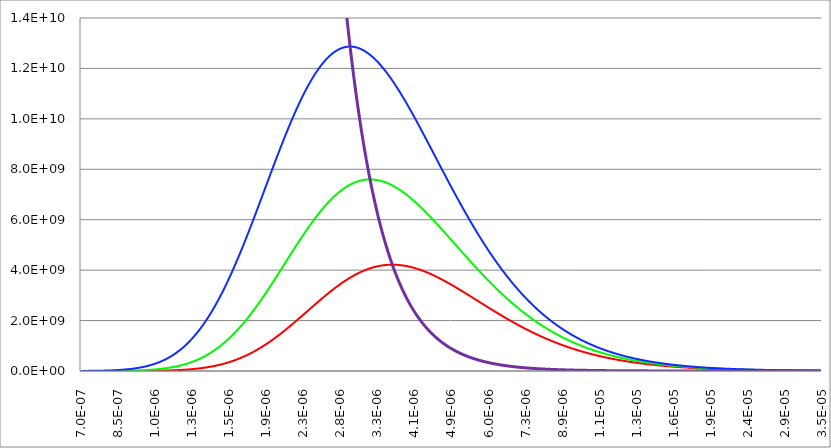
| Category | Series 1 | Series 0 | Series 2 | Series 3 |
|---|---|---|---|---|
| 7e-07 | 15470.366 | 268712.566 | 2637047.107 | 15642470399238.4 |
| 7.0137054801877e-07 | 16108.577 | 278241.494 | 2718401.957 | 15490231803650.4 |
| 7.02743779468786e-07 | 16771.471 | 288083.208 | 2802046.737 | 15339474853185.9 |
| 7.04119699604006e-07 | 17459.935 | 298247.075 | 2888039.017 | 15190185127899.2 |
| 7.05498313688677e-07 | 18174.883 | 308742.713 | 2976437.619 | 15042348348185.3 |
| 7.06879626997351e-07 | 18917.263 | 319579.997 | 3067302.632 | 14895950373413.6 |
| 7.08263644814909e-07 | 19688.049 | 330769.063 | 3160695.437 | 14750977200575.9 |
| 7.09650372436578e-07 | 20488.25 | 342320.314 | 3256678.73 | 14607414962946.5 |
| 7.11039815167953e-07 | 21318.908 | 354244.43 | 3355316.541 | 14465249928756.1 |
| 7.12431978325018e-07 | 22181.096 | 366552.37 | 3456674.26 | 14324468499878.2 |
| 7.13826867234164e-07 | 23075.925 | 379255.377 | 3560818.659 | 14185057210528.9 |
| 7.15224487232211e-07 | 24004.538 | 392364.991 | 3667817.914 | 14047002725978.2 |
| 7.16624843666428e-07 | 24968.118 | 405893.048 | 3777741.631 | 13910291841274.9 |
| 7.18027941894555e-07 | 25967.885 | 419851.694 | 3890660.867 | 13774911479983.8 |
| 7.1943378728482e-07 | 27005.096 | 434253.385 | 4006648.154 | 13640848692934.2 |
| 7.20842385215962e-07 | 28081.049 | 449110.897 | 4125777.527 | 13508090656982.1 |
| 7.22253741077253e-07 | 29197.084 | 464437.333 | 4248124.543 | 13376624673783.3 |
| 7.23667860268514e-07 | 30354.582 | 480246.131 | 4373766.309 | 13246438168578.6 |
| 7.25084748200141e-07 | 31554.967 | 496551.068 | 4502781.506 | 13117518688991.3 |
| 7.26504410293122e-07 | 32799.709 | 513366.272 | 4635250.416 | 12989853903836.4 |
| 7.27926851979058e-07 | 34090.324 | 530706.223 | 4771254.942 | 12863431601940.2 |
| 7.29352078700186e-07 | 35428.373 | 548585.77 | 4910878.641 | 12738239690973.4 |
| 7.30780095909398e-07 | 36815.467 | 567020.127 | 5054206.743 | 12614266196293.7 |
| 7.32210909070263e-07 | 38253.267 | 586024.891 | 5201326.181 | 12491499259800.7 |
| 7.33644523657047e-07 | 39743.484 | 605616.046 | 5352325.618 | 12369927138801.6 |
| 7.35080945154732e-07 | 41287.882 | 625809.968 | 5507295.468 | 12249538204888.1 |
| 7.36520179059044e-07 | 42888.279 | 646623.44 | 5666327.93 | 12130320942824.1 |
| 7.37962230876463e-07 | 44546.549 | 668073.654 | 5829517.011 | 12012263949444.3 |
| 7.39407106124256e-07 | 46264.621 | 690178.222 | 5996958.551 | 11895355932563.2 |
| 7.4085481033049e-07 | 48044.485 | 712955.187 | 6168750.256 | 11779585709895.4 |
| 7.42305349034054e-07 | 49888.189 | 736423.027 | 6344991.721 | 11664942207986 |
| 7.43758727784685e-07 | 51797.843 | 760600.668 | 6525784.46 | 11551414461151 |
| 7.45214952142983e-07 | 53775.621 | 785507.489 | 6711231.933 | 11438991610428.7 |
| 7.46674027680436e-07 | 55823.761 | 811163.336 | 6901439.576 | 11327662902541.2 |
| 7.48135959979443e-07 | 57944.568 | 837588.528 | 7096514.826 | 11217417688865.7 |
| 7.4960075463333e-07 | 60140.415 | 864803.866 | 7296567.153 | 11108245424415.7 |
| 7.51068417246375e-07 | 62413.746 | 892830.645 | 7501708.087 | 11000135666832.7 |
| 7.5253895343383e-07 | 64767.076 | 921690.661 | 7712051.249 | 10893078075387.4 |
| 7.54012368821939e-07 | 67202.993 | 951406.223 | 7927712.375 | 10787062409990.4 |
| 7.55488669047963e-07 | 69724.164 | 982000.162 | 8148809.354 | 10682078530213 |
| 7.56967859760202e-07 | 72333.329 | 1013495.841 | 8375462.249 | 10578116394316.5 |
| 7.58449946618013e-07 | 75033.312 | 1045917.167 | 8607793.332 | 10475166058293.1 |
| 7.59934935291832e-07 | 77827.016 | 1079288.597 | 8845927.112 | 10373217674913.5 |
| 7.61422831463202e-07 | 80717.429 | 1113635.154 | 9089990.366 | 10272261492785.5 |
| 7.62913640824785e-07 | 83707.624 | 1148982.433 | 9340112.167 | 10172287855421.2 |
| 7.64407369080393e-07 | 86800.761 | 1185356.616 | 9596423.919 | 10073287200313.6 |
| 7.65904021945003e-07 | 90000.094 | 1222784.478 | 9859059.381 | 9975250058021.42 |
| 7.67403605144781e-07 | 93308.966 | 1261293.403 | 10128154.705 | 9878167051263.96 |
| 7.68906124417108e-07 | 96730.815 | 1300911.393 | 10403848.46 | 9782028894023.67 |
| 7.70411585510594e-07 | 100269.177 | 1341667.08 | 10686281.669 | 9686826390658.2 |
| 7.71919994185107e-07 | 103927.688 | 1383589.734 | 10975597.836 | 9592550435020.74 |
| 7.73431356211793e-07 | 107710.085 | 1426709.282 | 11271942.978 | 9499192009589.04 |
| 7.74945677373094e-07 | 111620.21 | 1471056.313 | 11575465.659 | 9406742184602.87 |
| 7.76462963462777e-07 | 115662.011 | 1516662.092 | 11886317.017 | 9315192117209.91 |
| 7.77983220285953e-07 | 119839.546 | 1563558.574 | 12204650.8 | 9224533050619.9 |
| 7.79506453659095e-07 | 124156.986 | 1611778.416 | 12530623.396 | 9134756313267.07 |
| 7.81032669410068e-07 | 128618.616 | 1661354.985 | 12864393.864 | 9045853317980.7 |
| 7.82561873378147e-07 | 133228.838 | 1712322.377 | 13206123.966 | 8957815561163.73 |
| 7.84094071414038e-07 | 137992.175 | 1764715.424 | 13555978.201 | 8870634621979.43 |
| 7.85629269379904e-07 | 142913.274 | 1818569.711 | 13914123.835 | 8784302161545.91 |
| 7.87167473149385e-07 | 147996.908 | 1873921.588 | 14280730.935 | 8698809922138.52 |
| 7.88708688607621e-07 | 153247.977 | 1930808.18 | 14655972.399 | 8614149726399.99 |
| 7.90252921651276e-07 | 158671.515 | 1989267.405 | 15040023.989 | 8530313476558.27 |
| 7.91800178188557e-07 | 164272.692 | 2049337.984 | 15433064.365 | 8447293153651.97 |
| 7.9335046413924e-07 | 170056.813 | 2111059.457 | 15835275.116 | 8365080816763.35 |
| 7.94903785434693e-07 | 176029.328 | 2174472.194 | 16246840.793 | 8283668602258.76 |
| 7.96460148017893e-07 | 182195.83 | 2239617.411 | 16667948.939 | 8203048723036.49 |
| 7.98019557843459e-07 | 188562.06 | 2306537.184 | 17098790.127 | 8123213467781.92 |
| 7.99582020877662e-07 | 195133.911 | 2375274.462 | 17539557.987 | 8044155200229.93 |
| 8.0114754309846e-07 | 201917.43 | 2445873.08 | 17990449.24 | 7965866358434.53 |
| 8.02716130495512e-07 | 208918.823 | 2518377.779 | 18451663.734 | 7888339454045.5 |
| 8.04287789070206e-07 | 216144.456 | 2592834.213 | 18923404.47 | 7811567071592.15 |
| 8.0586252483568e-07 | 223600.864 | 2669288.97 | 19405877.643 | 7735541867774.03 |
| 8.07440343816843e-07 | 231294.749 | 2747789.584 | 19899292.664 | 7660256570758.56 |
| 8.09021252050405e-07 | 239232.983 | 2828384.548 | 20403862.203 | 7585703979485.44 |
| 8.10605255584892e-07 | 247422.621 | 2911123.335 | 20919802.214 | 7511876962977.89 |
| 8.12192360480673e-07 | 255870.892 | 2996056.407 | 21447331.97 | 7438768459660.57 |
| 8.13782572809984e-07 | 264585.214 | 3083235.234 | 21986674.097 | 7366371476684.11 |
| 8.15375898656947e-07 | 273573.191 | 3172712.309 | 22538054.602 | 7294679089256.31 |
| 8.16972344117601e-07 | 282842.62 | 3264541.163 | 23101702.909 | 7223684439979.69 |
| 8.18571915299916e-07 | 292401.495 | 3358776.381 | 23677851.89 | 7153380738195.66 |
| 8.20174618323824e-07 | 302258.01 | 3455473.618 | 24266737.895 | 7083761259334.93 |
| 8.21780459321238e-07 | 312420.566 | 3554689.616 | 24868600.786 | 7014819344274.34 |
| 8.23389444436076e-07 | 322897.769 | 3656482.218 | 25483683.97 | 6946548398699.9 |
| 8.25001579824288e-07 | 333698.445 | 3760910.385 | 26112234.426 | 6878941892476.06 |
| 8.26616871653875e-07 | 344831.632 | 3868034.216 | 26754502.741 | 6811993359021.05 |
| 8.28235326104914e-07 | 356306.595 | 3977914.958 | 27410743.139 | 6745696394688.43 |
| 8.29856949369584e-07 | 368132.826 | 4090615.03 | 28081213.514 | 6680044658154.5 |
| 8.31481747652186e-07 | 380320.046 | 4206198.032 | 28766175.457 | 6615031869811.79 |
| 8.33109727169169e-07 | 392878.216 | 4324728.769 | 29465894.293 | 6550651811168.41 |
| 8.34740894149155e-07 | 405817.538 | 4446273.265 | 30180639.105 | 6486898324253.26 |
| 8.3637525483296e-07 | 419148.46 | 4570898.778 | 30910682.77 | 6423765311026.98 |
| 8.38012815473616e-07 | 432881.682 | 4698673.82 | 31656301.985 | 6361246732798.73 |
| 8.39653582336404e-07 | 447028.16 | 4829668.177 | 32417777.302 | 6299336609648.53 |
| 8.41297561698868e-07 | 461599.112 | 4963952.918 | 33195393.152 | 6238029019855.3 |
| 8.42944759850844e-07 | 476606.024 | 5101600.422 | 33989437.877 | 6177318099330.47 |
| 8.44595183094481e-07 | 492060.653 | 5242684.39 | 34800203.761 | 6117198041057.04 |
| 8.46248837744272e-07 | 507975.034 | 5387279.864 | 35627987.057 | 6057663094534.16 |
| 8.47905730127068e-07 | 524361.485 | 5535463.246 | 36473088.015 | 5998707565227.08 |
| 8.4956586658211e-07 | 541232.612 | 5687312.315 | 37335810.914 | 5940325814022.49 |
| 8.51229253461052e-07 | 558601.317 | 5842906.244 | 38216464.086 | 5882512256689.11 |
| 8.52895897127981e-07 | 576480.799 | 6002325.621 | 39115359.946 | 5825261363343.55 |
| 8.54565803959447e-07 | 594884.565 | 6165652.464 | 40032815.019 | 5768567657921.43 |
| 8.56238980344484e-07 | 613826.431 | 6332970.243 | 40969149.967 | 5712425717653.53 |
| 8.57915432684634e-07 | 633320.534 | 6504363.894 | 41924689.617 | 5656830172547.12 |
| 8.59595167393975e-07 | 653381.329 | 6679919.842 | 42899762.987 | 5601775704872.33 |
| 8.61278190899141e-07 | 674023.606 | 6859726.015 | 43894703.308 | 5547257048653.53 |
| 8.62964509639351e-07 | 695262.486 | 7043871.867 | 44909848.057 | 5493268989165.56 |
| 8.6465413006643e-07 | 717113.434 | 7232448.394 | 45945538.978 | 5439806362435.03 |
| 8.66347058644837e-07 | 739592.261 | 7425548.152 | 47002122.106 | 5386864054746.32 |
| 8.68043301851684e-07 | 762715.135 | 7623265.279 | 48079947.794 | 5334437002152.49 |
| 8.6974286617677e-07 | 786498.584 | 7825695.511 | 49179370.734 | 5282520189990.9 |
| 8.71445758122596e-07 | 810959.501 | 8032936.203 | 50300749.985 | 5231108652403.53 |
| 8.73151984204397e-07 | 836115.156 | 8245086.345 | 51444448.992 | 5180197471862.06 |
| 8.74861550950164e-07 | 861983.198 | 8462246.586 | 52610835.61 | 5129781778697.42 |
| 8.76574464900668e-07 | 888581.664 | 8684519.245 | 53800282.127 | 5079856750634.07 |
| 8.78290732609489e-07 | 915928.985 | 8912008.341 | 55013165.285 | 5030417612328.75 |
| 8.80010360643035e-07 | 944043.994 | 9144819.601 | 56249866.301 | 4981459634913.65 |
| 8.81733355580574e-07 | 972945.932 | 9383060.488 | 57510770.885 | 4932978135544.17 |
| 8.83459724014252e-07 | 1002654.456 | 9626840.213 | 58796269.267 | 4884968476950.96 |
| 8.85189472549125e-07 | 1033189.643 | 9876269.761 | 60106756.209 | 4837426066996.39 |
| 8.8692260780318e-07 | 1064572.002 | 10131461.905 | 61442631.028 | 4790346358235.28 |
| 8.88659136407362e-07 | 1096822.481 | 10392531.227 | 62804297.613 | 4743724847479.95 |
| 8.90399065005598e-07 | 1129962.469 | 10659594.137 | 64192164.445 | 4697557075369.51 |
| 8.92142400254825e-07 | 1164013.808 | 10932768.893 | 65606644.61 | 4651838625943.28 |
| 8.93889148825011e-07 | 1198998.803 | 11212175.62 | 67048155.818 | 4606565126218.43 |
| 8.95639317399186e-07 | 1234940.223 | 11497936.327 | 68517120.42 | 4561732245771.72 |
| 8.97392912673464e-07 | 1271861.312 | 11790174.93 | 70013965.422 | 4517335696325.24 |
| 8.99149941357068e-07 | 1309785.8 | 12089017.269 | 71539122.499 | 4473371231336.27 |
| 9.0091041017236e-07 | 1348737.905 | 12394591.125 | 73093028.009 | 4429834645591.11 |
| 9.02674325854863e-07 | 1388742.346 | 12707026.244 | 74676123.007 | 4386721774802.82 |
| 9.04441695153284e-07 | 1429824.348 | 13026454.351 | 76288853.257 | 4344028495212.92 |
| 9.0621252482955e-07 | 1472009.65 | 13353009.175 | 77931669.246 | 4301750723196.94 |
| 9.07986821658821e-07 | 1515324.517 | 13686826.46 | 79605026.191 | 4259884414873.85 |
| 9.09764592429527e-07 | 1559795.744 | 14028043.991 | 81309384.052 | 4218425565719.23 |
| 9.11545843943387e-07 | 1605450.666 | 14376801.611 | 83045207.542 | 4177370210182.22 |
| 9.13330583015437e-07 | 1652317.166 | 14733241.236 | 84812966.133 | 4136714421306.3 |
| 9.15118816474057e-07 | 1700423.686 | 15097506.88 | 86613134.069 | 4096454310353.54 |
| 9.16910551160998e-07 | 1749799.233 | 15469744.668 | 88446190.367 | 4056586026432.79 |
| 9.18705793931403e-07 | 1800473.386 | 15850102.857 | 90312618.83 | 4017105756131.23 |
| 9.2050455165384e-07 | 1852476.31 | 16238731.857 | 92212908.047 | 3978009723149.65 |
| 9.22306831210322e-07 | 1905838.76 | 16635784.244 | 94147551.401 | 3939294187941.26 |
| 9.24112639496342e-07 | 1960592.093 | 17041414.782 | 96117047.072 | 3900955447354 |
| 9.25921983420888e-07 | 2016768.275 | 17455780.442 | 98121898.042 | 3862989834276.31 |
| 9.27734869906479e-07 | 2074399.891 | 17879040.415 | 100162612.093 | 3825393717286.4 |
| 9.29551305889186e-07 | 2133520.154 | 18311356.138 | 102239701.813 | 3788163500304.85 |
| 9.3137129831866e-07 | 2194162.914 | 18752891.302 | 104353684.593 | 3751295622250.74 |
| 9.3319485415816e-07 | 2256362.666 | 19203811.878 | 106505082.63 | 3714786556700.91 |
| 9.3502198038458e-07 | 2320154.564 | 19664286.132 | 108694422.921 | 3678632811552.76 |
| 9.3685268398847e-07 | 2385574.423 | 20134484.64 | 110922237.267 | 3642830928690.19 |
| 9.38686971974069e-07 | 2452658.735 | 20614580.307 | 113189062.263 | 3607377483652.8 |
| 9.40524851359333e-07 | 2521444.675 | 21104748.387 | 115495439.298 | 3572269085308.38 |
| 9.42366329175955e-07 | 2591970.112 | 21605166.494 | 117841914.55 | 3537502375528.55 |
| 9.44211412469395e-07 | 2664273.617 | 22116014.624 | 120229038.977 | 3503074028867.52 |
| 9.46060108298909e-07 | 2738394.476 | 22637475.168 | 122657368.315 | 3468980752244.05 |
| 9.47912423737576e-07 | 2814372.695 | 23169732.931 | 125127463.063 | 3435219284626.42 |
| 9.49768365872321e-07 | 2892249.013 | 23712975.147 | 127639888.48 | 3401786396720.56 |
| 9.51627941803946e-07 | 2972064.913 | 24267391.495 | 130195214.57 | 3368678890661.14 |
| 9.53491158647154e-07 | 3053862.628 | 24833174.115 | 132794016.077 | 3335893599705.67 |
| 9.55358023530582e-07 | 3137685.153 | 25410517.624 | 135436872.466 | 3303427387931.66 |
| 9.5722854359682e-07 | 3223576.258 | 25999619.129 | 138124367.913 | 3271277149936.63 |
| 9.59102726002443e-07 | 3311580.491 | 26600678.246 | 140857091.293 | 3239439810541.07 |
| 9.60980577918044e-07 | 3401743.195 | 27213897.113 | 143635636.158 | 3207912324494.31 |
| 9.62862106528247e-07 | 3494110.515 | 27839480.404 | 146460600.729 | 3176691676183.27 |
| 9.64747319031749e-07 | 3588729.408 | 28477635.343 | 149332587.87 | 3145774879343.95 |
| 9.6663622264134e-07 | 3685647.654 | 29128571.721 | 152252205.077 | 3115158976775.85 |
| 9.68528824583929e-07 | 3784913.866 | 29792501.906 | 155220064.451 | 3084841040059.09 |
| 9.7042513210058e-07 | 3886577.501 | 30469640.86 | 158236782.684 | 3054818169274.32 |
| 9.72325152446531e-07 | 3990688.869 | 31160206.152 | 161302981.029 | 3025087492725.32 |
| 9.74228892891225e-07 | 4097299.146 | 31864417.966 | 164419285.286 | 2995646166664.32 |
| 9.76136360718341e-07 | 4206460.379 | 32582499.122 | 167586325.77 | 2966491375020.04 |
| 9.78047563225816e-07 | 4318225.505 | 33314675.082 | 170804737.288 | 2937620329128.27 |
| 9.79962507725876e-07 | 4432648.352 | 34061173.964 | 174075159.114 | 2909030267465.17 |
| 9.81881201545066e-07 | 4549783.656 | 34822226.556 | 177398234.96 | 2880718455383.14 |
| 9.83803652024274e-07 | 4669687.071 | 35598066.322 | 180774612.945 | 2852682184849.21 |
| 9.85729866518761e-07 | 4792415.176 | 36388929.419 | 184204945.567 | 2824918774186.05 |
| 9.8765985239819e-07 | 4918025.489 | 37195054.706 | 187689889.671 | 2797425567815.44 |
| 9.89593617046652e-07 | 5046576.476 | 38016683.753 | 191230106.416 | 2770199936004.3 |
| 9.91531167862697e-07 | 5178127.561 | 38854060.851 | 194826261.241 | 2743239274613.13 |
| 9.93472512259359e-07 | 5312739.14 | 39707433.023 | 198479023.831 | 2716541004846.9 |
| 9.95417657664187e-07 | 5450472.587 | 40577050.034 | 202189068.078 | 2690102573008.45 |
| 9.97366611519274e-07 | 5591390.268 | 41463164.398 | 205957072.046 | 2663921450254.18 |
| 9.99319381281282e-07 | 5735555.55 | 42366031.388 | 209783717.932 | 2637995132352.16 |
| 1.00127597442147e-06 | 5883032.814 | 43285909.044 | 213669692.024 | 2612321139442.64 |
| 1.00323639842574e-06 | 6033887.46 | 44223058.178 | 217615684.66 | 2586897015800.83 |
| 1.00520066079463e-06 | 6188185.926 | 45177742.387 | 221622390.188 | 2561720329601.98 |
| 1.00716876904337e-06 | 6345995.691 | 46150228.054 | 225690506.918 | 2536788672688.83 |
| 1.00914073070191e-06 | 6507385.29 | 47140784.359 | 229820737.082 | 2512099660341.23 |
| 1.01111655331494e-06 | 6672424.324 | 48149683.282 | 234013786.782 | 2487650931048.05 |
| 1.01309624444193e-06 | 6841183.469 | 49177199.611 | 238270365.944 | 2463440146281.31 |
| 1.01507981165714e-06 | 7013734.489 | 50223610.944 | 242591188.273 | 2439464990272.49 |
| 1.01706726254965e-06 | 7190150.244 | 51289197.698 | 246976971.197 | 2415723169791.03 |
| 1.01905860472343e-06 | 7370504.701 | 52374243.11 | 251428435.819 | 2392212413924.98 |
| 1.02105384579731e-06 | 7554872.949 | 53479033.241 | 255946306.862 | 2368930473863.78 |
| 1.02305299340504e-06 | 7743331.201 | 54603856.981 | 260531312.616 | 2345875122683.17 |
| 1.02505605519534e-06 | 7935956.814 | 55749006.048 | 265184184.883 | 2323044155132.19 |
| 1.02706303883188e-06 | 8132828.291 | 56914774.998 | 269905658.919 | 2300435387422.23 |
| 1.02907395199334e-06 | 8334025.298 | 58101461.218 | 274696473.376 | 2278046657018.16 |
| 1.03108880237345e-06 | 8539628.669 | 59309364.931 | 279557370.242 | 2255875822431.48 |
| 1.03310759768097e-06 | 8749720.422 | 60538789.198 | 284489094.784 | 2233920763015.5 |
| 1.0351303456398e-06 | 8964383.763 | 61790039.917 | 289492395.481 | 2212179378762.48 |
| 1.03715705398892e-06 | 9183703.101 | 63063425.823 | 294568023.961 | 2190649590102.75 |
| 1.03918773048249e-06 | 9407764.056 | 64359258.486 | 299716734.943 | 2169329337705.85 |
| 1.04122238288984e-06 | 9636653.471 | 65677852.309 | 304939286.162 | 2148216582283.51 |
| 1.04326101899551e-06 | 9870459.418 | 67019524.531 | 310236438.307 | 2127309304394.61 |
| 1.04530364659929e-06 | 10109271.214 | 68384595.218 | 315608954.951 | 2106605504252.01 |
| 1.04735027351623e-06 | 10353179.424 | 69773387.264 | 321057602.483 | 2086103201531.27 |
| 1.0494009075767e-06 | 10602275.877 | 71186226.386 | 326583150.032 | 2065800435181.25 |
| 1.05145555662638e-06 | 10856653.673 | 72623441.119 | 332186369.401 | 2045695263236.52 |
| 1.05351422852632e-06 | 11116407.19 | 74085362.812 | 337868034.987 | 2025785762631.59 |
| 1.05557693115297e-06 | 11381632.101 | 75572325.625 | 343628923.71 | 2006070029017.01 |
| 1.05764367239818e-06 | 11652425.375 | 77084666.518 | 349469814.935 | 1986546176577.2 |
| 1.05971446016928e-06 | 11928885.293 | 78622725.247 | 355391490.395 | 1967212337850.07 |
| 1.06178930238906e-06 | 12211111.452 | 80186844.357 | 361394734.111 | 1948066663548.37 |
| 1.06386820699584e-06 | 12499204.78 | 81777369.174 | 367480332.312 | 1929107322382.87 |
| 1.06595118194345e-06 | 12793267.541 | 83394647.794 | 373649073.354 | 1910332500887.12 |
| 1.06803823520134e-06 | 13093403.343 | 85039031.079 | 379901747.635 | 1891740403244.07 |
| 1.07012937475452e-06 | 13399717.152 | 86710872.642 | 386239147.517 | 1873329251114.22 |
| 1.07222460860366e-06 | 13712315.295 | 88410528.838 | 392662067.231 | 1855097283465.59 |
| 1.07432394476508e-06 | 14031305.475 | 90138358.756 | 399171302.799 | 1837042756405.22 |
| 1.07642739127082e-06 | 14356796.772 | 91894724.201 | 405767651.942 | 1819163943012.43 |
| 1.07853495616862e-06 | 14688899.658 | 93679989.689 | 412451913.991 | 1801459133173.56 |
| 1.08064664752197e-06 | 15027726.002 | 95494522.427 | 419224889.796 | 1783926633418.47 |
| 1.08276247341019e-06 | 15373389.079 | 97338692.304 | 426087381.637 | 1766564766758.53 |
| 1.08488244192838e-06 | 15726003.578 | 99212871.874 | 433040193.13 | 1749371872526.19 |
| 1.0870065611875e-06 | 16085685.608 | 101117436.341 | 440084129.13 | 1732346306216.18 |
| 1.08913483931439e-06 | 16452552.711 | 103052763.545 | 447219995.64 | 1715486439328.19 |
| 1.09126728445182e-06 | 16826723.863 | 105019233.944 | 454448599.713 | 1698790659211.1 |
| 1.09340390475847e-06 | 17208319.487 | 107017230.595 | 461770749.351 | 1682257368908.76 |
| 1.09554470840901e-06 | 17597461.455 | 109047139.141 | 469187253.411 | 1665884987007.2 |
| 1.09768970359413e-06 | 17994273.099 | 111109347.786 | 476698921.504 | 1649671947483.37 |
| 1.09983889852054e-06 | 18398879.219 | 113204247.281 | 484306563.89 | 1633616699555.39 |
| 1.10199230141102e-06 | 18811406.085 | 115332230.9 | 492010991.38 | 1617717707534.18 |
| 1.10414992050445e-06 | 19231981.446 | 117493694.423 | 499813015.23 | 1601973450676.59 |
| 1.10631176405584e-06 | 19660734.539 | 119689036.11 | 507713447.036 | 1586382423039.92 |
| 1.10847784033636e-06 | 20097796.09 | 121918656.681 | 515713098.631 | 1570943133337.9 |
| 1.1106481576334e-06 | 20543298.324 | 124182959.296 | 523812781.975 | 1555654104798.02 |
| 1.11282272425053e-06 | 20997374.971 | 126482349.524 | 532013309.049 | 1540513875020.33 |
| 1.11500154850763e-06 | 21460161.268 | 128817235.324 | 540315491.744 | 1525520995837.49 |
| 1.11718463874082e-06 | 21931793.967 | 131188027.02 | 548720141.753 | 1510674033176.29 |
| 1.11937200330257e-06 | 22412411.342 | 133595137.271 | 557228070.458 | 1495971566920.5 |
| 1.1215636505617e-06 | 22902153.19 | 136038981.047 | 565840088.82 | 1481412190774.98 |
| 1.12375958890342e-06 | 23401160.839 | 138519975.601 | 574557007.262 | 1466994512131.23 |
| 1.12595982672934e-06 | 23909577.149 | 141038540.442 | 583379635.558 | 1452717151934.15 |
| 1.12816437245754e-06 | 24427546.521 | 143595097.303 | 592308782.716 | 1438578744550.11 |
| 1.13037323452257e-06 | 24955214.899 | 146190070.112 | 601345256.864 | 1424577937636.41 |
| 1.13258642137549e-06 | 25492729.772 | 148823884.965 | 610489865.128 | 1410713392011.82 |
| 1.13480394148392e-06 | 26040240.18 | 151496970.089 | 619743413.519 | 1396983781528.58 |
| 1.13702580333206e-06 | 26597896.718 | 154209755.814 | 629106706.81 | 1383387792945.51 |
| 1.1392520154207e-06 | 27165851.535 | 156962674.54 | 638580548.419 | 1369924125802.37 |
| 1.14148258626729e-06 | 27744258.344 | 159756160.701 | 648165740.286 | 1356591492295.55 |
| 1.14371752440596e-06 | 28333272.416 | 162590650.73 | 657863082.75 | 1343388617154.82 |
| 1.14595683838754e-06 | 28933050.591 | 165466583.029 | 667673374.43 | 1330314237521.37 |
| 1.14820053677961e-06 | 29543751.272 | 168384397.928 | 677597412.098 | 1317367102827.04 |
| 1.15044862816652e-06 | 30165534.436 | 171344537.65 | 687635990.557 | 1304545974674.67 |
| 1.15270112114942e-06 | 30798561.625 | 174347446.273 | 697789902.513 | 1291849626719.67 |
| 1.15495802434631e-06 | 31442995.957 | 177393569.692 | 708059938.451 | 1279276844552.71 |
| 1.15721934639207e-06 | 32099002.121 | 180483355.581 | 718446886.509 | 1266826425583.57 |
| 1.15948509593847e-06 | 32766746.38 | 183617253.351 | 728951532.347 | 1254497178926.08 |
| 1.16175528165423e-06 | 33446396.572 | 186795714.113 | 739574659.022 | 1242287925284.27 |
| 1.16402991222504e-06 | 34138122.108 | 190019190.631 | 750317046.858 | 1230197496839.51 |
| 1.1663089963536e-06 | 34842093.973 | 193288137.284 | 761179473.317 | 1218224737138.85 |
| 1.16859254275964e-06 | 35558484.728 | 196603010.024 | 772162712.864 | 1206368500984.38 |
| 1.17088056017997e-06 | 36287468.504 | 199964266.328 | 783267536.843 | 1194627654323.71 |
| 1.1731730573685e-06 | 37029221.008 | 203372365.157 | 794494713.342 | 1183001074141.48 |
| 1.17547004309628e-06 | 37783919.513 | 206827766.91 | 805845007.06 | 1171487648351.96 |
| 1.17777152615156e-06 | 38551742.866 | 210330933.378 | 817319179.173 | 1160086275692.66 |
| 1.18007751533974e-06 | 39332871.476 | 213882327.695 | 828917987.204 | 1148795865619 |
| 1.18238801948352e-06 | 40127487.322 | 217482414.296 | 840642184.889 | 1137615338200.03 |
| 1.18470304742284e-06 | 40935773.941 | 221131658.861 | 852492522.037 | 1126543624015.07 |
| 1.18702260801495e-06 | 41757916.43 | 224830528.272 | 864469744.403 | 1115579664051.49 |
| 1.18934671013445e-06 | 42594101.445 | 228579490.564 | 876574593.545 | 1104722409603.37 |
| 1.19167536267331e-06 | 43444517.191 | 232379014.867 | 888807806.694 | 1093970822171.19 |
| 1.19400857454093e-06 | 44309353.421 | 236229571.363 | 901170116.613 | 1083323873362.54 |
| 1.19634635466411e-06 | 45188801.435 | 240131631.23 | 913662251.464 | 1072780544793.69 |
| 1.19868871198718e-06 | 46083054.071 | 244085666.589 | 926284934.669 | 1062339827992.23 |
| 1.20103565547195e-06 | 46992305.699 | 248092150.451 | 939038884.772 | 1052000724300.62 |
| 1.20338719409778e-06 | 47916752.222 | 252151556.664 | 951924815.302 | 1041762244780.59 |
| 1.20574333686161e-06 | 48856591.062 | 256264359.857 | 964943434.637 | 1031623410118.66 |
| 1.20810409277802e-06 | 49812021.162 | 260431035.385 | 978095445.861 | 1021583250532.37 |
| 1.21046947087919e-06 | 50783242.974 | 264652059.27 | 991381546.629 | 1011640805677.57 |
| 1.21283948021505e-06 | 51770458.452 | 268927908.148 | 1004802429.026 | 1001795124556.55 |
| 1.21521412985318e-06 | 52773871.049 | 273259059.209 | 1018358779.43 | 992045265427.081 |
| 1.21759342887897e-06 | 53793685.707 | 277645990.139 | 1032051278.372 | 982390295712.34 |
| 1.21997738639557e-06 | 54830108.848 | 282089179.058 | 1045880600.396 | 972829291911.697 |
| 1.22236601152395e-06 | 55883348.366 | 286589104.465 | 1059847413.919 | 963361339512.391 |
| 1.22475931340296e-06 | 56953613.622 | 291146245.175 | 1073952381.093 | 953985532902.054 |
| 1.22715730118933e-06 | 58041115.429 | 295761080.257 | 1088196157.666 | 944700975282.09 |
| 1.2295599840577e-06 | 59146066.046 | 300434088.974 | 1102579392.838 | 935506778581.894 |
| 1.23196737120072e-06 | 60268679.168 | 305165750.718 | 1117102729.126 | 926402063373.91 |
| 1.23437947182899e-06 | 61409169.916 | 309956544.949 | 1131766802.223 | 917385958789.51 |
| 1.23679629517117e-06 | 62567754.824 | 314806951.13 | 1146572240.857 | 908457602435.701 |
| 1.23921785047398e-06 | 63744651.83 | 319717448.663 | 1161519666.652 | 899616140312.633 |
| 1.24164414700226e-06 | 64940080.264 | 324688516.824 | 1176609693.991 | 890860726731.912 |
| 1.24407519403896e-06 | 66154260.836 | 329720634.695 | 1191842929.872 | 882190524235.712 |
| 1.24651100088523e-06 | 67387415.624 | 334814281.102 | 1207219973.772 | 873604703516.675 |
| 1.24895157686043e-06 | 68639768.061 | 339969934.544 | 1222741417.507 | 865102443338.579 |
| 1.25139693130215e-06 | 69911542.923 | 345188073.127 | 1238407845.096 | 856682930457.797 |
| 1.25384707356628e-06 | 71202966.312 | 350469174.497 | 1254219832.618 | 848345359545.501 |
| 1.25630201302702e-06 | 72514265.646 | 355813715.769 | 1270177948.074 | 840088933110.638 |
| 1.25876175907693e-06 | 73845669.643 | 361222173.457 | 1286282751.253 | 831912861423.646 |
| 1.26122632112694e-06 | 75197408.308 | 366695023.41 | 1302534793.592 | 823816362440.92 |
| 1.26369570860642e-06 | 76569712.913 | 372232740.733 | 1318934618.039 | 815798661730.004 |
| 1.26616993096322e-06 | 77962815.986 | 377835799.723 | 1335482758.913 | 807858992395.522 |
| 1.26864899766366e-06 | 79376951.296 | 383504673.794 | 1352179741.774 | 799996595005.82 |
| 1.27113291819261e-06 | 80812353.829 | 389239835.406 | 1369026083.28 | 792210717520.329 |
| 1.2736217020535e-06 | 82269259.781 | 395041755.992 | 1386022291.057 | 784500615217.629 |
| 1.27611535876838e-06 | 83747906.534 | 400910905.885 | 1403168863.559 | 776865550624.219 |
| 1.27861389787792e-06 | 85248532.64 | 406847754.245 | 1420466289.939 | 769304793443.978 |
| 1.28111732894151e-06 | 86771377.803 | 412852768.985 | 1437915049.91 | 761817620488.307 |
| 1.28362566153721e-06 | 88316682.861 | 418926416.696 | 1455515613.612 | 754403315606.963 |
| 1.28613890526187e-06 | 89884689.766 | 425069162.571 | 1473268441.484 | 747061169619.552 |
| 1.28865706973111e-06 | 91475641.566 | 431281470.333 | 1491173984.126 | 739790480247.702 |
| 1.29118016457939e-06 | 93089782.382 | 437563802.156 | 1509232682.17 | 732590552047.882 |
| 1.29370819946002e-06 | 94727357.393 | 443916618.588 | 1527444966.15 | 725460696344.894 |
| 1.29624118404522e-06 | 96388612.809 | 450340378.478 | 1545811256.37 | 718400231165.989 |
| 1.29877912802613e-06 | 98073795.855 | 456835538.898 | 1564331962.778 | 711408481175.645 |
| 1.3013220411129e-06 | 99783154.747 | 463402555.063 | 1583007484.832 | 704484777610.966 |
| 1.30386993303466e-06 | 101516938.669 | 470041880.254 | 1601838211.378 | 697628458217.715 |
| 1.30642281353959e-06 | 103275397.755 | 476753965.743 | 1620824520.519 | 690838867186.974 |
| 1.30898069239498e-06 | 105058783.06 | 483539260.71 | 1639966779.491 | 684115355092.407 |
| 1.31154357938723e-06 | 106867346.54 | 490398212.168 | 1659265344.538 | 677457278828.153 |
| 1.31411148432188e-06 | 108701341.031 | 497331264.882 | 1678720560.787 | 670864001547.301 |
| 1.31668441702371e-06 | 110561020.219 | 504338861.287 | 1698332762.126 | 664334892600.987 |
| 1.31926238733671e-06 | 112446638.619 | 511421441.415 | 1718102271.078 | 657869327478.062 |
| 1.32184540512414e-06 | 114358451.549 | 518579442.808 | 1738029398.687 | 651466687745.364 |
| 1.32443348026859e-06 | 116296715.106 | 525813300.442 | 1758114444.391 | 645126360988.564 |
| 1.32702662267199e-06 | 118261686.138 | 533123446.644 | 1778357695.905 | 638847740753.585 |
| 1.32962484225564e-06 | 120253622.219 | 540510311.014 | 1798759429.105 | 632630226488.597 |
| 1.3322281489603e-06 | 122272781.622 | 547974320.34 | 1819319907.909 | 626473223486.575 |
| 1.33483655274617e-06 | 124319423.293 | 555515898.521 | 1840039384.162 | 620376142828.41 |
| 1.33745006359295e-06 | 126393806.82 | 563135466.483 | 1860918097.522 | 614338401326.587 |
| 1.3400686914999e-06 | 128496192.409 | 570833442.097 | 1881956275.345 | 608359421469.396 |
| 1.34269244648583e-06 | 130626840.855 | 578610240.1 | 1903154132.575 | 602438631365.695 |
| 1.34532133858918e-06 | 132786013.51 | 586466272.012 | 1924511871.632 | 596575464690.209 |
| 1.34795537786806e-06 | 134973972.257 | 594401946.051 | 1946029682.303 | 590769360629.36 |
| 1.35059457440024e-06 | 137190979.48 | 602417667.055 | 1967707741.633 | 585019763827.628 |
| 1.35323893828325e-06 | 139437298.034 | 610513836.399 | 1989546213.818 | 579326124334.425 |
| 1.35588847963438e-06 | 141713191.213 | 618690851.91 | 2011545250.103 | 573687897551.498 |
| 1.35854320859071e-06 | 144018922.719 | 626949107.787 | 2033704988.671 | 568104544180.834 |
| 1.36120313530921e-06 | 146354756.636 | 635288994.519 | 2056025554.548 | 562575530173.08 |
| 1.3638682699667e-06 | 148720957.391 | 643710898.8 | 2078507059.497 | 557100326676.456 |
| 1.36653862275994e-06 | 151117789.726 | 652215203.45 | 2101149601.919 | 551678409986.175 |
| 1.36921420390565e-06 | 153545518.667 | 660802287.328 | 2123953266.754 | 546309261494.348 |
| 1.37189502364056e-06 | 156004409.488 | 669472525.254 | 2146918125.389 | 540992367640.376 |
| 1.37458109222143e-06 | 158494727.678 | 678226287.925 | 2170044235.556 | 535727219861.837 |
| 1.37727241992512e-06 | 161016738.912 | 687063941.831 | 2193331641.242 | 530513314545.831 |
| 1.3799690170486e-06 | 163570709.01 | 695985849.174 | 2216780372.599 | 525350152980.818 |
| 1.382670893909e-06 | 166156903.91 | 704992367.786 | 2240390445.847 | 520237241308.908 |
| 1.38537806084365e-06 | 168775589.627 | 714083851.046 | 2264161863.194 | 515174090478.633 |
| 1.38809052821014e-06 | 171427032.223 | 723260647.8 | 2288094612.742 | 510160216198.159 |
| 1.3908083063863e-06 | 174111497.768 | 732523102.275 | 2312188668.402 | 505195138888.971 |
| 1.39353140577031e-06 | 176829252.306 | 741871554.001 | 2336443989.816 | 500278383639.999 |
| 1.3962598367807e-06 | 179580561.819 | 751306337.729 | 2360860522.269 | 495409480162.188 |
| 1.3989936098564e-06 | 182365692.192 | 760827783.345 | 2385438196.61 | 490587962743.522 |
| 1.40173273545677e-06 | 185184909.171 | 770436215.797 | 2410176929.177 | 485813370204.475 |
| 1.40447722406166e-06 | 188038478.333 | 780131955.005 | 2435076621.716 | 481085245853.898 |
| 1.40722708617144e-06 | 190926665.042 | 789915315.787 | 2460137161.308 | 476403137445.338 |
| 1.40998233230703e-06 | 193849734.415 | 799786607.775 | 2485358420.297 | 471766597133.781 |
| 1.41274297300995e-06 | 196807951.286 | 809746135.336 | 2510740256.217 | 467175181432.813 |
| 1.41550901884237e-06 | 199801580.161 | 819794197.49 | 2536282511.724 | 462628451172.203 |
| 1.41828048038712e-06 | 202830885.184 | 829931087.834 | 2561985014.527 | 458125971455.894 |
| 1.42105736824777e-06 | 205896130.099 | 840157094.458 | 2587847577.327 | 453667311620.41 |
| 1.42383969304864e-06 | 208997578.206 | 850472499.87 | 2613869997.746 | 449252045193.652 |
| 1.42662746543486e-06 | 212135492.325 | 860877580.914 | 2640052058.272 | 444879749854.122 |
| 1.4294206960724e-06 | 215310134.757 | 871372608.695 | 2666393526.196 | 440550007390.511 |
| 1.4322193956481e-06 | 218521767.239 | 881957848.497 | 2692894153.558 | 436262403661.711 |
| 1.43502357486975e-06 | 221770650.908 | 892633559.708 | 2719553677.085 | 432016528557.19 |
| 1.43783324446607e-06 | 225057046.259 | 903399995.744 | 2746371818.144 | 427811975957.777 |
| 1.44064841518682e-06 | 228381213.103 | 914257403.969 | 2773348282.686 | 423648343696.806 |
| 1.44346909780279e-06 | 231743410.526 | 925206025.62 | 2800482761.2 | 419525233521.655 |
| 1.44629530310586e-06 | 235143896.849 | 936246095.732 | 2827774928.664 | 415442251055.651 |
| 1.44912704190904e-06 | 238582929.585 | 947377843.062 | 2855224444.496 | 411399005760.347 |
| 1.45196432504652e-06 | 242060765.397 | 958601490.015 | 2882830952.519 | 407395110898.17 |
| 1.45480716337369e-06 | 245577660.054 | 969917252.567 | 2910594080.912 | 403430183495.425 |
| 1.4576555677672e-06 | 249133868.393 | 981325340.196 | 2938513442.176 | 399503844305.667 |
| 1.46050954912499e-06 | 252729644.272 | 992825955.802 | 2966588633.094 | 395615717773.423 |
| 1.46336911836634e-06 | 256365240.53 | 1004419295.642 | 2994819234.7 | 391765431998.274 |
| 1.46623428643193e-06 | 260040908.94 | 1016105549.252 | 3023204812.241 | 387952618699.278 |
| 1.46910506428381e-06 | 263756900.171 | 1027884899.377 | 3051744915.152 | 384176913179.749 |
| 1.47198146290556e-06 | 267513463.741 | 1039757521.904 | 3080439077.027 | 380437954292.368 |
| 1.4748634933022e-06 | 271310847.973 | 1051723585.785 | 3109286815.59 | 376735384404.642 |
| 1.47775116650035e-06 | 275149299.953 | 1063783252.972 | 3138287632.674 | 373068849364.699 |
| 1.48064449354818e-06 | 279029065.484 | 1075936678.349 | 3167441014.198 | 369437998467.407 |
| 1.48354348551552e-06 | 282950389.045 | 1088184009.659 | 3196746430.15 | 365842484420.837 |
| 1.48644815349385e-06 | 286913513.741 | 1100525387.44 | 3226203334.567 | 362281963313.034 |
| 1.48935850859639e-06 | 290918681.266 | 1112960944.96 | 3255811165.523 | 358756094579.132 |
| 1.4922745619581e-06 | 294966131.852 | 1125490808.144 | 3285569345.116 | 355264540968.775 |
| 1.49519632473574e-06 | 299056104.225 | 1138115095.517 | 3315477279.455 | 351806968513.854 |
| 1.49812380810794e-06 | 303188835.564 | 1150833918.134 | 3345534358.657 | 348383046496.572 |
| 1.50105702327519e-06 | 307364561.453 | 1163647379.517 | 3375739956.837 | 344992447417.804 |
| 1.50399598145992e-06 | 311583515.836 | 1176555575.594 | 3406093432.106 | 341634846965.773 |
| 1.50694069390654e-06 | 315845930.971 | 1189558594.634 | 3436594126.573 | 338309923985.031 |
| 1.50989117188145e-06 | 320152037.389 | 1202656517.19 | 3467241366.342 | 335017360445.74 |
| 1.51284742667314e-06 | 324502063.84 | 1215849416.032 | 3498034461.517 | 331756841413.25 |
| 1.51580946959218e-06 | 328896237.259 | 1229137356.095 | 3528972706.209 | 328528055017.98 |
| 1.5187773119713e-06 | 333334782.709 | 1242520394.412 | 3560055378.543 | 325330692425.582 |
| 1.5217509651654e-06 | 337817923.345 | 1255998580.064 | 3591281740.671 | 322164447807.407 |
| 1.52473044055165e-06 | 342345880.36 | 1269571954.117 | 3622651038.781 | 319029018311.246 |
| 1.52771574952944e-06 | 346918872.947 | 1283240549.57 | 3654162503.115 | 315924104032.367 |
| 1.53070690352053e-06 | 351537118.246 | 1297004391.296 | 3685815347.986 | 312849407984.828 |
| 1.53370391396901e-06 | 356200831.305 | 1310863495.993 | 3717608771.799 | 309804636073.066 |
| 1.5367067923414e-06 | 360910225.028 | 1324817872.123 | 3749541957.071 | 306789497063.775 |
| 1.53971555012665e-06 | 365665510.136 | 1338867519.869 | 3781614070.456 | 303803702558.042 |
| 1.54273019883622e-06 | 370466895.113 | 1353012431.076 | 3813824262.775 | 300846966963.763 |
| 1.54575075000409e-06 | 375314586.169 | 1367252589.205 | 3846171669.042 | 297919007468.329 |
| 1.54877721518685e-06 | 380208787.186 | 1381587969.283 | 3878655408.496 | 295019544011.575 |
| 1.55180960596369e-06 | 385149699.68 | 1396018537.853 | 3911274584.638 | 292148299258.986 |
| 1.5548479339365e-06 | 390137522.749 | 1410544252.927 | 3944028285.262 | 289304998575.176 |
| 1.55789221072985e-06 | 395172453.031 | 1425165063.944 | 3976915582.5 | 286489369997.619 |
| 1.5609424479911e-06 | 400254684.657 | 1439880911.717 | 4009935532.857 | 283701144210.632 |
| 1.5639986573904e-06 | 405384409.206 | 1454691728.399 | 4043087177.259 | 280940054519.617 |
| 1.56706085062075e-06 | 410561815.661 | 1469597437.43 | 4076369541.097 | 278205836825.552 |
| 1.57012903939805e-06 | 415787090.359 | 1484597953.502 | 4109781634.274 | 275498229599.728 |
| 1.57320323546114e-06 | 421060416.952 | 1499693182.516 | 4143322451.256 | 272816973858.736 |
| 1.57628345057183e-06 | 426381976.358 | 1514883021.541 | 4176990971.126 | 270161813139.694 |
| 1.57936969651497e-06 | 431751946.716 | 1530167358.778 | 4210786157.637 | 267532493475.717 |
| 1.58246198509849e-06 | 437170503.343 | 1545546073.522 | 4244706959.272 | 264928763371.622 |
| 1.58556032815343e-06 | 442637818.688 | 1561019036.123 | 4278752309.298 | 262350373779.877 |
| 1.58866473753399e-06 | 448154062.287 | 1576586107.956 | 4312921125.836 | 259797078076.777 |
| 1.59177522511759e-06 | 453719400.72 | 1592247141.383 | 4347212311.918 | 257268632038.854 |
| 1.59489180280489e-06 | 459333997.565 | 1608001979.722 | 4381624755.557 | 254764793819.518 |
| 1.59801448251987e-06 | 464998013.357 | 1623850457.215 | 4416157329.816 | 252285323925.923 |
| 1.60114327620985e-06 | 470711605.538 | 1639792398.999 | 4450808892.878 | 249829985196.062 |
| 1.60427819584553e-06 | 476474928.421 | 1655827621.074 | 4485578288.117 | 247398542776.079 |
| 1.60741925342107e-06 | 482288133.141 | 1671955930.28 | 4520464344.178 | 244990764097.809 |
| 1.61056646095408e-06 | 488151367.612 | 1688177124.265 | 4555465875.053 | 242606418856.529 |
| 1.61371983048573e-06 | 494064776.488 | 1704490991.463 | 4590581680.159 | 240245278988.931 |
| 1.61687937408077e-06 | 500028501.113 | 1720897311.069 | 4625810544.424 | 237907118651.309 |
| 1.62004510382753e-06 | 506042679.488 | 1737395853.018 | 4661151238.366 | 235591714197.954 |
| 1.62321703183806e-06 | 512107446.218 | 1753986377.959 | 4696602518.186 | 233298844159.764 |
| 1.62639517024809e-06 | 518222932.479 | 1770668637.239 | 4732163125.852 | 231028289223.063 |
| 1.62957953121712e-06 | 524389265.97 | 1787442372.881 | 4767831789.192 | 228779832208.618 |
| 1.63277012692846e-06 | 530606570.875 | 1804307317.57 | 4803607221.986 | 226553258050.868 |
| 1.63596696958928e-06 | 536874967.819 | 1821263194.632 | 4839488124.063 | 224348353777.357 |
| 1.63917007143063e-06 | 543194573.828 | 1838309718.022 | 4875473181.397 | 222164908488.356 |
| 1.64237944470752e-06 | 549565502.291 | 1855446592.309 | 4911561066.206 | 220002713336.696 |
| 1.64559510169897e-06 | 555987862.914 | 1872673512.665 | 4947750437.056 | 217861561507.79 |
| 1.64881705470801e-06 | 562461761.686 | 1889990164.851 | 4984039938.963 | 215741248199.85 |
| 1.65204531606179e-06 | 568987300.835 | 1907396225.209 | 5020428203.497 | 213641570604.299 |
| 1.65527989811157e-06 | 575564578.789 | 1924891360.655 | 5056913848.895 | 211562327886.371 |
| 1.65852081323281e-06 | 582193690.14 | 1942475228.668 | 5093495480.166 | 209503321165.903 |
| 1.66176807382519e-06 | 588874725.602 | 1960147477.287 | 5130171689.203 | 207464353498.31 |
| 1.66502169231268e-06 | 595607771.974 | 1977907745.107 | 5166941054.901 | 205445229855.749 |
| 1.66828168114355e-06 | 602392912.101 | 1995755661.272 | 5203802143.271 | 203445757108.463 |
| 1.67154805279046e-06 | 609230224.841 | 2013690845.478 | 5240753507.554 | 201465744006.31 |
| 1.67482081975051e-06 | 616119785.019 | 2031712907.971 | 5277793688.347 | 199505001160.467 |
| 1.67809999454523e-06 | 623061663.399 | 2049821449.546 | 5314921213.722 | 197563341025.317 |
| 1.68138558972069e-06 | 630055926.644 | 2068016061.551 | 5352134599.346 | 195640577880.511 |
| 1.68467761784752e-06 | 637102637.278 | 2086296325.89 | 5389432348.615 | 193736527813.201 |
| 1.68797609152096e-06 | 644201853.657 | 2104661815.031 | 5426812952.773 | 191851008700.452 |
| 1.69128102336091e-06 | 651353629.924 | 2123112092.007 | 5464274891.047 | 189983840191.817 |
| 1.69459242601198e-06 | 658558015.985 | 2141646710.428 | 5501816630.775 | 188134843692.093 |
| 1.69791031214355e-06 | 665815057.466 | 2160265214.49 | 5539436627.541 | 186303842344.234 |
| 1.70123469444977e-06 | 673124795.688 | 2178967138.983 | 5577133325.306 | 184490661012.433 |
| 1.70456558564969e-06 | 680487267.623 | 2197752009.305 | 5614905156.552 | 182695126265.377 |
| 1.70790299848723e-06 | 687902505.873 | 2216619341.475 | 5652750542.412 | 180917066359.649 |
| 1.71124694573127e-06 | 695370538.629 | 2235568642.148 | 5690667892.815 | 179156311223.309 |
| 1.7145974401757e-06 | 702891389.642 | 2254599408.631 | 5728655606.626 | 177412692439.623 |
| 1.71795449463944e-06 | 710465078.193 | 2273711128.899 | 5766712071.789 | 175686043230.952 |
| 1.72131812196654e-06 | 718091619.063 | 2292903281.615 | 5804835665.475 | 173976198442.804 |
| 1.72468833502616e-06 | 725771022.498 | 2312175336.152 | 5843024754.224 | 172282994528.033 |
| 1.72806514671268e-06 | 733503294.185 | 2331526752.612 | 5881277694.099 | 170606269531.198 |
| 1.73144856994573e-06 | 741288435.219 | 2350956981.851 | 5919592830.829 | 168945863073.072 |
| 1.73483861767022e-06 | 749126442.076 | 2370465465.5 | 5957968499.968 | 167301616335.299 |
| 1.73823530285641e-06 | 757017306.586 | 2390051635.996 | 5996403027.041 | 165673372045.207 |
| 1.74163863849996e-06 | 764961015.902 | 2409714916.605 | 6034894727.705 | 164060974460.761 |
| 1.74504863762198e-06 | 772957552.477 | 2429454721.452 | 6073441907.899 | 162464269355.67 |
| 1.74846531326905e-06 | 781006894.035 | 2449270455.552 | 6112042864.006 | 160883104004.63 |
| 1.75188867851332e-06 | 789109013.548 | 2469161514.839 | 6150695883.01 | 159317327168.721 |
| 1.75531874645252e-06 | 797263879.208 | 2489127286.199 | 6189399242.657 | 157766789080.94 |
| 1.75875553021004e-06 | 805471454.403 | 2509167147.508 | 6228151211.616 | 156231341431.873 |
| 1.76219904293494e-06 | 813731697.694 | 2529280467.66 | 6266950049.642 | 154710837355.51 |
| 1.76564929780205e-06 | 822044562.791 | 2549466606.612 | 6305794007.744 | 153205131415.201 |
| 1.76910630801197e-06 | 830409998.532 | 2569724915.414 | 6344681328.343 | 151714079589.738 |
| 1.77257008679117e-06 | 838827948.856 | 2590054736.256 | 6383610245.447 | 150237539259.587 |
| 1.776040647392e-06 | 847298352.789 | 2610455402.504 | 6422578984.816 | 148775369193.24 |
| 1.77951800309277e-06 | 855821144.415 | 2630926238.742 | 6461585764.131 | 147327429533.711 |
| 1.78300216719778e-06 | 864396252.862 | 2651466560.818 | 6500628793.164 | 145893581785.154 |
| 1.78649315303738e-06 | 873023602.28 | 2672075675.887 | 6539706273.954 | 144473688799.622 |
| 1.78999097396801e-06 | 881703111.822 | 2692752882.459 | 6578816400.976 | 143067614763.941 |
| 1.79349564337228e-06 | 890434695.626 | 2713497470.444 | 6617957361.315 | 141675225186.726 |
| 1.79700717465899e-06 | 899218262.796 | 2734308721.2 | 6657127334.844 | 140296386885.514 |
| 1.80052558126319e-06 | 908053717.388 | 2755185907.588 | 6696324494.4 | 138930967974.025 |
| 1.80405087664626e-06 | 916940958.392 | 2776128294.019 | 6735547005.959 | 137578837849.548 |
| 1.8075830742959e-06 | 925879879.717 | 2797135136.506 | 6774793028.816 | 136239867180.447 |
| 1.81112218772624e-06 | 934870370.173 | 2818205682.722 | 6814060715.763 | 134913927893.795 |
| 1.81466823047787e-06 | 943912313.463 | 2839339172.05 | 6853348213.271 | 133600893163.116 |
| 1.81822121611788e-06 | 953005588.163 | 2860534835.646 | 6892653661.672 | 132300637396.261 |
| 1.82178115823993e-06 | 962150067.714 | 2881791896.488 | 6931975195.336 | 131013036223.393 |
| 1.8253480704643e-06 | 971345620.406 | 2903109569.445 | 6971310942.86 | 129737966485.09 |
| 1.82892196643793e-06 | 980592109.371 | 2924487061.327 | 7010659027.248 | 128475306220.565 |
| 1.83250285983449e-06 | 989889392.569 | 2945923570.955 | 7050017566.097 | 127224934655.999 |
| 1.8360907643544e-06 | 999237322.776 | 2967418289.219 | 7089384671.78 | 125986732192.995 |
| 1.83968569372492e-06 | 1008635747.582 | 2988970399.141 | 7128758451.638 | 124760580397.13 |
| 1.8432876617002e-06 | 1018084509.375 | 3010579075.945 | 7168137008.158 | 123546361986.633 |
| 1.8468966820613e-06 | 1027583445.337 | 3032243487.116 | 7207518439.168 | 122343960821.164 |
| 1.85051276861626e-06 | 1037132387.438 | 3053962792.477 | 7246900838.02 | 121153261890.707 |
| 1.85413593520017e-06 | 1046731162.423 | 3075736144.247 | 7286282293.783 | 119974151304.565 |
| 1.8577661956752e-06 | 1056379591.817 | 3097562687.118 | 7325660891.429 | 118806516280.473 |
| 1.86140356393066e-06 | 1066077491.909 | 3119441558.324 | 7365034712.022 | 117650245133.805 |
| 1.86504805388305e-06 | 1075824673.757 | 3141371887.714 | 7404401832.912 | 116505227266.894 |
| 1.86869967947614e-06 | 1085620943.179 | 3163352797.82 | 7443760327.924 | 115371353158.451 |
| 1.87235845468097e-06 | 1095466100.752 | 3185383403.941 | 7483108267.548 | 114248514353.093 |
| 1.87602439349596e-06 | 1105359941.81 | 3207462814.207 | 7522443719.133 | 113136603450.964 |
| 1.87969750994692e-06 | 1115302256.444 | 3229590129.665 | 7561764747.078 | 112035514097.468 |
| 1.88337781808713e-06 | 1125292829.499 | 3251764444.351 | 7601069413.022 | 110945140973.092 |
| 1.88706533199738e-06 | 1135331440.578 | 3273984845.373 | 7640355776.043 | 109865379783.333 |
| 1.89076006578603e-06 | 1145417864.04 | 3296250412.986 | 7679621892.845 | 108796127248.722 |
| 1.89446203358908e-06 | 1155551869.003 | 3318560220.674 | 7718865817.955 | 107737281094.947 |
| 1.89817124957018e-06 | 1165733219.347 | 3340913335.235 | 7758085603.914 | 106688740043.071 |
| 1.90188772792073e-06 | 1175961673.716 | 3363308816.861 | 7797279301.474 | 105650403799.838 |
| 1.90561148285991e-06 | 1186236985.526 | 3385745719.223 | 7836444959.788 | 104622173048.091 |
| 1.90934252863474e-06 | 1196558902.963 | 3408223089.553 | 7875580626.611 | 103603949437.261 |
| 1.91308087952013e-06 | 1206927168.996 | 3430739968.734 | 7914684348.486 | 102595635573.968 |
| 1.91682654981895e-06 | 1217341521.381 | 3453295391.385 | 7953754170.943 | 101597135012.701 |
| 1.92057955386207e-06 | 1227801692.664 | 3475888385.947 | 7992788138.693 | 100608352246.594 |
| 1.92433990600841e-06 | 1238307410.196 | 3498517974.774 | 8031784295.825 | 99629192698.292 |
| 1.92810762064501e-06 | 1248858396.136 | 3521183174.221 | 8070740685.995 | 98659562710.903 |
| 1.93188271218708e-06 | 1259454367.465 | 3543882994.737 | 8109655352.624 | 97699369539.038 |
| 1.93566519507806e-06 | 1270095035.993 | 3566616440.952 | 8148526339.092 | 96748521339.947 |
| 1.93945508378966e-06 | 1280780108.372 | 3589382511.775 | 8187351688.933 | 95806927164.724 |
| 1.94325239282192e-06 | 1291509286.106 | 3612180200.48 | 8226129446.028 | 94874496949.618 |
| 1.94705713670328e-06 | 1302282265.565 | 3635008494.808 | 8264857654.799 | 93951141507.408 |
| 1.95086932999062e-06 | 1313098738 | 3657866377.055 | 8303534360.406 | 93036772518.884 |
| 1.95468898726934e-06 | 1323958389.554 | 3680752824.172 | 8342157608.936 | 92131302524.387 |
| 1.95851612315336e-06 | 1334860901.276 | 3703666807.857 | 8380725447.598 | 91234644915.452 |
| 1.96235075228524e-06 | 1345805949.144 | 3726607294.658 | 8419235924.92 | 90346713926.522 |
| 1.96619288933621e-06 | 1356793204.071 | 3749573246.068 | 8457687090.937 | 89467424626.743 |
| 1.97004254900621e-06 | 1367822331.932 | 3772563618.62 | 8496076997.385 | 88596692911.839 |
| 1.97389974602397e-06 | 1378892993.573 | 3795577363.995 | 8534403697.895 | 87734435496.074 |
| 1.97776449514706e-06 | 1390004844.839 | 3818613429.114 | 8572665248.185 | 86880569904.275 |
| 1.98163681116194e-06 | 1401157536.584 | 3841670756.244 | 8610859706.246 | 86035014463.956 |
| 1.98551670888403e-06 | 1412350714.7 | 3864748283.096 | 8648985132.541 | 85197688297.494 |
| 1.98940420315774e-06 | 1423584020.131 | 3887844942.931 | 8687039590.19 | 84368511314.401 |
| 1.99329930885656e-06 | 1434857088.898 | 3910959664.661 | 8725021145.162 | 83547404203.661 |
| 1.99720204088309e-06 | 1446169552.123 | 3934091372.952 | 8762927866.464 | 82734288426.142 |
| 2.00111241416911e-06 | 1457521036.047 | 3957238988.328 | 8800757826.332 | 81929086207.087 |
| 2.00503044367565e-06 | 1468911162.061 | 3980401427.277 | 8838509100.415 | 81131720528.672 |
| 2.00895614439301e-06 | 1480339546.723 | 4003577602.358 | 8876179767.969 | 80342115122.64 |
| 2.01288953134086e-06 | 1491805801.79 | 4026766422.303 | 8913767912.036 | 79560194463.008 |
| 2.01683061956826e-06 | 1503309534.24 | 4049966792.125 | 8951271619.639 | 78785883758.84 |
| 2.02077942415376e-06 | 1514850346.302 | 4073177613.227 | 8988688981.963 | 78019108947.095 |
| 2.02473596020539e-06 | 1526427835.479 | 4096397783.507 | 9026018094.541 | 77259796685.541 |
| 2.02870024286081e-06 | 1538041594.583 | 4119626197.467 | 9063257057.437 | 76507874345.743 |
| 2.03267228728729e-06 | 1549691211.758 | 4142861746.324 | 9100403975.434 | 75763270006.112 |
| 2.03665210868179e-06 | 1561376270.511 | 4166103318.114 | 9137456958.212 | 75025912445.029 |
| 2.04063972227104e-06 | 1573096349.746 | 4189349797.804 | 9174414120.532 | 74295731134.033 |
| 2.04463514331159e-06 | 1584851023.791 | 4212600067.405 | 9211273582.416 | 73572656231.07 |
| 2.04863838708984e-06 | 1596639862.432 | 4235853006.076 | 9248033469.33 | 72856618573.818 |
| 2.05264946892213e-06 | 1608462430.946 | 4259107490.241 | 9284691912.361 | 72147549673.07 |
| 2.05666840415479e-06 | 1620318290.131 | 4282362393.695 | 9321247048.396 | 71445381706.182 |
| 2.06069520816419e-06 | 1632206996.344 | 4305616587.718 | 9357697020.298 | 70750047510.585 |
| 2.06472989635682e-06 | 1644128101.534 | 4328868941.189 | 9394039977.088 | 70061480577.364 |
| 2.06877248416932e-06 | 1656081153.276 | 4352118320.692 | 9430274074.112 | 69379615044.894 |
| 2.07282298706855e-06 | 1668065694.809 | 4375363590.633 | 9466397473.223 | 68704385692.542 |
| 2.07688142055168e-06 | 1680081265.072 | 4398603613.354 | 9502408342.951 | 68035727934.424 |
| 2.08094780014619e-06 | 1692127398.738 | 4421837249.24 | 9538304858.675 | 67373577813.236 |
| 2.08502214140998e-06 | 1704203626.26 | 4445063356.838 | 9574085202.796 | 66717871994.126 |
| 2.08910445993141e-06 | 1716309473.899 | 4468280792.97 | 9609747564.906 | 66068547758.646 |
| 2.09319477132936e-06 | 1728444463.774 | 4491488412.841 | 9645290141.96 | 65425542998.745 |
| 2.09729309125328e-06 | 1740608113.891 | 4514685070.161 | 9680711138.437 | 64788796210.834 |
| 2.10139943538328e-06 | 1752799938.194 | 4537869617.252 | 9716008766.515 | 64158246489.899 |
| 2.10551381943015e-06 | 1765019446.598 | 4561040905.166 | 9751181246.231 | 63533833523.678 |
| 2.10963625913546e-06 | 1777266145.035 | 4584197783.801 | 9786226805.648 | 62915497586.891 |
| 2.11376677027158e-06 | 1789539535.494 | 4607339102.009 | 9821143681.016 | 62303179535.529 |
| 2.11790536864178e-06 | 1801839116.068 | 4630463707.718 | 9855930116.935 | 61696820801.194 |
| 2.12205207008026e-06 | 1814164380.99 | 4653570448.041 | 9890584366.515 | 61096363385.498 |
| 2.12620689045222e-06 | 1826514820.686 | 4676658169.396 | 9925104691.539 | 60501749854.518 |
| 2.13036984565394e-06 | 1838889921.813 | 4699725717.616 | 9959489362.612 | 59912923333.298 |
| 2.13454095161282e-06 | 1851289167.308 | 4722771938.065 | 9993736659.327 | 59329827500.412 |
| 2.13872022428741e-06 | 1863712036.43 | 4745795675.757 | 10027844870.415 | 58752406582.577 |
| 2.14290767966756e-06 | 1876158004.813 | 4768795775.463 | 10061812293.899 | 58180605349.315 |
| 2.14710333377438e-06 | 1888626544.505 | 4791771081.835 | 10095637237.25 | 57614369107.674 |
| 2.15130720266038e-06 | 1901117124.02 | 4814720439.512 | 10129318017.532 | 57053643696.995 |
| 2.15551930240948e-06 | 1913629208.389 | 4837642693.243 | 10162852961.556 | 56498375483.732 |
| 2.15973964913711e-06 | 1926162259.199 | 4860536687.996 | 10196240406.029 | 55948511356.32 |
| 2.16396825899023e-06 | 1938715734.653 | 4883401269.072 | 10229478697.695 | 55403998720.097 |
| 2.16820514814743e-06 | 1951289089.613 | 4906235282.226 | 10262566193.486 | 54864785492.273 |
| 2.17245033281898e-06 | 1963881775.65 | 4929037573.774 | 10295501260.661 | 54330820096.948 |
| 2.17670382924687e-06 | 1976493241.099 | 4951806990.712 | 10328282276.954 | 53802051460.18 |
| 2.1809656537049e-06 | 1989122931.105 | 4974542380.828 | 10360907630.706 | 53278429005.094 |
| 2.18523582249875e-06 | 2001770287.679 | 4997242592.817 | 10393375721.012 | 52759902647.053 |
| 2.18951435196599e-06 | 2014434749.747 | 5019906476.392 | 10425684957.854 | 52246422788.863 |
| 2.19380125847622e-06 | 2027115753.204 | 5042532882.402 | 10457833762.237 | 51737940316.027 |
| 2.19809655843105e-06 | 2039812730.965 | 5065120662.941 | 10489820566.326 | 51234406592.05 |
| 2.20240026826422e-06 | 2052525113.022 | 5087668671.465 | 10521643813.574 | 50735773453.786 |
| 2.20671240444166e-06 | 2065252326.494 | 5110175762.901 | 10553301958.858 | 50241993206.834 |
| 2.21103298346153e-06 | 2077993795.685 | 5132640793.762 | 10584793468.605 | 49753018620.971 |
| 2.21536202185427e-06 | 2090748942.135 | 5155062622.256 | 10616116820.92 | 49268802925.636 |
| 2.21969953618271e-06 | 2103517184.677 | 5177440108.404 | 10647270505.713 | 48789299805.459 |
| 2.22404554304212e-06 | 2116297939.493 | 5199772114.144 | 10678253024.823 | 48314463395.83 |
| 2.22840005906022e-06 | 2129090620.169 | 5222057503.45 | 10709062892.139 | 47844248278.509 |
| 2.23276310089732e-06 | 2141894637.752 | 5244295142.434 | 10739698633.724 | 47378609477.285 |
| 2.23713468524635e-06 | 2154709400.806 | 5266483899.465 | 10770158787.932 | 46917502453.672 |
| 2.2415148288329e-06 | 2167534315.469 | 5288622645.273 | 10800441905.524 | 46460883102.653 |
| 2.24590354841533e-06 | 2180368785.51 | 5310710253.063 | 10830546549.788 | 46008707748.454 |
| 2.2503008607848e-06 | 2193212212.39 | 5332745598.621 | 10860471296.648 | 45560933140.372 |
| 2.25470678276536e-06 | 2206063995.314 | 5354727560.424 | 10890214734.781 | 45117516448.638 |
| 2.25912133121397e-06 | 2218923531.295 | 5376655019.75 | 10919775465.723 | 44678415260.319 |
| 2.26354452302062e-06 | 2231790215.211 | 5398526860.78 | 10949152103.98 | 44243587575.258 |
| 2.26797637510837e-06 | 2244663439.864 | 5420341970.716 | 10978343277.133 | 43812991802.064 |
| 2.2724169044334e-06 | 2257542596.035 | 5442099239.875 | 11007347625.948 | 43386586754.126 |
| 2.2768661279851e-06 | 2270427072.554 | 5463797561.807 | 11036163804.472 | 42964331645.679 |
| 2.28132406278613e-06 | 2283316256.348 | 5485435833.393 | 11064790480.139 | 42546186087.901 |
| 2.28579072589245e-06 | 2296209532.51 | 5507012954.955 | 11093226333.868 | 42132110085.048 |
| 2.29026613439344e-06 | 2309106284.354 | 5528527830.356 | 11121470060.161 | 41722064030.634 |
| 2.29475030541194e-06 | 2322005893.481 | 5549979367.109 | 11149520367.2 | 41316008703.633 |
| 2.29924325610431e-06 | 2334907739.833 | 5571366476.478 | 11177375976.94 | 40913905264.738 |
| 2.30374500366048e-06 | 2347811201.762 | 5592688073.582 | 11205035625.198 | 40515715252.64 |
| 2.30825556530408e-06 | 2360715656.083 | 5613943077.496 | 11232498061.749 | 40121400580.348 |
| 2.31277495829243e-06 | 2373620478.143 | 5635130411.353 | 11259762050.413 | 39730923531.552 |
| 2.31730319991664e-06 | 2386525041.88 | 5656249002.449 | 11286826369.137 | 39344246757.009 |
| 2.3218403075017e-06 | 2399428719.883 | 5677297782.335 | 11313689810.084 | 38961333270.975 |
| 2.32638629840648e-06 | 2412330883.456 | 5698275686.925 | 11340351179.717 | 38582146447.665 |
| 2.33094119002387e-06 | 2425230902.683 | 5719181656.591 | 11366809298.874 | 38206650017.75 |
| 2.33550499978081e-06 | 2438128146.484 | 5740014636.262 | 11393063002.852 | 37834808064.889 |
| 2.34007774513835e-06 | 2451021982.684 | 5760773575.523 | 11419111141.485 | 37466585022.292 |
| 2.34465944359174e-06 | 2463911778.074 | 5781457428.709 | 11444952579.214 | 37101945669.319 |
| 2.34925011267046e-06 | 2476796898.47 | 5802065155.004 | 11470586195.163 | 36740855128.112 |
| 2.35384976993834e-06 | 2489676708.783 | 5822595718.535 | 11496010883.212 | 36383278860.256 |
| 2.35845843299359e-06 | 2502550573.075 | 5843048088.466 | 11521225552.064 | 36029182663.478 |
| 2.36307611946886e-06 | 2515417854.629 | 5863421239.096 | 11546229125.316 | 35678532668.376 |
| 2.36770284703135e-06 | 2528277916.006 | 5883714149.946 | 11571020541.518 | 35331295335.178 |
| 2.37233863338283e-06 | 2541130119.115 | 5903925805.856 | 11595598754.243 | 34987437450.531 |
| 2.37698349625974e-06 | 2553973825.27 | 5924055197.073 | 11619962732.148 | 34646926124.33 |
| 2.38163745343323e-06 | 2566808395.259 | 5944101319.347 | 11644111459.031 | 34309728786.57 |
| 2.38630052270928e-06 | 2579633189.403 | 5964063174.014 | 11668043933.891 | 33975813184.229 |
| 2.3909727219287e-06 | 2592447567.624 | 5983939768.09 | 11691759170.984 | 33645147378.182 |
| 2.39565406896723e-06 | 2605250889.506 | 6003730114.358 | 11715256199.876 | 33317699740.151 |
| 2.40034458173563e-06 | 2618042514.359 | 6023433231.454 | 11738534065.496 | 32993438949.674 |
| 2.40504427817972e-06 | 2630821801.285 | 6043048143.956 | 11761591828.188 | 32672333991.114 |
| 2.40975317628046e-06 | 2643588109.236 | 6062573882.466 | 11784428563.756 | 32354354150.69 |
| 2.414471294054e-06 | 2656340797.087 | 6082009483.698 | 11807043363.513 | 32039469013.538 |
| 2.41919864955177e-06 | 2669079223.689 | 6101353990.559 | 11829435334.323 | 31727648460.805 |
| 2.42393526086057e-06 | 2681802747.942 | 6120606452.235 | 11851603598.649 | 31418862666.764 |
| 2.42868114610257e-06 | 2694510728.854 | 6139765924.271 | 11873547294.586 | 31113082095.967 |
| 2.43343632343545e-06 | 2707202525.603 | 6158831468.65 | 11895265575.908 | 30810277500.413 |
| 2.43820081105243e-06 | 2719877497.606 | 6177802153.877 | 11916757612.097 | 30510419916.756 |
| 2.44297462718236e-06 | 2732535004.577 | 6196677055.057 | 11938022588.386 | 30213480663.532 |
| 2.44775779008978e-06 | 2745174406.595 | 6215455253.971 | 11959059705.784 | 29919431338.416 |
| 2.45255031807498e-06 | 2757795064.163 | 6234135839.156 | 11979868181.115 | 29628243815.506 |
| 2.45735222947408e-06 | 2770396338.274 | 6252717905.978 | 12000447247.041 | 29339890242.63 |
| 2.46216354265912e-06 | 2782977590.474 | 6271200556.71 | 12020796152.094 | 29054343038.689 |
| 2.4669842760381e-06 | 2795538182.925 | 6289582900.607 | 12040914160.699 | 28771574891.008 |
| 2.47181444805504e-06 | 2808077478.465 | 6307864053.976 | 12060800553.198 | 28491558752.734 |
| 2.47665407719011e-06 | 2820594840.675 | 6326043140.25 | 12080454625.873 | 28214267840.242 |
| 2.48150318195964e-06 | 2833089633.941 | 6344119290.06 | 12099875690.966 | 27939675630.577 |
| 2.48636178091622e-06 | 2845561223.511 | 6362091641.302 | 12119063076.695 | 27667755858.916 |
| 2.49122989264877e-06 | 2858008975.565 | 6379959339.212 | 12138016127.274 | 27398482516.053 |
| 2.49610753578258e-06 | 2870432257.273 | 6397721536.429 | 12156734202.921 | 27131829845.916 |
| 2.50099472897945e-06 | 2882830436.857 | 6415377393.062 | 12175216679.88 | 26867772343.102 |
| 2.50589149093767e-06 | 2895202883.652 | 6432926076.761 | 12193462950.423 | 26606284750.433 |
| 2.51079784039218e-06 | 2907548968.172 | 6450366762.778 | 12211472422.863 | 26347342056.546 |
| 2.51571379611459e-06 | 2919868062.165 | 6467698634.03 | 12229244521.563 | 26090919493.499 |
| 2.52063937691324e-06 | 2932159538.678 | 6484920881.168 | 12246778686.935 | 25836992534.399 |
| 2.52557460163333e-06 | 2944422772.12 | 6502032702.63 | 12264074375.45 | 25585536891.059 |
| 2.53051948915694e-06 | 2956657138.315 | 6519033304.709 | 12281131059.637 | 25336528511.676 |
| 2.53547405840312e-06 | 2968862014.572 | 6535921901.61 | 12297948228.082 | 25089943578.527 |
| 2.54043832832796e-06 | 2981036779.738 | 6552697715.509 | 12314525385.429 | 24845758505.69 |
| 2.54541231792467e-06 | 2993180814.261 | 6569359976.61 | 12330862052.372 | 24603949936.795 |
| 2.55039604622365e-06 | 3005293500.249 | 6585907923.201 | 12346957765.654 | 24364494742.782 |
| 2.55538953229255e-06 | 3017374221.529 | 6602340801.712 | 12362812078.058 | 24127370019.692 |
| 2.56039279523637e-06 | 3029422363.708 | 6618657866.766 | 12378424558.398 | 23892553086.479 |
| 2.5654058541975e-06 | 3041437314.228 | 6634858381.234 | 12393794791.507 | 23660021482.834 |
| 2.57042872835579e-06 | 3053418462.429 | 6650941616.287 | 12408922378.23 | 23429752967.044 |
| 2.57546143692871e-06 | 3065365199.604 | 6666906851.445 | 12423806935.402 | 23201725513.858 |
| 2.58050399917128e-06 | 3077276919.058 | 6682753374.632 | 12438448095.839 | 22975917312.385 |
| 2.58555643437627e-06 | 3089153016.166 | 6698480482.216 | 12452845508.318 | 22752306764.005 |
| 2.59061876187421e-06 | 3100992888.429 | 6714087479.067 | 12466998837.556 | 22530872480.306 |
| 2.59569100103346e-06 | 3112795935.531 | 6729573678.595 | 12480907764.195 | 22311593281.034 |
| 2.60077317126032e-06 | 3124561559.398 | 6744938402.8 | 12494571984.772 | 22094448192.072 |
| 2.6058652919991e-06 | 3136289164.25 | 6760180982.314 | 12507991211.701 | 21879416443.428 |
| 2.61096738273214e-06 | 3147978156.66 | 6775300756.445 | 12521165173.243 | 21666477467.255 |
| 2.61607946297997e-06 | 3159627945.608 | 6790297073.22 | 12534093613.483 | 21455610895.878 |
| 2.6212015523013e-06 | 3171237942.538 | 6805169289.424 | 12546776292.297 | 21246796559.849 |
| 2.62633367029317e-06 | 3182807561.41 | 6819916770.642 | 12559212985.324 | 21040014486.016 |
| 2.63147583659095e-06 | 3194336218.754 | 6834538891.293 | 12571403483.933 | 20835244895.616 |
| 2.6366280708685e-06 | 3205823333.728 | 6849035034.674 | 12583347595.189 | 20632468202.377 |
| 2.64179039283816e-06 | 3217268328.167 | 6863404592.993 | 12595045141.819 | 20431665010.652 |
| 2.64696282225089e-06 | 3228670626.639 | 6877646967.401 | 12606495962.173 | 20232816113.555 |
| 2.65214537889631e-06 | 3240029656.495 | 6891761568.032 | 12617699910.188 | 20035902491.135 |
| 2.65733808260279e-06 | 3251344847.924 | 6905747814.034 | 12628656855.346 | 19840905308.546 |
| 2.66254095323753e-06 | 3262615634.002 | 6919605133.597 | 12639366682.637 | 19647805914.251 |
| 2.66775401070661e-06 | 3273841450.746 | 6933332963.99 | 12649829292.508 | 19456585838.238 |
| 2.67297727495509e-06 | 3285021737.164 | 6946930751.585 | 12660044600.828 | 19267226790.252 |
| 2.67821076596711e-06 | 3296155935.303 | 6960397951.889 | 12670012538.834 | 19079710658.045 |
| 2.68345450376589e-06 | 3307243490.303 | 6973734029.57 | 12679733053.092 | 18894019505.646 |
| 2.68870850841388e-06 | 3318283850.444 | 6986938458.483 | 12689206105.44 | 18710135571.642 |
| 2.69397280001282e-06 | 3329276467.195 | 7000010721.694 | 12698431672.943 | 18528041267.482 |
| 2.69924739870379e-06 | 3340220795.264 | 7012950311.508 | 12707409747.84 | 18347719175.794 |
| 2.70453232466731e-06 | 3351116292.643 | 7025756729.487 | 12716140337.492 | 18169152048.718 |
| 2.70982759812342e-06 | 3361962420.661 | 7038429486.473 | 12724623464.326 | 17992322806.256 |
| 2.71513323933173e-06 | 3372758644.027 | 7050968102.61 | 12732859165.782 | 17817214534.642 |
| 2.72044926859154e-06 | 3383504430.874 | 7063372107.364 | 12740847494.252 | 17643810484.718 |
| 2.72577570624187e-06 | 3394199252.814 | 7075641039.537 | 12748588517.024 | 17472094070.337 |
| 2.73111257266159e-06 | 3404842584.975 | 7087774447.29 | 12756082316.225 | 17302048866.775 |
| 2.73645988826944e-06 | 3415433906.048 | 7099771888.153 | 12763328988.755 | 17133658609.159 |
| 2.74181767352418e-06 | 3425972698.336 | 7111632929.045 | 12770328646.226 | 16966907190.913 |
| 2.74718594892457e-06 | 3436458447.792 | 7123357146.286 | 12777081414.903 | 16801778662.216 |
| 2.75256473500956e-06 | 3446890644.067 | 7134944125.609 | 12783587435.633 | 16638257228.476 |
| 2.75795405235828e-06 | 3457268780.55 | 7146393462.173 | 12789846863.781 | 16476327248.822 |
| 2.76335392159017e-06 | 3467592354.412 | 7157704760.572 | 12795859869.165 | 16315973234.603 |
| 2.76876436336502e-06 | 3477860866.647 | 7168877634.847 | 12801626635.985 | 16157179847.914 |
| 2.7741853983831e-06 | 3488073822.116 | 7179911708.49 | 12807147362.755 | 15999931900.12 |
| 2.77961704738518e-06 | 3498230729.581 | 7190806614.457 | 12812422262.23 | 15844214350.41 |
| 2.78505933115265e-06 | 3508331101.755 | 7201561995.169 | 12817451561.336 | 15690012304.356 |
| 2.79051227050761e-06 | 3518374455.333 | 7212177502.521 | 12822235501.096 | 15537311012.488 |
| 2.7959758863129e-06 | 3528360311.035 | 7222652797.884 | 12826774336.555 | 15386095868.883 |
| 2.8014501994722e-06 | 3538288193.644 | 7232987552.107 | 12831068336.707 | 15236352409.769 |
| 2.80693523093016e-06 | 3548157632.047 | 7243181445.522 | 12835117784.414 | 15088066312.142 |
| 2.8124310016724e-06 | 3557968159.264 | 7253234167.943 | 12838922976.335 | 14941223392.394 |
| 2.81793753272565e-06 | 3567719312.493 | 7263145418.666 | 12842484222.84 | 14795809604.957 |
| 2.82345484515778e-06 | 3577410633.145 | 7272914906.466 | 12845801847.936 | 14651811040.961 |
| 2.82898296007795e-06 | 3587041666.876 | 7282542349.6 | 12848876189.182 | 14509213926.901 |
| 2.83452189863663e-06 | 3596611963.622 | 7292027475.798 | 12851707597.611 | 14368004623.323 |
| 2.84007168202568e-06 | 3606121077.64 | 7301370022.26 | 12854296437.644 | 14228169623.516 |
| 2.84563233147849e-06 | 3615568567.535 | 7310569735.653 | 12856643087.011 | 14089695552.222 |
| 2.85120386827e-06 | 3624953996.294 | 7319626372.102 | 12858747936.658 | 13952569164.357 |
| 2.85678631371681e-06 | 3634276931.324 | 7328539697.186 | 12860611390.669 | 13816777343.742 |
| 2.86237968917726e-06 | 3643536944.477 | 7337309485.925 | 12862233866.178 | 13682307101.851 |
| 2.8679840160515e-06 | 3652733612.086 | 7345935522.772 | 12863615793.276 | 13549145576.566 |
| 2.8735993157816e-06 | 3661866514.995 | 7354417601.607 | 12864757614.932 | 13417280030.949 |
| 2.87922560985157e-06 | 3670935238.589 | 7362755525.718 | 12865659786.895 | 13286697852.022 |
| 2.88486291978754e-06 | 3679939372.822 | 7370949107.794 | 12866322777.606 | 13157386549.564 |
| 2.89051126715774e-06 | 3688878512.25 | 7378998169.913 | 12866747068.113 | 13029333754.91 |
| 2.89617067357265e-06 | 3697752256.055 | 7386902543.52 | 12866933151.969 | 12902527219.774 |
| 2.90184116068506e-06 | 3706560208.074 | 7394662069.42 | 12866881535.148 | 12776954815.074 |
| 2.90752275019015e-06 | 3715301976.83 | 7402276597.757 | 12866592735.947 | 12652604529.774 |
| 2.91321546382558e-06 | 3723977175.553 | 7409745987.998 | 12866067284.894 | 12529464469.734 |
| 2.91891932337158e-06 | 3732585422.209 | 7417070108.916 | 12865305724.65 | 12407522856.571 |
| 2.924634350651e-06 | 3741126339.524 | 7424248838.569 | 12864308609.916 | 12286768026.534 |
| 2.93036056752945e-06 | 3749599555.011 | 7431282064.28 | 12863076507.337 | 12167188429.39 |
| 2.93609799591532e-06 | 3758004700.992 | 7438169682.619 | 12861609995.401 | 12048772627.316 |
| 2.94184665775992e-06 | 3766341414.62 | 7444911599.376 | 12859909664.345 | 11931509293.806 |
| 2.94760657505752e-06 | 3774609337.906 | 7451507729.545 | 12857976116.055 | 11815387212.59 |
| 2.95337776984546e-06 | 3782808117.737 | 7457957997.292 | 12855809963.965 | 11700395276.555 |
| 2.95916026420423e-06 | 3790937405.903 | 7464262335.941 | 12853411832.96 | 11586522486.691 |
| 2.96495408025756e-06 | 3798996859.109 | 7470420687.936 | 12850782359.275 | 11473757951.032 |
| 2.97075924017248e-06 | 3806986139.005 | 7476433004.827 | 12847922190.391 | 11362090883.619 |
| 2.97657576615943e-06 | 3814904912.2 | 7482299247.233 | 12844831984.937 | 11251510603.464 |
| 2.98240368047233e-06 | 3822752850.283 | 7488019384.821 | 12841512412.585 | 11142006533.531 |
| 2.98824300540868e-06 | 3830529629.838 | 7493593396.273 | 12837964153.947 | 11033568199.726 |
| 2.99409376330963e-06 | 3838234932.469 | 7499021269.257 | 12834187900.476 | 10926185229.889 |
| 2.99995597656008e-06 | 3845868444.809 | 7504303000.399 | 12830184354.354 | 10819847352.81 |
| 3.00582966758876e-06 | 3853429858.543 | 7509438595.248 | 12825954228.396 | 10714544397.239 |
| 3.01171485886829e-06 | 3860918870.42 | 7514428068.246 | 12821498245.94 | 10610266290.919 |
| 3.01761157291533e-06 | 3868335182.269 | 7519271442.694 | 12816817140.741 | 10507003059.618 |
| 3.02351983229058e-06 | 3875678501.016 | 7523968750.719 | 12811911656.869 | 10404744826.18 |
| 3.02943965959895e-06 | 3882948538.694 | 7528520033.241 | 12806782548.6 | 10303481809.575 |
| 3.03537107748959e-06 | 3890145012.46 | 7532925339.933 | 12801430580.307 | 10203204323.965 |
| 3.041314108656e-06 | 3897267644.606 | 7537184729.189 | 12795856526.358 | 10103902777.781 |
| 3.04726877583611e-06 | 3904316162.573 | 7541298268.086 | 12790061171.006 | 10005567672.802 |
| 3.05323510181237e-06 | 3911290298.957 | 7545266032.346 | 12784045308.279 | 9908189603.246 |
| 3.05921310941184e-06 | 3918189791.528 | 7549088106.299 | 12777809741.874 | 9811759254.872 |
| 3.06520282150627e-06 | 3925014383.235 | 7552764582.84 | 12771355285.046 | 9716267404.091 |
| 3.0712042610122e-06 | 3931763822.217 | 7556295563.394 | 12764682760.504 | 9621704917.08 |
| 3.07721745089101e-06 | 3938437861.81 | 7559681157.873 | 12757793000.294 | 9528062748.909 |
| 3.08324241414907e-06 | 3945036260.562 | 7562921484.636 | 12750686845.697 | 9435331942.677 |
| 3.08927917383779e-06 | 3951558782.231 | 7566016670.444 | 12743365147.112 | 9343503628.658 |
| 3.09532775305369e-06 | 3958005195.801 | 7568966850.422 | 12735828763.952 | 9252569023.446 |
| 3.10138817493854e-06 | 3964375275.483 | 7571772168.012 | 12728078564.528 | 9162519429.12 |
| 3.1074604626794e-06 | 3970668800.726 | 7574432774.93 | 12720115425.944 | 9073346232.41 |
| 3.11354463950873e-06 | 3976885556.215 | 7576948831.122 | 12711940233.98 | 8985040903.875 |
| 3.11964072870449e-06 | 3983025331.884 | 7579320504.72 | 12703553882.985 | 8897594997.084 |
| 3.12574875359021e-06 | 3989087922.914 | 7581547971.992 | 12694957275.764 | 8811000147.812 |
| 3.13186873753507e-06 | 3995073129.741 | 7583631417.299 | 12686151323.465 | 8725248073.236 |
| 3.13800070395404e-06 | 4000980758.056 | 7585571033.046 | 12677136945.473 | 8640330571.145 |
| 3.14414467630791e-06 | 4006810618.807 | 7587367019.638 | 12667915069.29 | 8556239519.157 |
| 3.15030067810339e-06 | 4012562528.204 | 7589019585.426 | 12658486630.428 | 8472966873.938 |
| 3.15646873289326e-06 | 4018236307.717 | 7590528946.659 | 12648852572.297 | 8390504670.435 |
| 3.16264886427637e-06 | 4023831784.08 | 7591895327.441 | 12639013846.091 | 8308845021.115 |
| 3.1688410958978e-06 | 4029348789.285 | 7593118959.672 | 12628971410.675 | 8227980115.209 |
| 3.17504545144892e-06 | 4034787160.59 | 7594200083.004 | 12618726232.476 | 8147902217.965 |
| 3.18126195466747e-06 | 4040146740.509 | 7595138944.784 | 12608279285.365 | 8068603669.91 |
| 3.1874906293377e-06 | 4045427376.818 | 7595935800.009 | 12597631550.551 | 7990076886.115 |
| 3.1937314992904e-06 | 4050628922.548 | 7596590911.267 | 12586784016.462 | 7912314355.47 |
| 3.19998458840302e-06 | 4055751235.981 | 7597104548.691 | 12575737678.639 | 7835308639.967 |
| 3.20624992059978e-06 | 4060794180.653 | 7597476989.898 | 12564493539.616 | 7759052373.987 |
| 3.21252751985172e-06 | 4065757625.343 | 7597708519.941 | 12553052608.814 | 7683538263.596 |
| 3.21881741017684e-06 | 4070641444.073 | 7597799431.253 | 12541415902.423 | 7608759085.849 |
| 3.22511961564012e-06 | 4075445516.099 | 7597750023.592 | 12529584443.295 | 7534707688.094 |
| 3.23143416035372e-06 | 4080169725.911 | 7597560603.986 | 12517559260.827 | 7461376987.295 |
| 3.23776106847694e-06 | 4084813963.221 | 7597231486.677 | 12505341390.848 | 7388759969.35 |
| 3.24410036421645e-06 | 4089378122.959 | 7596762993.063 | 12492931875.513 | 7316849688.418 |
| 3.25045207182626e-06 | 4093862105.266 | 7596155451.647 | 12480331763.182 | 7245639266.262 |
| 3.2568162156079e-06 | 4098265815.485 | 7595409197.973 | 12467542108.314 | 7175121891.584 |
| 3.26319281991048e-06 | 4102589164.152 | 7594524574.573 | 12454563971.353 | 7105290819.377 |
| 3.26958190913075e-06 | 4106832066.991 | 7593501930.909 | 12441398418.617 | 7036139370.278 |
| 3.27598350771328e-06 | 4110994444.899 | 7592341623.312 | 12428046522.181 | 6967660929.933 |
| 3.28239764015045e-06 | 4115076223.94 | 7591044014.926 | 12414509359.775 | 6899848948.357 |
| 3.28882433098263e-06 | 4119077335.333 | 7589609475.647 | 12400788014.663 | 6832696939.317 |
| 3.29526360479822e-06 | 4122997715.442 | 7588038382.065 | 12386883575.536 | 6766198479.702 |
| 3.30171548623377e-06 | 4126837305.763 | 7586331117.404 | 12372797136.401 | 6700347208.916 |
| 3.30817999997405e-06 | 4130596052.914 | 7584488071.462 | 12358529796.47 | 6635136828.266 |
| 3.3146571707522e-06 | 4134273908.618 | 7582509640.55 | 12344082660.048 | 6570561100.361 |
| 3.32114702334974e-06 | 4137870829.698 | 7580396227.429 | 12329456836.422 | 6506613848.513 |
| 3.32764958259673e-06 | 4141386778.055 | 7578148241.255 | 12314653439.752 | 6443288956.149 |
| 3.33416487337186e-06 | 4144821720.659 | 7575766097.511 | 12299673588.962 | 6380580366.226 |
| 3.34069292060251e-06 | 4148175629.533 | 7573250217.949 | 12284518407.627 | 6318482080.649 |
| 3.34723374926487e-06 | 4151448481.739 | 7570601030.528 | 12269189023.867 | 6256988159.698 |
| 3.35378738438404e-06 | 4154640259.361 | 7567818969.348 | 12253686570.234 | 6196092721.463 |
| 3.3603538510341e-06 | 4157750949.491 | 7564904474.593 | 12238012183.605 | 6135789941.277 |
| 3.36693317433825e-06 | 4160780544.209 | 7561857992.463 | 12222167005.075 | 6076074051.162 |
| 3.37352537946885e-06 | 4163729040.572 | 7558679975.116 | 12206152179.846 | 6016939339.276 |
| 3.38013049164757e-06 | 4166596440.59 | 7555370880.598 | 12189968857.118 | 5958380149.368 |
| 3.38674853614545e-06 | 4169382751.215 | 7551931172.786 | 12173618189.986 | 5900390880.233 |
| 3.393379538283e-06 | 4172087984.317 | 7548361321.32 | 12157101335.327 | 5842965985.181 |
| 3.40002352343033e-06 | 4174712156.668 | 7544661801.542 | 12140419453.697 | 5786099971.505 |
| 3.4066805170072e-06 | 4177255289.924 | 7540833094.427 | 12123573709.221 | 5729787399.954 |
| 3.41335054448315e-06 | 4179717410.602 | 7536875686.526 | 12106565269.492 | 5674022884.214 |
| 3.4200336313776e-06 | 4182098550.064 | 7532790069.894 | 12089395305.457 | 5618801090.393 |
| 3.4267298032599e-06 | 4184398744.495 | 7528576742.028 | 12072064991.32 | 5564116736.512 |
| 3.4334390857495e-06 | 4186618034.88 | 7524236205.804 | 12054575504.431 | 5509964591.996 |
| 3.44016150451599e-06 | 4188756466.987 | 7519768969.41 | 12036928025.183 | 5456339477.176 |
| 3.44689708527923e-06 | 4190814091.342 | 7515175546.28 | 12019123736.908 | 5403236262.795 |
| 3.45364585380942e-06 | 4192790963.209 | 7510456455.03 | 12001163825.772 | 5350649869.515 |
| 3.46040783592724e-06 | 4194687142.565 | 7505612219.391 | 11983049480.675 | 5298575267.433 |
| 3.46718305750391e-06 | 4196502694.081 | 7500643368.146 | 11964781893.142 | 5247007475.599 |
| 3.4739715444613e-06 | 4198237687.097 | 7495550435.061 | 11946362257.226 | 5195941561.537 |
| 3.48077332277205e-06 | 4199892195.596 | 7490333958.822 | 11927791769.403 | 5145372640.778 |
| 3.48758841845965e-06 | 4201466298.183 | 7484994482.964 | 11909071628.471 | 5095295876.391 |
| 3.49441685759851e-06 | 4202960078.063 | 7479532555.814 | 11890203035.448 | 5045706478.519 |
| 3.50125866631414e-06 | 4204373623.008 | 7473948730.413 | 11871187193.474 | 4996599703.922 |
| 3.50811387078317e-06 | 4205707025.342 | 7468243564.462 | 11852025307.706 | 4947970855.523 |
| 3.51498249723349e-06 | 4206960381.909 | 7462417620.246 | 11832718585.225 | 4899815281.957 |
| 3.52186457194434e-06 | 4208133794.047 | 7456471464.572 | 11813268234.931 | 4852128377.132 |
| 3.52876012124642e-06 | 4209227367.567 | 7450405668.702 | 11793675467.445 | 4804905579.78 |
| 3.53566917152198e-06 | 4210241212.723 | 7444220808.288 | 11773941495.015 | 4758142373.027 |
| 3.54259174920492e-06 | 4211175444.184 | 7437917463.302 | 11754067531.413 | 4711834283.96 |
| 3.54952788078089e-06 | 4212030181.01 | 7431496217.973 | 11734054791.843 | 4665976883.196 |
| 3.55647759278743e-06 | 4212805546.624 | 7424957660.718 | 11713904492.841 | 4620565784.462 |
| 3.563440911814e-06 | 4213501668.781 | 7418302384.077 | 11693617852.179 | 4575596644.173 |
| 3.57041786450213e-06 | 4214118679.546 | 7411530984.647 | 11673196088.772 | 4531065161.018 |
| 3.57740847754552e-06 | 4214656715.258 | 7404644063.013 | 11652640422.58 | 4486967075.548 |
| 3.58441277769014e-06 | 4215115916.51 | 7397642223.683 | 11631952074.518 | 4443298169.768 |
| 3.59143079173431e-06 | 4215496428.11 | 7390526075.025 | 11611132266.358 | 4400054266.735 |
| 3.59846254652883e-06 | 4215798399.063 | 7383296229.192 | 11590182220.636 | 4357231230.157 |
| 3.60550806897706e-06 | 4216021982.532 | 7375953302.065 | 11569103160.565 | 4314824963.998 |
| 3.61256738603506e-06 | 4216167335.812 | 7368497913.181 | 11547896309.936 | 4272831412.087 |
| 3.61964052471164e-06 | 4216234620.302 | 7360930685.667 | 11526562893.031 | 4231246557.728 |
| 3.6267275120685e-06 | 4216224001.471 | 7353252246.179 | 11505104134.53 | 4190066423.319 |
| 3.63382837522034e-06 | 4216135648.828 | 7345463224.828 | 11483521259.423 | 4149287069.967 |
| 3.64094314133493e-06 | 4215969735.894 | 7337564255.119 | 11461815492.918 | 4108904597.116 |
| 3.64807183763323e-06 | 4215726440.169 | 7329555973.886 | 11439988060.354 | 4068915142.17 |
| 3.65521449138951e-06 | 4215405943.097 | 7321439021.222 | 11418040187.113 | 4029314880.127 |
| 3.66237112993145e-06 | 4215008430.042 | 7313214040.416 | 11395973098.53 | 3990100023.21 |
| 3.66954178064021e-06 | 4214534090.251 | 7304881677.887 | 11373788019.809 | 3951266820.507 |
| 3.67672647095057e-06 | 4213983116.821 | 7296442583.118 | 11351486175.934 | 3912811557.611 |
| 3.68392522835103e-06 | 4213355706.671 | 7287897408.591 | 11329068791.585 | 3874730556.265 |
| 3.69113808038391e-06 | 4212652060.507 | 7279246809.722 | 11306537091.052 | 3837020174.01 |
| 3.69836505464545e-06 | 4211872382.788 | 7270491444.795 | 11283892298.151 | 3799676803.837 |
| 3.70560617878592e-06 | 4211016881.696 | 7261631974.897 | 11261135636.14 | 3762696873.843 |
| 3.71286148050975e-06 | 4210085769.101 | 7252669063.855 | 11238268327.638 | 3726076846.885 |
| 3.72013098757558e-06 | 4209079260.528 | 7243603378.169 | 11215291594.538 | 3689813220.249 |
| 3.72741472779642e-06 | 4207997575.124 | 7234435586.949 | 11192206657.928 | 3653902525.308 |
| 3.73471272903973e-06 | 4206840935.623 | 7225166361.849 | 11169014738.013 | 3618341327.194 |
| 3.74202501922754e-06 | 4205609568.314 | 7215796377.005 | 11145717054.028 | 3583126224.467 |
| 3.74935162633652e-06 | 4204303703.005 | 7206326308.97 | 11122314824.164 | 3548253848.793 |
| 3.75669257839817e-06 | 4202923572.99 | 7196756836.651 | 11098809265.484 | 3513720864.62 |
| 3.76404790349881e-06 | 4201469415.016 | 7187088641.241 | 11075201593.85 | 3479523968.857 |
| 3.77141762977981e-06 | 4199941469.244 | 7177322406.165 | 11051493023.842 | 3445659890.561 |
| 3.7788017854376e-06 | 4198339979.219 | 7167458817.005 | 11027684768.681 | 3412125390.625 |
| 3.78620039872382e-06 | 4196665191.833 | 7157498561.447 | 11003778040.154 | 3378917261.462 |
| 3.79361349794545e-06 | 4194917357.289 | 7147442329.213 | 10979774048.536 | 3346032326.707 |
| 3.80104111146486e-06 | 4193096729.069 | 7137290812 | 10955674002.521 | 3313467440.905 |
| 3.80848326769998e-06 | 4191203563.896 | 7127044703.417 | 10931479109.14 | 3281219489.216 |
| 3.81593999512436e-06 | 4189238121.698 | 7116704698.925 | 10907190573.692 | 3249285387.114 |
| 3.82341132226731e-06 | 4187200665.578 | 7106271495.77 | 10882809599.672 | 3217662080.093 |
| 3.830897277714e-06 | 4185091461.769 | 7095745792.929 | 10858337388.696 | 3186346543.375 |
| 3.83839789010554e-06 | 4182910779.608 | 7085128291.043 | 10833775140.432 | 3155335781.619 |
| 3.84591318813917e-06 | 4180658891.494 | 7074419692.357 | 10809124052.528 | 3124626828.638 |
| 3.85344320056826e-06 | 4178336072.854 | 7063620700.661 | 10784385320.542 | 3094216747.111 |
| 3.86098795620253e-06 | 4175942602.106 | 7052732021.227 | 10759560137.877 | 3064102628.305 |
| 3.86854748390805e-06 | 4173478760.626 | 7041754360.751 | 10734649695.703 | 3034281591.795 |
| 3.87612181260747e-06 | 4170944832.707 | 7030688427.292 | 10709655182.9 | 3004750785.192 |
| 3.88371097128001e-06 | 4168341105.526 | 7019534930.212 | 10684577785.983 | 2975507383.865 |
| 3.89131498896168e-06 | 4165667869.107 | 7008294580.116 | 10659418689.042 | 2946548590.675 |
| 3.8989338947453e-06 | 4162925416.286 | 6996968088.796 | 10634179073.67 | 2917871635.704 |
| 3.90656771778067e-06 | 4160114042.669 | 6985556169.169 | 10608860118.903 | 2889473775.993 |
| 3.91421648727466e-06 | 4157234046.603 | 6974059535.218 | 10583463001.155 | 2861352295.279 |
| 3.92188023249134e-06 | 4154285729.134 | 6962478901.936 | 10557988894.15 | 2833504503.735 |
| 3.92955898275205e-06 | 4151269393.973 | 6950814985.269 | 10532438968.869 | 2805927737.711 |
| 3.93725276743555e-06 | 4148185347.457 | 6939068502.055 | 10506814393.476 | 2778619359.481 |
| 3.94496161597813e-06 | 4145033898.515 | 6927240169.968 | 10481116333.267 | 2751576756.991 |
| 3.95268555787371e-06 | 4141815358.628 | 6915330707.463 | 10455345950.604 | 2724797343.609 |
| 3.96042462267395e-06 | 4138530041.797 | 6903340833.716 | 10429504404.856 | 2698278557.876 |
| 3.96817883998837e-06 | 4135178264.499 | 6891271268.571 | 10403592852.342 | 2672017863.263 |
| 3.97594823948448e-06 | 4131760345.659 | 6879122732.483 | 10377612446.269 | 2646012747.926 |
| 3.98373285088785e-06 | 4128276606.604 | 6866895946.459 | 10351564336.678 | 2620260724.468 |
| 3.99153270398227e-06 | 4124727371.034 | 6854591632.009 | 10325449670.386 | 2594759329.702 |
| 3.99934782860984e-06 | 4121112964.98 | 6842210511.086 | 10299269590.929 | 2569506124.412 |
| 4.00717825467109e-06 | 4117433716.767 | 6829753306.033 | 10273025238.506 | 2544498693.12 |
| 4.01502401212509e-06 | 4113689956.983 | 6817220739.528 | 10246717749.927 | 2519734643.86 |
| 4.02288513098957e-06 | 4109882018.434 | 6804613534.534 | 10220348258.557 | 2495211607.943 |
| 4.03076164134102e-06 | 4106010236.113 | 6791932414.239 | 10193917894.263 | 2470927239.733 |
| 4.03865357331484e-06 | 4102074947.16 | 6779178102.007 | 10167427783.362 | 2446879216.424 |
| 4.04656095710543e-06 | 4098076490.828 | 6766351321.327 | 10140879048.569 | 2423065237.815 |
| 4.05448382296628e-06 | 4094015208.443 | 6753452795.754 | 10114272808.944 | 2399483026.092 |
| 4.06242220121014e-06 | 4089891443.368 | 6740483248.864 | 10087610179.847 | 2376130325.61 |
| 4.07037612220911e-06 | 4085705540.968 | 6727443404.197 | 10060892272.881 | 2353004902.677 |
| 4.07834561639474e-06 | 4081457848.573 | 6714333985.209 | 10034120195.849 | 2330104545.338 |
| 4.08633071425818e-06 | 4077148715.439 | 6701155715.22 | 10007295052.704 | 2307427063.169 |
| 4.09433144635028e-06 | 4072778492.712 | 6687909317.363 | 9980417943.5 | 2284970287.062 |
| 4.10234784328169e-06 | 4068347533.394 | 6674595514.534 | 9953489964.348 | 2262732069.02 |
| 4.110379935723e-06 | 4063856192.305 | 6661215029.343 | 9926512207.366 | 2240710281.95 |
| 4.11842775440485e-06 | 4059304826.043 | 6647768584.063 | 9899485760.64 | 2218902819.462 |
| 4.12649133011807e-06 | 4054693792.954 | 6634256900.583 | 9872411708.172 | 2197307595.667 |
| 4.13457069371373e-06 | 4050023453.09 | 6620680700.358 | 9845291129.841 | 2175922544.975 |
| 4.14266587610336e-06 | 4045294168.176 | 6607040704.36 | 9818125101.358 | 2154745621.899 |
| 4.15077690825896e-06 | 4040506301.574 | 6593337633.033 | 9790914694.224 | 2133774800.862 |
| 4.1589038212132e-06 | 4035660218.242 | 6579572206.244 | 9763660975.69 | 2113008075.997 |
| 4.16704664605952e-06 | 4030756284.706 | 6565745143.234 | 9736365008.711 | 2092443460.962 |
| 4.17520541395221e-06 | 4025794869.016 | 6551857162.574 | 9709027851.909 | 2072078988.746 |
| 4.18338015610657e-06 | 4020776340.716 | 6537908982.119 | 9681650559.537 | 2051912711.48 |
| 4.19157090379902e-06 | 4015701070.803 | 6523901318.96 | 9654234181.43 | 2031942700.254 |
| 4.19977768836721e-06 | 4010569431.697 | 6509834889.38 | 9626779762.977 | 2012167044.932 |
| 4.20800054121017e-06 | 4005381797.201 | 6495710408.81 | 9599288345.078 | 1992583853.966 |
| 4.21623949378837e-06 | 4000138542.467 | 6481528591.782 | 9571760964.108 | 1973191254.218 |
| 4.2244945776239e-06 | 3994840043.96 | 6467290151.887 | 9544198651.88 | 1953987390.781 |
| 4.23276582430057e-06 | 3989486679.425 | 6452995801.729 | 9516602435.612 | 1934970426.799 |
| 4.24105326546402e-06 | 3984078827.848 | 6438646252.885 | 9488973337.889 | 1916138543.295 |
| 4.24935693282185e-06 | 3978616869.424 | 6424242215.857 | 9461312376.632 | 1897489938.993 |
| 4.25767685814375e-06 | 3973101185.521 | 6409784400.037 | 9433620565.062 | 1879022830.149 |
| 4.2660130732616e-06 | 3967532158.643 | 6395273513.656 | 9405898911.667 | 1860735450.378 |
| 4.27436561006961e-06 | 3961910172.4 | 6380710263.751 | 9378148420.173 | 1842626050.488 |
| 4.28273450052444e-06 | 3956235611.47 | 6366095356.117 | 9350370089.509 | 1824692898.309 |
| 4.29111977664532e-06 | 3950508861.564 | 6351429495.269 | 9322564913.777 | 1806934278.531 |
| 4.29952147051416e-06 | 3944730309.394 | 6336713384.403 | 9294733882.223 | 1789348492.535 |
| 4.30793961427569e-06 | 3938900342.639 | 6321947725.354 | 9266877979.208 | 1771933858.237 |
| 4.31637424013759e-06 | 3933019349.907 | 6307133218.556 | 9238998184.177 | 1754688709.922 |
| 4.32482538037058e-06 | 3927087720.705 | 6292270563.005 | 9211095471.631 | 1737611398.086 |
| 4.33329306730857e-06 | 3921105845.404 | 6277360456.219 | 9183170811.101 | 1720700289.279 |
| 4.34177733334879e-06 | 3915074115.206 | 6262403594.2 | 9155225167.122 | 1703953765.95 |
| 4.35027821095188e-06 | 3908992922.109 | 6247400671.395 | 9127259499.201 | 1687370226.288 |
| 4.35879573264205e-06 | 3902862658.875 | 6232352380.662 | 9099274761.8 | 1670948084.074 |
| 4.36732993100719e-06 | 3896683718.995 | 6217259413.229 | 9071271904.303 | 1654685768.523 |
| 4.37588083869899e-06 | 3890456496.659 | 6202122458.66 | 9043251870.999 | 1638581724.142 |
| 4.38444848843306e-06 | 3884181386.723 | 6186942204.819 | 9015215601.05 | 1622634410.574 |
| 4.3930329129891e-06 | 3877858784.67 | 6171719337.831 | 8987164028.475 | 1606842302.453 |
| 4.40163414521094e-06 | 3871489086.587 | 6156454542.052 | 8959098082.125 | 1591203889.26 |
| 4.41025221800676e-06 | 3865072689.127 | 6141148500.03 | 8931018685.661 | 1575717675.177 |
| 4.41888716434914e-06 | 3858609989.475 | 6125801892.472 | 8902926757.531 | 1560382178.942 |
| 4.42753901727524e-06 | 3852101385.323 | 6110415398.211 | 8874823210.953 | 1545195933.711 |
| 4.43620780988689e-06 | 3845547274.831 | 6094989694.17 | 8846708953.894 | 1530157486.915 |
| 4.44489357535074e-06 | 3838948056.599 | 6079525455.333 | 8818584889.046 | 1515265400.123 |
| 4.45359634689837e-06 | 3832304129.636 | 6064023354.707 | 8790451913.816 | 1500518248.901 |
| 4.46231615782643e-06 | 3825615893.326 | 6048484063.295 | 8762310920.298 | 1485914622.681 |
| 4.47105304149677e-06 | 3818883747.4 | 6032908250.059 | 8734162795.265 | 1471453124.622 |
| 4.47980703133654e-06 | 3812108091.902 | 6017296581.894 | 8706008420.143 | 1457132371.477 |
| 4.48857816083836e-06 | 3805289327.162 | 6001649723.594 | 8677848671.001 | 1442950993.462 |
| 4.49736646356041e-06 | 3798427853.76 | 5985968337.819 | 8649684418.531 | 1428907634.124 |
| 4.50617197312658e-06 | 3791524072.503 | 5970253085.073 | 8621516528.037 | 1415000950.212 |
| 4.51499472322659e-06 | 3784578384.388 | 5954504623.664 | 8593345859.417 | 1401229611.548 |
| 4.52383474761613e-06 | 3777591190.575 | 5938723609.682 | 8565173267.149 | 1387592300.898 |
| 4.53269208011697e-06 | 3770562892.359 | 5922910696.97 | 8536999600.278 | 1374087713.851 |
| 4.54156675461711e-06 | 3763493891.138 | 5907066537.09 | 8508825702.404 | 1360714558.689 |
| 4.55045880507091e-06 | 3756384588.381 | 5891191779.3 | 8480652411.669 | 1347471556.265 |
| 4.55936826549917e-06 | 3749235385.607 | 5875287070.527 | 8452480560.744 | 1334357439.883 |
| 4.56829516998935e-06 | 3742046684.349 | 5859353055.336 | 8424310976.819 | 1321370955.173 |
| 4.57723955269562e-06 | 3734818886.126 | 5843390375.906 | 8396144481.591 | 1308510859.975 |
| 4.58620144783903e-06 | 3727552392.417 | 5827399672.002 | 8367981891.256 | 1295775924.217 |
| 4.59518088970762e-06 | 3720247604.633 | 5811381580.951 | 8339824016.495 | 1283164929.798 |
| 4.60417791265659e-06 | 3712904924.086 | 5795336737.616 | 8311671662.471 | 1270676670.474 |
| 4.61319255110839e-06 | 3705524751.962 | 5779265774.37 | 8283525628.814 | 1258309951.738 |
| 4.62222483955286e-06 | 3698107489.296 | 5763169321.072 | 8255386709.617 | 1246063590.711 |
| 4.63127481254738e-06 | 3690653536.939 | 5747048005.043 | 8227255693.427 | 1233936416.024 |
| 4.64034250471697e-06 | 3683163295.538 | 5730902451.043 | 8199133363.238 | 1221927267.71 |
| 4.64942795075448e-06 | 3675637165.503 | 5714733281.244 | 8171020496.484 | 1210034997.091 |
| 4.65853118542066e-06 | 3668075546.982 | 5698541115.213 | 8142917865.033 | 1198258466.666 |
| 4.66765224354431e-06 | 3660478839.837 | 5682326569.883 | 8114826235.184 | 1186596550.008 |
| 4.67679116002246e-06 | 3652847443.613 | 5666090259.536 | 8086746367.658 | 1175048131.652 |
| 4.68594796982042e-06 | 3645181757.515 | 5649832795.779 | 8058679017.594 | 1163612106.987 |
| 4.69512270797199e-06 | 3637482180.383 | 5633554787.522 | 8030624934.547 | 1152287382.154 |
| 4.70431540957955e-06 | 3629749110.661 | 5617256840.958 | 8002584862.486 | 1141072873.94 |
| 4.71352610981422e-06 | 3621982946.379 | 5600939559.544 | 7974559539.784 | 1129967509.675 |
| 4.72275484391598e-06 | 3614184085.122 | 5584603543.978 | 7946549699.222 | 1118970227.127 |
| 4.73200164719379e-06 | 3606352924.007 | 5568249392.18 | 7918556067.983 | 1108079974.402 |
| 4.74126655502576e-06 | 3598489859.658 | 5551877699.274 | 7890579367.655 | 1097295709.846 |
| 4.75054960285927e-06 | 3590595288.182 | 5535489057.568 | 7862620314.222 | 1086616401.939 |
| 4.75985082621108e-06 | 3582669605.146 | 5519084056.537 | 7834679618.071 | 1076041029.204 |
| 4.76917026066752e-06 | 3574713205.547 | 5502663282.802 | 7806757983.986 | 1065568580.102 |
| 4.77850794188457e-06 | 3566726483.795 | 5486227320.114 | 7778856111.153 | 1055198052.941 |
| 4.78786390558804e-06 | 3558709833.688 | 5469776749.337 | 7750974693.156 | 1044928455.777 |
| 4.79723818757368e-06 | 3550663648.384 | 5453312148.431 | 7723114417.981 | 1034758806.321 |
| 4.80663082370732e-06 | 3542588320.384 | 5436834092.434 | 7695275968.016 | 1024688131.841 |
| 4.81604184992502e-06 | 3534484241.504 | 5420343153.446 | 7667460020.052 | 1014715469.076 |
| 4.82547130223321e-06 | 3526351802.856 | 5403839900.615 | 7639667245.29 | 1004839864.137 |
| 4.83491921670879e-06 | 3518191394.823 | 5387324900.12 | 7611898309.337 | 995060372.42 |
| 4.84438562949933e-06 | 3510003407.038 | 5370798715.157 | 7584153872.214 | 985376058.513 |
| 4.85387057682315e-06 | 3501788228.364 | 5354261905.923 | 7556434588.359 | 975785996.109 |
| 4.86337409496948e-06 | 3493546246.866 | 5337715029.601 | 7528741106.627 | 966289267.917 |
| 4.87289622029862e-06 | 3485277849.796 | 5321158640.35 | 7501074070.3 | 956884965.57 |
| 4.88243698924206e-06 | 3476983423.57 | 5304593289.287 | 7473434117.088 | 947572189.546 |
| 4.89199643830259e-06 | 3468663353.745 | 5288019524.475 | 7445821879.136 | 938350049.074 |
| 4.90157460405452e-06 | 3460318025 | 5271437890.912 | 7418237983.027 | 929217662.053 |
| 4.91117152314372e-06 | 3451947821.114 | 5254848930.518 | 7390683049.792 | 920174154.969 |
| 4.92078723228785e-06 | 3443553124.947 | 5238253182.119 | 7363157694.914 | 911218662.808 |
| 4.93042176827642e-06 | 3435134318.42 | 5221651181.44 | 7335662528.332 | 902350328.973 |
| 4.94007516797102e-06 | 3426691782.495 | 5205043461.094 | 7308198154.453 | 893568305.207 |
| 4.94974746830536e-06 | 3418225897.152 | 5188430550.565 | 7280765172.158 | 884871751.505 |
| 4.9594387062855e-06 | 3409737041.378 | 5171812976.203 | 7253364174.808 | 876259836.041 |
| 4.96914891898995e-06 | 3401225593.137 | 5155191261.212 | 7225995750.253 | 867731735.083 |
| 4.9788781435698e-06 | 3392691929.36 | 5138565925.64 | 7198660480.841 | 859286632.914 |
| 4.9886264172489e-06 | 3384136425.921 | 5121937486.369 | 7171358943.428 | 850923721.758 |
| 4.99839377732397e-06 | 3375559457.623 | 5105306457.104 | 7144091709.384 | 842642201.701 |
| 5.00818026116475e-06 | 3366961398.175 | 5088673348.367 | 7116859344.606 | 834441280.613 |
| 5.01798590621415e-06 | 3358342620.177 | 5072038667.489 | 7089662409.524 | 826320174.073 |
| 5.02781074998841e-06 | 3349703495.103 | 5055402918.597 | 7062501459.118 | 818278105.295 |
| 5.03765483007719e-06 | 3341044393.28 | 5038766602.611 | 7035377042.919 | 810314305.053 |
| 5.04751818414378e-06 | 3332365683.875 | 5022130217.232 | 7008289705.029 | 802428011.607 |
| 5.05740084992519e-06 | 3323667734.876 | 5005494256.941 | 6981239984.127 | 794618470.631 |
| 5.06730286523232e-06 | 3314950913.072 | 4988859212.983 | 6954228413.481 | 786884935.14 |
| 5.07722426795012e-06 | 3306215584.045 | 4972225573.369 | 6927255520.963 | 779226665.42 |
| 5.08716509603768e-06 | 3297462112.144 | 4955593822.864 | 6900321829.055 | 771642928.953 |
| 5.09712538752844e-06 | 3288690860.475 | 4938964442.985 | 6873427854.87 | 764133000.355 |
| 5.1071051805303e-06 | 3279902190.886 | 4922337911.991 | 6846574110.156 | 756696161.298 |
| 5.11710451322577e-06 | 3271096463.944 | 4905714704.882 | 6819761101.316 | 749331700.446 |
| 5.12712342387211e-06 | 3262274038.929 | 4889095293.39 | 6792989329.416 | 742038913.387 |
| 5.13716195080151e-06 | 3253435273.814 | 4872480145.977 | 6766259290.204 | 734817102.562 |
| 5.14722013242119e-06 | 3244580525.248 | 4855869727.83 | 6739571474.118 | 727665577.205 |
| 5.15729800721357e-06 | 3235710148.546 | 4839264500.856 | 6712926366.306 | 720583653.27 |
| 5.16739561373642e-06 | 3226824497.674 | 4822664923.678 | 6686324446.635 | 713570653.368 |
| 5.177512990623e-06 | 3217923925.231 | 4806071451.633 | 6659766189.709 | 706625906.704 |
| 5.18765017658223e-06 | 3209008782.439 | 4789484536.768 | 6633252064.886 | 699748749.011 |
| 5.19780721039878e-06 | 3200079419.127 | 4772904627.836 | 6606782536.287 | 692938522.487 |
| 5.2079841309333e-06 | 3191136183.72 | 4756332170.295 | 6580358062.818 | 686194575.732 |
| 5.2181809771225e-06 | 3182179423.221 | 4739767606.304 | 6553979098.181 | 679516263.685 |
| 5.22839778797933e-06 | 3173209483.205 | 4723211374.723 | 6527646090.893 | 672902947.564 |
| 5.23863460259313e-06 | 3164226707.8 | 4706663911.108 | 6501359484.301 | 666353994.803 |
| 5.24889146012977e-06 | 3155231439.676 | 4690125647.712 | 6475119716.599 | 659868778.994 |
| 5.2591683998318e-06 | 3146224020.035 | 4673597013.485 | 6448927220.844 | 653446679.822 |
| 5.26946546101861e-06 | 3137204788.597 | 4657078434.069 | 6422782424.974 | 647087083.014 |
| 5.27978268308658e-06 | 3128174083.588 | 4640570331.8 | 6396685751.823 | 640789380.271 |
| 5.29012010550921e-06 | 3119132241.728 | 4624073125.708 | 6370637619.143 | 634552969.216 |
| 5.3004777678373e-06 | 3110079598.223 | 4607587231.514 | 6344638439.617 | 628377253.335 |
| 5.31085570969908e-06 | 3101016486.748 | 4591113061.634 | 6318688620.878 | 622261641.919 |
| 5.32125397080037e-06 | 3091943239.439 | 4574651025.176 | 6292788565.53 | 616205550.008 |
| 5.33167259092474e-06 | 3082860186.886 | 4558201527.941 | 6266938671.161 | 610208398.335 |
| 5.34211160993363e-06 | 3073767658.115 | 4541764972.428 | 6241139330.367 | 604269613.271 |
| 5.35257106776655e-06 | 3064665980.582 | 4525341757.83 | 6215390930.768 | 598388626.768 |
| 5.3630510044412e-06 | 3055555480.164 | 4508932280.036 | 6189693855.024 | 592564876.31 |
| 5.37355146005363e-06 | 3046436481.145 | 4492536931.637 | 6164048480.861 | 586797804.853 |
| 5.3840724747784e-06 | 3037309306.212 | 4476156101.922 | 6138455181.086 | 581086860.774 |
| 5.39461408886872e-06 | 3028174276.438 | 4459790176.885 | 6112914323.604 | 575431497.82 |
| 5.40517634265662e-06 | 3019031711.281 | 4443439539.225 | 6087426271.443 | 569831175.055 |
| 5.4157592765531e-06 | 3009881928.567 | 4427104568.348 | 6061991382.772 | 564285356.805 |
| 5.42636293104827e-06 | 3000725244.489 | 4410785640.372 | 6036610010.919 | 558793512.612 |
| 5.43698734671152e-06 | 2991561973.591 | 4394483128.129 | 6011282504.392 | 553355117.178 |
| 5.44763256419168e-06 | 2982392428.766 | 4378197401.167 | 5986009206.901 | 547969650.321 |
| 5.45829862421717e-06 | 2973216921.243 | 4361928825.755 | 5960790457.379 | 542636596.918 |
| 5.46898556759614e-06 | 2964035760.581 | 4345677764.888 | 5935626589.997 | 537355446.862 |
| 5.47969343521665e-06 | 2954849254.662 | 4329444578.288 | 5910517934.193 | 532125695.009 |
| 5.4904222680468e-06 | 2945657709.681 | 4313229622.411 | 5885464814.686 | 526946841.131 |
| 5.50117210713492e-06 | 2936461430.142 | 4297033250.448 | 5860467551.503 | 521818389.87 |
| 5.5119429936097e-06 | 2927260718.847 | 4280855812.334 | 5835526459.994 | 516739850.688 |
| 5.52273496868037e-06 | 2918055876.892 | 4264697654.75 | 5810641850.858 | 511710737.821 |
| 5.53354807363683e-06 | 2908847203.66 | 4248559121.128 | 5785814030.165 | 506730570.234 |
| 5.54438234984982e-06 | 2899634996.812 | 4232440551.658 | 5761043299.374 | 501798871.571 |
| 5.55523783877109e-06 | 2890419552.283 | 4216342283.291 | 5736329955.357 | 496915170.114 |
| 5.56611458193356e-06 | 2881201164.274 | 4200264649.748 | 5711674290.422 | 492078998.736 |
| 5.57701262095144e-06 | 2871980125.25 | 4184207981.524 | 5687076592.331 | 487289894.856 |
| 5.58793199752045e-06 | 2862756725.927 | 4168172605.891 | 5662537144.329 | 482547400.394 |
| 5.59887275341791e-06 | 2853531255.275 | 4152158846.911 | 5638056225.159 | 477851061.73 |
| 5.60983493050298e-06 | 2844304000.506 | 4136167025.436 | 5613634109.09 | 473200429.657 |
| 5.62081857071673e-06 | 2835075247.071 | 4120197459.121 | 5589271065.935 | 468595059.341 |
| 5.6318237160824e-06 | 2825845278.656 | 4104250462.423 | 5564967361.079 | 464034510.277 |
| 5.64285040870546e-06 | 2816614377.174 | 4088326346.615 | 5540723255.496 | 459518346.248 |
| 5.65389869077384e-06 | 2807382822.767 | 4072425419.79 | 5516539005.776 | 455046135.28 |
| 5.66496860455808e-06 | 2798150893.792 | 4056547986.869 | 5492414864.147 | 450617449.606 |
| 5.67606019241147e-06 | 2788918866.826 | 4040694349.608 | 5468351078.496 | 446231865.621 |
| 5.68717349677023e-06 | 2779687016.656 | 4024864806.607 | 5444347892.395 | 441888963.842 |
| 5.69830856015366e-06 | 2770455616.276 | 4009059653.316 | 5420405545.123 | 437588328.869 |
| 5.70946542516432e-06 | 2761224936.885 | 3993279182.044 | 5396524271.69 | 433329549.345 |
| 5.72064413448818e-06 | 2751995247.883 | 3977523681.97 | 5372704302.858 | 429112217.918 |
| 5.73184473089477e-06 | 2742766816.866 | 3961793439.144 | 5348945865.168 | 424935931.197 |
| 5.74306725723738e-06 | 2733539909.626 | 3946088736.506 | 5325249180.961 | 420800289.72 |
| 5.7543117564532e-06 | 2724314790.144 | 3930409853.885 | 5301614468.403 | 416704897.912 |
| 5.76557827156348e-06 | 2715091720.59 | 3914757068.013 | 5278041941.508 | 412649364.048 |
| 5.7768668456737e-06 | 2705870961.319 | 3899130652.534 | 5254531810.162 | 408633300.213 |
| 5.78817752197375e-06 | 2696652770.869 | 3883530878.011 | 5231084280.148 | 404656322.271 |
| 5.79951034373809e-06 | 2687437405.96 | 3867958011.936 | 5207699553.166 | 400718049.823 |
| 5.81086535432587e-06 | 2678225121.487 | 3852412318.743 | 5184377826.864 | 396818106.171 |
| 5.82224259718118e-06 | 2669016170.525 | 3836894059.811 | 5161119294.854 | 392956118.285 |
| 5.83364211583313e-06 | 2659810804.322 | 3821403493.479 | 5137924146.743 | 389131716.765 |
| 5.84506395389609e-06 | 2650609272.299 | 3805940875.055 | 5114792568.152 | 385344535.805 |
| 5.8565081550698e-06 | 2641411822.047 | 3790506456.824 | 5091724740.744 | 381594213.161 |
| 5.86797476313958e-06 | 2632218699.33 | 3775100488.06 | 5068720842.244 | 377880390.113 |
| 5.87946382197646e-06 | 2623030148.079 | 3759723215.036 | 5045781046.47 | 374202711.433 |
| 5.89097537553738e-06 | 2613846410.393 | 3744374881.034 | 5022905523.349 | 370560825.35 |
| 5.90250946786533e-06 | 2604667726.536 | 3729055726.356 | 5000094438.949 | 366954383.516 |
| 5.91406614308955e-06 | 2595494334.943 | 3713765988.334 | 4977347955.499 | 363383040.974 |
| 5.92564544542568e-06 | 2586326472.209 | 3698505901.343 | 4954666231.412 | 359846456.125 |
| 5.93724741917592e-06 | 2577164373.098 | 3683275696.808 | 4932049421.316 | 356344290.693 |
| 5.9488721087292e-06 | 2568008270.538 | 3668075603.219 | 4909497676.072 | 352876209.694 |
| 5.9605195585614e-06 | 2558858395.621 | 3652905846.139 | 4887011142.801 | 349441881.407 |
| 5.97218981323544e-06 | 2549714977.605 | 3637766648.219 | 4864589964.911 | 346040977.336 |
| 5.98388291740152e-06 | 2540578243.91 | 3622658229.206 | 4842234282.115 | 342673172.183 |
| 5.99559891579723e-06 | 2531448420.126 | 3607580805.954 | 4819944230.464 | 339338143.818 |
| 6.00733785324778e-06 | 2522325730.006 | 3592534592.44 | 4797719942.364 | 336035573.244 |
| 6.01909977466614e-06 | 2513210395.468 | 3577519799.773 | 4775561546.607 | 332765144.57 |
| 6.03088472505322e-06 | 2504102636.601 | 3562536636.204 | 4753469168.391 | 329526544.976 |
| 6.04269274949801e-06 | 2495002671.657 | 3547585307.14 | 4731442929.345 | 326319464.692 |
| 6.05452389317781e-06 | 2485910717.062 | 3532666015.157 | 4709482947.559 | 323143596.958 |
| 6.06637820135838e-06 | 2476826987.409 | 3517778960.011 | 4687589337.601 | 319998638.002 |
| 6.07825571939407e-06 | 2467751695.463 | 3502924338.65 | 4665762210.547 | 316884287.008 |
| 6.09015649272806e-06 | 2458685052.163 | 3488102345.225 | 4644001674.003 | 313800246.087 |
| 6.1020805668925e-06 | 2449627266.62 | 3473313171.105 | 4622307832.133 | 310746220.25 |
| 6.11402798750869e-06 | 2440578546.124 | 3458557004.89 | 4600680785.678 | 307721917.378 |
| 6.12599880028725e-06 | 2431539096.141 | 3443834032.418 | 4579120631.987 | 304727048.195 |
| 6.13799305102828e-06 | 2422509120.317 | 3429144436.785 | 4557627465.038 | 301761326.243 |
| 6.15001078562158e-06 | 2413488820.48 | 3414488398.354 | 4536201375.461 | 298824467.848 |
| 6.1620520500468e-06 | 2404478396.643 | 3399866094.765 | 4514842450.57 | 295916192.099 |
| 6.17411689037359e-06 | 2395478047.004 | 3385277700.956 | 4493550774.377 | 293036220.819 |
| 6.18620535276182e-06 | 2386487967.951 | 3370723389.168 | 4472326427.627 | 290184278.538 |
| 6.19831748346172e-06 | 2377508354.062 | 3356203328.96 | 4451169487.815 | 287360092.467 |
| 6.21045332881411e-06 | 2368539398.11 | 3341717687.225 | 4430080029.214 | 284563392.47 |
| 6.2226129352505e-06 | 2359581291.065 | 3327266628.202 | 4409058122.9 | 281793911.044 |
| 6.23479634929333e-06 | 2350634222.096 | 3312850313.487 | 4388103836.775 | 279051383.287 |
| 6.24700361755613e-06 | 2341698378.576 | 3298468902.049 | 4367217235.59 | 276335546.875 |
| 6.25923478674369e-06 | 2332773946.081 | 3284122550.242 | 4346398380.976 | 273646142.037 |
| 6.27148990365225e-06 | 2323861108.4 | 3269811411.819 | 4325647331.461 | 270982911.531 |
| 6.28376901516966e-06 | 2314960047.531 | 3255535637.944 | 4304964142.497 | 268345600.619 |
| 6.29607216827559e-06 | 2306070943.69 | 3241295377.208 | 4284348866.486 | 265733957.04 |
| 6.30839941004169e-06 | 2297193975.312 | 3227090775.643 | 4263801552.802 | 263147730.991 |
| 6.32075078763175e-06 | 2288329319.055 | 3212921976.732 | 4243322247.82 | 260586675.098 |
| 6.33312634830194e-06 | 2279477149.803 | 3198789121.425 | 4222910994.932 | 258050544.396 |
| 6.34552613940092e-06 | 2270637640.672 | 3184692348.153 | 4202567834.579 | 255539096.302 |
| 6.35795020837008e-06 | 2261810963.012 | 3170631792.843 | 4182292804.272 | 253052090.596 |
| 6.37039860274369e-06 | 2252997286.412 | 3156607588.928 | 4162085938.616 | 250589289.395 |
| 6.38287137014907e-06 | 2244196778.705 | 3142619867.365 | 4141947269.333 | 248150457.131 |
| 6.39536855830682e-06 | 2235409605.97 | 3128668756.648 | 4121876825.291 | 245735360.531 |
| 6.40789021503096e-06 | 2226635932.538 | 3114754382.819 | 4101874632.523 | 243343768.588 |
| 6.42043638822911e-06 | 2217875920.995 | 3100876869.485 | 4081940714.251 | 240975452.546 |
| 6.43300712590272e-06 | 2209129732.19 | 3087036337.834 | 4062075090.914 | 238630185.876 |
| 6.44560247614721e-06 | 2200397525.236 | 3073232906.643 | 4042277780.189 | 236307744.252 |
| 6.45822248715216e-06 | 2191679457.515 | 3059466692.299 | 4022548797.014 | 234007905.531 |
| 6.47086720720151e-06 | 2182975684.685 | 3045737808.808 | 4002888153.615 | 231730449.734 |
| 6.48353668467374e-06 | 2174286360.684 | 3032046367.811 | 3983295859.527 | 229475159.021 |
| 6.49623096804203e-06 | 2165611637.734 | 3018392478.601 | 3963771921.617 | 227241817.672 |
| 6.5089501058745e-06 | 2156951666.347 | 3004776248.132 | 3944316344.113 | 225030212.069 |
| 6.52169414683433e-06 | 2148306595.33 | 2991197781.037 | 3924929128.619 | 222840130.671 |
| 6.53446313968e-06 | 2139676571.791 | 2977657179.642 | 3905610274.146 | 220671363.995 |
| 6.54725713326545e-06 | 2131061741.142 | 2964154543.98 | 3886359777.133 | 218523704.598 |
| 6.56007617654028e-06 | 2122462247.107 | 2950689971.804 | 3867177631.467 | 216396947.056 |
| 6.57292031854991e-06 | 2113878231.726 | 2937263558.605 | 3848063828.512 | 214290887.945 |
| 6.5857896084358e-06 | 2105309835.361 | 2923875397.621 | 3829018357.13 | 212205325.818 |
| 6.59868409543563e-06 | 2096757196.702 | 2910525579.857 | 3810041203.7 | 210140061.192 |
| 6.61160382888347e-06 | 2088220452.773 | 2897214194.095 | 3791132352.149 | 208094896.524 |
| 6.62454885821001e-06 | 2079699738.934 | 2883941326.914 | 3772291783.968 | 206069636.192 |
| 6.63751923294267e-06 | 2071195188.893 | 2870707062.697 | 3753519478.239 | 204064086.479 |
| 6.6505150027059e-06 | 2062706934.709 | 2857511483.652 | 3734815411.657 | 202078055.556 |
| 6.66353621722128e-06 | 2054235106.796 | 2844354669.823 | 3716179558.55 | 200111353.456 |
| 6.67658292630773e-06 | 2045779833.931 | 2831236699.107 | 3697611890.907 | 198163792.065 |
| 6.68965517988174e-06 | 2037341243.262 | 2818157647.266 | 3679112378.397 | 196235185.097 |
| 6.70275302795752e-06 | 2028919460.311 | 2805117587.943 | 3660680988.393 | 194325348.082 |
| 6.7158765206472e-06 | 2020514608.98 | 2792116592.676 | 3642317685.993 | 192434098.342 |
| 6.72902570816103e-06 | 2012126811.562 | 2779154730.913 | 3624022434.043 | 190561254.978 |
| 6.74220064080756e-06 | 2003756188.741 | 2766232070.027 | 3605795193.162 | 188706638.854 |
| 6.75540136899386e-06 | 1995402859.603 | 2753348675.329 | 3587635921.76 | 186870072.573 |
| 6.76862794322568e-06 | 1987066941.642 | 2740504610.086 | 3569544576.064 | 185051380.469 |
| 6.78188041410766e-06 | 1978748550.764 | 2727699935.53 | 3551521110.137 | 183250388.582 |
| 6.79515883234351e-06 | 1970447801.297 | 2714934710.877 | 3533565475.901 | 181466924.648 |
| 6.80846324873622e-06 | 1962164805.993 | 2702208993.341 | 3515677623.163 | 179700818.078 |
| 6.82179371418826e-06 | 1953899676.04 | 2689522838.147 | 3497857499.628 | 177951899.942 |
| 6.83515027970174e-06 | 1945652521.067 | 2676876298.546 | 3480105050.931 | 176220002.956 |
| 6.84853299637866e-06 | 1937423449.148 | 2664269425.832 | 3462420220.651 | 174504961.465 |
| 6.86194191542105e-06 | 1929212566.812 | 2651702269.353 | 3444802950.335 | 172806611.423 |
| 6.87537708813119e-06 | 1921019979.05 | 2639174876.526 | 3427253179.522 | 171124790.383 |
| 6.88883856591182e-06 | 1912845789.319 | 2626687292.854 | 3409770845.762 | 169459337.479 |
| 6.9023264002663e-06 | 1904690099.552 | 2614239561.94 | 3392355884.636 | 167810093.409 |
| 6.91584064279886e-06 | 1896553010.165 | 2601831725.498 | 3375008229.78 | 166176900.422 |
| 6.92938134521475e-06 | 1888434620.061 | 2589463823.373 | 3357727812.905 | 164559602.304 |
| 6.94294855932045e-06 | 1880335026.642 | 2577135893.55 | 3340514563.82 | 162958044.359 |
| 6.95654233702388e-06 | 1872254325.81 | 2564847972.171 | 3323368410.449 | 161372073.398 |
| 6.97016273033459e-06 | 1864192611.981 | 2552600093.553 | 3306289278.854 | 159801537.722 |
| 6.98380979136398e-06 | 1856149978.088 | 2540392290.194 | 3289277093.258 | 158246287.109 |
| 6.99748357232544e-06 | 1848126515.587 | 2528224592.795 | 3272331776.062 | 156706172.799 |
| 7.01118412553462e-06 | 1840122314.47 | 2516097030.272 | 3255453247.868 | 155181047.48 |
| 7.02491150340961e-06 | 1832137463.268 | 2504009629.769 | 3238641427.498 | 153670765.272 |
| 7.03866575847108e-06 | 1824172049.058 | 2491962416.673 | 3221896232.016 | 152175181.717 |
| 7.0524469433426e-06 | 1816226157.473 | 2479955414.63 | 3205217576.747 | 150694153.762 |
| 7.06625511075072e-06 | 1808299872.708 | 2467988645.556 | 3188605375.299 | 149227539.746 |
| 7.08009031352524e-06 | 1800393277.529 | 2456062129.655 | 3172059539.58 | 147775199.387 |
| 7.09395260459941e-06 | 1792506453.279 | 2444175885.43 | 3155579979.821 | 146336993.768 |
| 7.1078420370101e-06 | 1784639479.885 | 2432329929.701 | 3139166604.596 | 144912785.325 |
| 7.12175866389804e-06 | 1776792435.867 | 2420524277.615 | 3122819320.839 | 143502437.832 |
| 7.13570253850799e-06 | 1768965398.347 | 2408758942.661 | 3106538033.865 | 142105816.388 |
| 7.14967371418897e-06 | 1761158443.053 | 2397033936.687 | 3090322647.393 | 140722787.406 |
| 7.16367224439445e-06 | 1753371644.329 | 2385349269.913 | 3074173063.56 | 139353218.599 |
| 7.17769818268256e-06 | 1745605075.143 | 2373704950.942 | 3058089182.945 | 137996978.967 |
| 7.19175158271629e-06 | 1737858807.095 | 2362100986.778 | 3042070904.585 | 136653938.786 |
| 7.20583249826369e-06 | 1730132910.422 | 2350537382.838 | 3026118125.996 | 135323969.594 |
| 7.2199409831981e-06 | 1722427454.008 | 2339014142.965 | 3010230743.193 | 134006944.178 |
| 7.23407709149833e-06 | 1714742505.394 | 2327531269.446 | 2994408650.706 | 132702736.565 |
| 7.24824087724888e-06 | 1707078130.78 | 2316088763.021 | 2978651741.604 | 131411222.007 |
| 7.26243239464014e-06 | 1699434395.038 | 2304686622.9 | 2962959907.507 | 130132276.97 |
| 7.27665169796861e-06 | 1691811361.719 | 2293324846.775 | 2947333038.61 | 128865779.123 |
| 7.29089884163709e-06 | 1684209093.057 | 2282003430.836 | 2931771023.702 | 127611607.325 |
| 7.30517388015489e-06 | 1676627649.984 | 2270722369.782 | 2916273750.179 | 126369641.613 |
| 7.31947686813807e-06 | 1669067092.131 | 2259481656.838 | 2900841104.068 | 125139763.194 |
| 7.33380786030958e-06 | 1661527477.839 | 2248281283.764 | 2885472970.045 | 123921854.429 |
| 7.34816691149957e-06 | 1654008864.167 | 2237121240.874 | 2870169231.447 | 122715798.826 |
| 7.3625540766455e-06 | 1646511306.902 | 2226001517.047 | 2854929770.3 | 121521481.023 |
| 7.37696941079241e-06 | 1639034860.56 | 2214922099.739 | 2839754467.327 | 120338786.786 |
| 7.39141296909311e-06 | 1631579578.404 | 2203882974.999 | 2824643201.974 | 119167602.987 |
| 7.4058848068084e-06 | 1624145512.444 | 2192884127.481 | 2809595852.423 | 118007817.605 |
| 7.42038497930728e-06 | 1616732713.446 | 2181925540.459 | 2794612295.611 | 116859319.704 |
| 7.43491354206714e-06 | 1609341230.946 | 2171007195.84 | 2779692407.247 | 115721999.43 |
| 7.44947055067401e-06 | 1601971113.251 | 2160129074.174 | 2764836061.832 | 114595747.999 |
| 7.46405606082275e-06 | 1594622407.45 | 2149291154.672 | 2750043132.672 | 113480457.684 |
| 7.47867012831725e-06 | 1587295159.422 | 2138493415.218 | 2735313491.902 | 112376021.808 |
| 7.49331280907069e-06 | 1579989413.846 | 2127735832.38 | 2720647010.494 | 111282334.73 |
| 7.50798415910568e-06 | 1572705214.205 | 2117018381.424 | 2706043558.282 | 110199291.84 |
| 7.52268423455457e-06 | 1565442602.796 | 2106341036.33 | 2691503003.975 | 109126789.544 |
| 7.53741309165958e-06 | 1558201620.74 | 2095703769.801 | 2677025215.175 | 108064725.256 |
| 7.55217078677305e-06 | 1550982307.987 | 2085106553.279 | 2662610058.395 | 107012997.39 |
| 7.56695737635766e-06 | 1543784703.324 | 2074549356.955 | 2648257399.071 | 105971505.349 |
| 7.58177291698664e-06 | 1536608844.388 | 2064032149.786 | 2633967101.586 | 104940149.512 |
| 7.596617465344e-06 | 1529454767.667 | 2053554899.504 | 2619739029.277 | 103918831.231 |
| 7.61149107822468e-06 | 1522322508.515 | 2043117572.63 | 2605573044.461 | 102907452.816 |
| 7.6263938125349e-06 | 1515212101.154 | 2032720134.488 | 2591469008.444 | 101905917.528 |
| 7.64132572529223e-06 | 1508123578.685 | 2022362549.217 | 2577426781.542 | 100914129.57 |
| 7.65628687362591e-06 | 1501056973.097 | 2012044779.782 | 2563446223.092 | 99931994.078 |
| 7.67127731477704e-06 | 1494012315.275 | 2001766787.989 | 2549527191.474 | 98959417.11 |
| 7.68629710609876e-06 | 1486989635.005 | 1991528534.498 | 2535669544.119 | 97996305.639 |
| 7.70134630505654e-06 | 1479988960.984 | 1981329978.831 | 2521873137.534 | 97042567.543 |
| 7.71642496922834e-06 | 1473010320.829 | 1971171079.391 | 2508137827.309 | 96098111.596 |
| 7.73153315630486e-06 | 1466053741.085 | 1961051793.467 | 2494463468.139 | 95162847.461 |
| 7.74667092408977e-06 | 1459119247.232 | 1950972077.254 | 2480849913.833 | 94236685.679 |
| 7.76183833049988e-06 | 1452206863.693 | 1940931885.859 | 2467297017.337 | 93319537.664 |
| 7.77703543356542e-06 | 1445316613.841 | 1930931173.317 | 2453804630.741 | 92411315.689 |
| 7.79226229143025e-06 | 1438448520.011 | 1920969892.602 | 2440372605.302 | 91511932.883 |
| 7.80751896235205e-06 | 1431602603.504 | 1911047995.637 | 2427000791.45 | 90621303.22 |
| 7.82280550470257e-06 | 1424778884.598 | 1901165433.312 | 2413689038.811 | 89739341.511 |
| 7.83812197696785e-06 | 1417977382.552 | 1891322155.487 | 2400437196.219 | 88865963.395 |
| 7.85346843774845e-06 | 1411198115.619 | 1881518111.014 | 2387245111.727 | 88001085.335 |
| 7.86884494575964e-06 | 1404441101.051 | 1871753247.741 | 2374112632.627 | 87144624.603 |
| 7.88425155983167e-06 | 1397706355.106 | 1862027512.528 | 2361039605.462 | 86296499.28 |
| 7.89968833890997e-06 | 1390993893.058 | 1852340851.255 | 2348025876.038 | 85456628.242 |
| 7.9151553420554e-06 | 1384303729.207 | 1842693208.84 | 2335071289.442 | 84624931.155 |
| 7.93065262844442e-06 | 1377635876.882 | 1833084529.244 | 2322175690.056 | 83801328.466 |
| 7.94618025736938e-06 | 1370990348.451 | 1823514755.487 | 2309338921.566 | 82985741.399 |
| 7.96173828823871e-06 | 1364367155.331 | 1813983829.657 | 2296560826.982 | 82178091.942 |
| 7.97732678057716e-06 | 1357766307.993 | 1804491692.923 | 2283841248.649 | 81378302.843 |
| 7.99294579402602e-06 | 1351187815.97 | 1795038285.546 | 2271180028.259 | 80586297.603 |
| 8.00859538834337e-06 | 1344631687.87 | 1785623546.89 | 2258577006.868 | 79802000.464 |
| 8.02427562340426e-06 | 1338097931.374 | 1776247415.433 | 2246032024.907 | 79025336.41 |
| 8.03998655920101e-06 | 1331586553.255 | 1766909828.78 | 2233544922.198 | 78256231.152 |
| 8.05572825584338e-06 | 1325097559.378 | 1757610723.672 | 2221115537.962 | 77494611.125 |
| 8.0715007735588e-06 | 1318630954.709 | 1748350035.998 | 2208743710.84 | 76740403.48 |
| 8.08730417269267e-06 | 1312186743.327 | 1739127700.807 | 2196429278.896 | 75993536.077 |
| 8.1031385137085e-06 | 1305764928.427 | 1729943652.317 | 2184172079.642 | 75253937.477 |
| 8.11900385718819e-06 | 1299365512.33 | 1720797823.928 | 2171971950.039 | 74521536.938 |
| 8.13490026383227e-06 | 1292988496.49 | 1711690148.231 | 2159828726.518 | 73796264.405 |
| 8.15082779446012e-06 | 1286633881.503 | 1702620557.021 | 2147742244.988 | 73078050.506 |
| 8.16678651001017e-06 | 1280301667.113 | 1693588981.305 | 2135712340.853 | 72366826.544 |
| 8.1827764715402e-06 | 1273991852.221 | 1684595351.316 | 2123738849.02 | 71662524.489 |
| 8.19879774022749e-06 | 1267704434.891 | 1675639596.519 | 2111821603.911 | 70965076.976 |
| 8.21485037736916e-06 | 1261439412.361 | 1666721645.627 | 2099960439.482 | 70274417.292 |
| 8.2309344443823e-06 | 1255196781.045 | 1657841426.608 | 2088155189.226 | 69590479.377 |
| 8.24705000280427e-06 | 1248976536.548 | 1648998866.695 | 2076405686.192 | 68913197.811 |
| 8.26319711429291e-06 | 1242778673.666 | 1640193892.4 | 2064711762.993 | 68242507.813 |
| 8.27937584062677e-06 | 1236603186.399 | 1631426429.521 | 2053073251.82 | 67578345.229 |
| 8.29558624370538e-06 | 1230450067.955 | 1622696403.152 | 2041489984.452 | 66920646.534 |
| 8.31182838554945e-06 | 1224319310.762 | 1614003737.697 | 2029961792.271 | 66269348.818 |
| 8.32810232830113e-06 | 1218210906.47 | 1605348356.874 | 2018488506.267 | 65624389.784 |
| 8.34440813422423e-06 | 1212124845.962 | 1596730183.732 | 2007069957.056 | 64985707.742 |
| 8.36074586570448e-06 | 1206061119.359 | 1588149140.656 | 1995705974.89 | 64353241.602 |
| 8.37711558524974e-06 | 1200019716.032 | 1579605149.379 | 1984396389.664 | 63726930.868 |
| 8.39351735549027e-06 | 1194000624.604 | 1571098130.991 | 1973141030.931 | 63106715.632 |
| 8.40995123917897e-06 | 1188003832.96 | 1562628005.95 | 1961939727.914 | 62492536.573 |
| 8.42641729919156e-06 | 1182029328.253 | 1554194694.091 | 1950792309.514 | 61884334.942 |
| 8.4429155985269e-06 | 1176077096.915 | 1545798114.633 | 1939698604.321 | 61282052.566 |
| 8.4594462003072e-06 | 1170147124.659 | 1537438186.196 | 1928658440.626 | 60685631.836 |
| 8.47600916777823e-06 | 1164239396.489 | 1529114826.803 | 1917671646.433 | 60095015.704 |
| 8.49260456430963e-06 | 1158353896.709 | 1520827953.892 | 1906738049.466 | 59510147.677 |
| 8.50923245339508e-06 | 1152490608.926 | 1512577484.327 | 1895857477.183 | 58930971.814 |
| 8.52589289865259e-06 | 1146649516.06 | 1504363334.406 | 1885029756.782 | 58357432.714 |
| 8.54258596382473e-06 | 1140830600.35 | 1496185419.87 | 1874254715.217 | 57789475.52 |
| 8.55931171277887e-06 | 1135033843.365 | 1488043655.914 | 1863532179.204 | 57227045.906 |
| 8.57607020950743e-06 | 1129259226.002 | 1479937957.193 | 1852861975.231 | 56670090.075 |
| 8.59286151812811e-06 | 1123506728.504 | 1471868237.835 | 1842243929.571 | 56118554.754 |
| 8.60968570288416e-06 | 1117776330.459 | 1463834411.447 | 1831677868.289 | 55572387.19 |
| 8.62654282814463e-06 | 1112068010.81 | 1455836391.125 | 1821163617.253 | 55031535.14 |
| 8.64343295840456e-06 | 1106381747.862 | 1447874089.464 | 1810701002.144 | 54495946.872 |
| 8.66035615828529e-06 | 1100717519.29 | 1439947418.564 | 1800289848.464 | 53965571.158 |
| 8.6773124925347e-06 | 1095075302.142 | 1432056290.044 | 1789929981.549 | 53440357.265 |
| 8.69430202602741e-06 | 1089455072.852 | 1424200615.044 | 1779621226.573 | 52920254.959 |
| 8.71132482376507e-06 | 1083856807.24 | 1416380304.239 | 1769363408.563 | 52405214.489 |
| 8.72838095087661e-06 | 1078280480.524 | 1408595267.846 | 1759156352.405 | 51895186.594 |
| 8.74547047261846e-06 | 1072726067.324 | 1400845415.632 | 1748999882.854 | 51390122.488 |
| 8.76259345437484e-06 | 1067193541.671 | 1393130656.921 | 1738893824.541 | 50889973.862 |
| 8.77974996165796e-06 | 1061682877.011 | 1385450900.608 | 1728838001.986 | 50394692.877 |
| 8.79694006010832e-06 | 1056194046.214 | 1377806055.16 | 1718832239.605 | 49904232.159 |
| 8.81416381549492e-06 | 1050727021.58 | 1370196028.63 | 1708876361.717 | 49418544.795 |
| 8.83142129371556e-06 | 1045281774.845 | 1362620728.662 | 1698970192.554 | 48937584.328 |
| 8.84871256079703e-06 | 1039858277.188 | 1355080062.503 | 1689113556.273 | 48461304.756 |
| 8.86603768289541e-06 | 1034456499.237 | 1347573937.004 | 1679306276.958 | 47989660.522 |
| 8.88339672629632e-06 | 1029076411.078 | 1340102258.637 | 1669548178.634 | 47522606.512 |
| 8.90078975741515e-06 | 1023717982.258 | 1332664933.496 | 1659839085.271 | 47060098.054 |
| 8.91821684279732e-06 | 1018381181.794 | 1325261867.309 | 1650178820.796 | 46602090.907 |
| 8.93567804911855e-06 | 1013065978.178 | 1317892965.441 | 1640567209.101 | 46148541.263 |
| 8.9531734431851e-06 | 1007772339.384 | 1310558132.911 | 1631004074.047 | 45699405.741 |
| 8.97070309193405e-06 | 1002500232.874 | 1303257274.388 | 1621489239.477 | 45254641.38 |
| 8.98826706243352e-06 | 997249625.607 | 1295990294.209 | 1612022529.22 | 44814205.639 |
| 9.00586542188295e-06 | 992020484.04 | 1288757096.38 | 1602603767.102 | 44378056.389 |
| 9.02349823761334e-06 | 986812774.139 | 1281557584.586 | 1593232776.951 | 43946151.913 |
| 9.04116557708754e-06 | 981626461.382 | 1274391662.2 | 1583909382.608 | 43518450.9 |
| 9.05886750790047e-06 | 976461510.769 | 1267259232.286 | 1574633407.93 | 43094912.438 |
| 9.07660409777941e-06 | 971317886.825 | 1260160197.612 | 1565404676.802 | 42675496.017 |
| 9.09437541458423e-06 | 966195553.605 | 1253094460.653 | 1556223013.143 | 42260161.52 |
| 9.11218152630768e-06 | 961094474.705 | 1246061923.601 | 1547088240.911 | 41848869.219 |
| 9.13002250107562e-06 | 956014613.265 | 1239062488.368 | 1538000184.113 | 41441579.775 |
| 9.14789840714731e-06 | 950955931.972 | 1232096056.6 | 1528958666.813 | 41038254.23 |
| 9.16580931291563e-06 | 945918393.074 | 1225162529.679 | 1519963513.135 | 40638854.005 |
| 9.18375528690741e-06 | 940901958.378 | 1218261808.729 | 1511014547.273 | 40243340.899 |
| 9.20173639778361e-06 | 935906589.26 | 1211393794.629 | 1502111593.499 | 39851677.079 |
| 9.21975271433966e-06 | 930932246.67 | 1204558388.013 | 1493254476.168 | 39463825.084 |
| 9.23780430550565e-06 | 925978891.138 | 1197755489.282 | 1484443019.724 | 39079747.816 |
| 9.25589124034665e-06 | 921046482.782 | 1190984998.607 | 1475677048.708 | 38699408.536 |
| 9.27401358806295e-06 | 916134981.307 | 1184246815.94 | 1466956387.765 | 38322770.866 |
| 9.29217141799034e-06 | 911244346.018 | 1177540841.017 | 1458280861.65 | 37949798.78 |
| 9.31036479960034e-06 | 906374535.825 | 1170866973.365 | 1449650295.235 | 37580456.603 |
| 9.32859380250051e-06 | 901525509.244 | 1164225112.311 | 1441064513.515 | 37214709.008 |
| 9.3468584964347e-06 | 896697224.405 | 1157615156.985 | 1432523341.613 | 36852521.01 |
| 9.3651589512833e-06 | 891889639.061 | 1151037006.331 | 1424026604.789 | 36493857.966 |
| 9.38349523706351e-06 | 887102710.588 | 1144490559.108 | 1415574128.443 | 36138685.571 |
| 9.40186742392966e-06 | 882336395.995 | 1137975713.902 | 1407165738.125 | 35786969.851 |
| 9.42027558217338e-06 | 877590651.926 | 1131492369.126 | 1398801259.538 | 35438677.165 |
| 9.43871978222398e-06 | 872865434.669 | 1125040423.034 | 1390480518.544 | 35093774.198 |
| 9.45720009464863e-06 | 868160700.158 | 1118619773.717 | 1382203341.172 | 34752227.962 |
| 9.47571659015269e-06 | 863476403.983 | 1112230319.121 | 1373969553.622 | 34414005.786 |
| 9.49426933957992e-06 | 858812501.389 | 1105871957.042 | 1365778982.271 | 34079075.319 |
| 9.51285841391283e-06 | 854168947.287 | 1099544585.14 | 1357631453.679 | 33747404.526 |
| 9.53148388427287e-06 | 849545696.256 | 1093248100.941 | 1349526794.596 | 33418961.681 |
| 9.55014582192078e-06 | 844942702.55 | 1086982401.844 | 1341464831.965 | 33093715.37 |
| 9.56884429825678e-06 | 840359920.104 | 1080747385.125 | 1333445392.927 | 32771634.483 |
| 9.58757938482092e-06 | 835797302.536 | 1074542947.946 | 1325468304.832 | 32452688.211 |
| 9.60635115329331e-06 | 831254803.154 | 1068368987.359 | 1317533395.236 | 32136846.049 |
| 9.6251596754944e-06 | 826732374.962 | 1062225400.311 | 1309640491.912 | 31824077.785 |
| 9.64400502338525e-06 | 822229970.665 | 1056112083.652 | 1301789422.857 | 31514353.504 |
| 9.66288726906784e-06 | 817747542.672 | 1050028934.136 | 1293980016.288 | 31207643.579 |
| 9.6818064847853e-06 | 813285043.103 | 1043975848.432 | 1286212100.658 | 30903918.674 |
| 9.70076274292222e-06 | 808842423.794 | 1037952723.126 | 1278485504.653 | 30603149.738 |
| 9.7197561160049e-06 | 804419636.301 | 1031959454.728 | 1270800057.201 | 30305308.002 |
| 9.73878667670164e-06 | 800016631.904 | 1025995939.675 | 1263155587.475 | 30010364.978 |
| 9.75785449782304e-06 | 795633361.615 | 1020062074.338 | 1255551924.899 | 29718292.454 |
| 9.77695965232224e-06 | 791269776.18 | 1014157755.03 | 1247988899.152 | 29429062.492 |
| 9.79610221329523e-06 | 786925826.086 | 1008282878.006 | 1240466340.172 | 29142647.43 |
| 9.8152822539811e-06 | 782601461.564 | 1002437339.469 | 1232984078.164 | 28859019.869 |
| 9.83449984776233e-06 | 778296632.594 | 996621035.58 | 1225541943.599 | 28578152.682 |
| 9.85375506816511e-06 | 774011288.911 | 990833862.458 | 1218139767.222 | 28300019.004 |
| 9.87304798885957e-06 | 769745380.008 | 985075716.185 | 1210777380.058 | 28024592.231 |
| 9.89237868366008e-06 | 765498855.143 | 979346492.816 | 1203454613.412 | 27751846.018 |
| 9.91174722652554e-06 | 761271663.34 | 973646088.377 | 1196171298.876 | 27481754.277 |
| 9.93115369155963e-06 | 757063753.397 | 967974398.875 | 1188927268.332 | 27214291.174 |
| 9.95059815301116e-06 | 752875073.89 | 962331320.301 | 1181722353.958 | 26949431.125 |
| 9.97008068527429e-06 | 748705573.175 | 956716748.634 | 1174556388.231 | 26687148.798 |
| 9.98960136288884e-06 | 744555199.395 | 951130579.846 | 1167429203.929 | 26427419.103 |
| 1.00091602605406e-05 | 740423900.484 | 945572709.908 | 1160340634.139 | 26170217.2 |
| 1.00287574530615e-05 | 736311624.172 | 940043034.794 | 1153290512.258 | 25915518.484 |
| 1.00483930154301e-05 | 732218317.986 | 934541450.484 | 1146278671.999 | 25663298.596 |
| 1.00680670227717e-05 | 728143929.258 | 929067852.969 | 1139304947.39 | 25413533.409 |
| 1.00877795503587e-05 | 724088405.13 | 923622138.259 | 1132369172.785 | 25166199.035 |
| 1.01075306736109e-05 | 720051692.554 | 918204202.38 | 1125471182.861 | 24921271.814 |
| 1.01273204680957e-05 | 716033738.3 | 912813941.387 | 1118610812.628 | 24678728.32 |
| 1.01471490095286e-05 | 712034488.957 | 907451251.361 | 1111787897.425 | 24438545.354 |
| 1.01670163737731e-05 | 708053890.942 | 902116028.419 | 1105002272.93 | 24200699.942 |
| 1.01869226368415e-05 | 704091890.499 | 896808168.712 | 1098253775.161 | 23965169.333 |
| 1.02068678748948e-05 | 700148433.706 | 891527568.436 | 1091542240.48 | 23731931 |
| 1.02268521642431e-05 | 696223466.478 | 886274123.83 | 1084867505.593 | 23500962.633 |
| 1.02468755813459e-05 | 692316934.572 | 881047731.185 | 1078229407.56 | 23272242.14 |
| 1.02669382028125e-05 | 688428783.591 | 875848286.844 | 1071627783.79 | 23045747.643 |
| 1.0287040105402e-05 | 684558958.985 | 870675687.21 | 1065062472.053 | 22821457.479 |
| 1.03071813660241e-05 | 680707406.06 | 865529828.745 | 1058533310.476 | 22599350.194 |
| 1.03273620617389e-05 | 676874069.978 | 860410607.977 | 1052040137.549 | 22379404.543 |
| 1.03475822697572e-05 | 673058895.762 | 855317921.505 | 1045582792.128 | 22161599.488 |
| 1.03678420674413e-05 | 669261828.3 | 850251666 | 1039161113.438 | 21945914.197 |
| 1.03881415323048e-05 | 665482812.35 | 845211738.21 | 1032774941.076 | 21732328.039 |
| 1.04084807420131e-05 | 661721792.542 | 840198034.963 | 1026424115.011 | 21520820.584 |
| 1.04288597743837e-05 | 657978713.38 | 835210453.172 | 1020108475.593 | 21311371.602 |
| 1.04492787073863e-05 | 654253519.252 | 830248889.838 | 1013827863.549 | 21103961.059 |
| 1.04697376191434e-05 | 650546154.426 | 825313242.052 | 1007582119.991 | 20898569.116 |
| 1.04902365879305e-05 | 646856563.061 | 820403407.001 | 1001371086.416 | 20695176.126 |
| 1.05107756921762e-05 | 643184689.204 | 815519281.971 | 995194604.708 | 20493762.637 |
| 1.05313550104629e-05 | 639530476.797 | 810660764.347 | 989052517.143 | 20294309.382 |
| 1.05519746215265e-05 | 635893869.681 | 805827751.622 | 982944666.39 | 20096797.283 |
| 1.05726346042575e-05 | 632274811.6 | 801020141.396 | 976870895.513 | 19901207.448 |
| 1.05933350377004e-05 | 628673246.199 | 796237831.382 | 970831047.973 | 19707521.17 |
| 1.06140760010548e-05 | 625089117.036 | 791480719.407 | 964824967.636 | 19515719.922 |
| 1.06348575736753e-05 | 621522367.578 | 786748703.416 | 958852498.765 | 19325785.358 |
| 1.06556798350717e-05 | 617972941.208 | 782041681.477 | 952913486.032 | 19137699.311 |
| 1.06765428649097e-05 | 614440781.23 | 777359551.781 | 947007774.516 | 18951443.791 |
| 1.06974467430109e-05 | 610925830.868 | 772702212.648 | 941135209.704 | 18767000.981 |
| 1.07183915493531e-05 | 607428033.271 | 768069562.527 | 935295637.496 | 18584353.241 |
| 1.07393773640708e-05 | 603947331.518 | 763461500.003 | 929488904.205 | 18403483.099 |
| 1.07604042674553e-05 | 600483668.619 | 758877923.796 | 923714856.56 | 18224373.256 |
| 1.07814723399552e-05 | 597036987.519 | 754318732.767 | 917973341.709 | 18047006.579 |
| 1.08025816621765e-05 | 593607231.104 | 749783825.918 | 912264207.218 | 17871366.104 |
| 1.08237323148832e-05 | 590194342.198 | 745273102.398 | 906587301.077 | 17697435.03 |
| 1.08449243789973e-05 | 586798263.571 | 740786461.504 | 900942471.698 | 17525196.721 |
| 1.08661579355993e-05 | 583418937.94 | 736323802.683 | 895329567.919 | 17354634.702 |
| 1.08874330659282e-05 | 580056307.975 | 731885025.536 | 889748439.006 | 17185732.658 |
| 1.09087498513825e-05 | 576710316.297 | 727470029.823 | 884198934.653 | 17018474.435 |
| 1.09301083735198e-05 | 573380905.485 | 723078715.459 | 878680904.985 | 16852844.034 |
| 1.09515087140573e-05 | 570068018.078 | 718710982.524 | 873194200.561 | 16688825.612 |
| 1.09729509548724e-05 | 566771596.578 | 714366731.261 | 867738672.372 | 16526403.481 |
| 1.09944351780028e-05 | 563491583.451 | 710045862.081 | 862314171.847 | 16365562.106 |
| 1.10159614656467e-05 | 560227921.133 | 705748275.564 | 856920550.851 | 16206286.101 |
| 1.10375299001633e-05 | 556980552.031 | 701473872.46 | 851557661.687 | 16048560.232 |
| 1.1059140564073e-05 | 553749418.525 | 697222553.697 | 846225357.101 | 15892369.413 |
| 1.10807935400578e-05 | 550534462.975 | 692994220.377 | 840923490.278 | 15737698.703 |
| 1.11024889109617e-05 | 547335627.716 | 688788773.782 | 835651914.848 | 15584533.308 |
| 1.11242267597908e-05 | 544152855.071 | 684606115.377 | 830410484.884 | 15432858.579 |
| 1.11460071697136e-05 | 540986087.344 | 680446146.809 | 825199054.908 | 15282660.007 |
| 1.11678302240617e-05 | 537835266.829 | 676308769.911 | 820017479.884 | 15133923.226 |
| 1.11896960063296e-05 | 534700335.808 | 672193886.706 | 814865615.23 | 14986634.009 |
| 1.12116046001755e-05 | 531581236.561 | 668101399.406 | 809743316.811 | 14840778.268 |
| 1.12335560894212e-05 | 528477911.358 | 664031210.417 | 804650440.941 | 14696342.051 |
| 1.12555505580528e-05 | 525390302.472 | 659983222.339 | 799586844.39 | 14553311.544 |
| 1.12775880902207e-05 | 522318352.174 | 655957337.969 | 794552384.379 | 14411673.065 |
| 1.129966877024e-05 | 519262002.74 | 651953460.303 | 789546918.582 | 14271413.067 |
| 1.13217926825912e-05 | 516221196.451 | 647971492.539 | 784570305.132 | 14132518.134 |
| 1.13439599119199e-05 | 513195875.597 | 644011338.077 | 779622402.613 | 13994974.98 |
| 1.13661705430374e-05 | 510185982.478 | 640072900.523 | 774703070.071 | 13858770.45 |
| 1.13884246609214e-05 | 507191459.408 | 636156083.688 | 769812167.008 | 13723891.515 |
| 1.14107223507156e-05 | 504212248.717 | 632260791.595 | 764949553.386 | 13590325.274 |
| 1.14330636977306e-05 | 501248292.751 | 628386928.476 | 760115089.625 | 13458058.951 |
| 1.1455448787444e-05 | 498299533.878 | 624534398.775 | 755308636.608 | 13327079.896 |
| 1.14778777055008e-05 | 495365914.489 | 620703107.151 | 750530055.678 | 13197375.58 |
| 1.15003505377136e-05 | 492447376.998 | 616892958.48 | 745779208.643 | 13068933.596 |
| 1.15228673700631e-05 | 489543863.847 | 613103857.855 | 741055957.771 | 12941741.66 |
| 1.15454282886982e-05 | 486655317.509 | 609335710.589 | 736360165.796 | 12815787.605 |
| 1.15680333799367e-05 | 483781680.486 | 605588422.217 | 731691695.916 | 12691059.384 |
| 1.15906827302652e-05 | 480922895.314 | 601861898.496 | 727050411.793 | 12567545.067 |
| 1.16133764263397e-05 | 478078904.568 | 598156045.408 | 722436177.557 | 12445232.838 |
| 1.16361145549859e-05 | 475249650.857 | 594470769.162 | 717848857.803 | 12324111 |
| 1.16588972031995e-05 | 472435076.832 | 590805976.193 | 713288317.593 | 12204167.967 |
| 1.16817244581465e-05 | 469635125.187 | 587161573.168 | 708754422.458 | 12085392.265 |
| 1.17045964071636e-05 | 466849738.659 | 583537466.983 | 704247038.395 | 11967772.535 |
| 1.17275131377584e-05 | 464078860.031 | 579933564.766 | 699766031.872 | 11851297.526 |
| 1.17504747376099e-05 | 461322432.135 | 576349773.881 | 695311269.823 | 11735956.097 |
| 1.17734812945688e-05 | 458580397.853 | 572786001.926 | 690882619.653 | 11621737.215 |
| 1.17965328966578e-05 | 455852700.121 | 569242156.734 | 686479949.239 | 11508629.956 |
| 1.18196296320719e-05 | 453139281.926 | 565718146.38 | 682103126.923 | 11396623.501 |
| 1.18427715891788e-05 | 450440086.312 | 562213879.175 | 677752021.523 | 11285707.136 |
| 1.18659588565192e-05 | 447755056.384 | 558729263.671 | 673426502.324 | 11175870.252 |
| 1.18891915228073e-05 | 445084135.302 | 555264208.665 | 669126439.084 | 11067102.344 |
| 1.19124696769306e-05 | 442427266.291 | 551818623.193 | 664851702.031 | 10959393.006 |
| 1.19357934079512e-05 | 439784392.639 | 548392416.539 | 660602161.867 | 10852731.938 |
| 1.19591628051051e-05 | 437155457.697 | 544985498.231 | 656377689.764 | 10747108.937 |
| 1.19825779578032e-05 | 434540404.887 | 541597778.044 | 652178157.365 | 10642513.9 |
| 1.20060389556315e-05 | 431939177.696 | 538229166.003 | 648003436.788 | 10538936.823 |
| 1.20295458883514e-05 | 429351719.683 | 534879572.378 | 643853400.622 | 10436367.797 |
| 1.20530988459e-05 | 426777974.48 | 531548907.695 | 639727921.927 | 10334797.014 |
| 1.20766979183904e-05 | 424217885.792 | 528237082.726 | 635626874.238 | 10234214.756 |
| 1.21003431961123e-05 | 421671397.4 | 524944008.498 | 631550131.561 | 10134611.405 |
| 1.21240347695321e-05 | 419138453.16 | 521669596.293 | 627497568.375 | 10035977.431 |
| 1.21477727292934e-05 | 416618997.01 | 518413757.646 | 623469059.631 | 9938303.402 |
| 1.21715571662171e-05 | 414112972.967 | 515176404.346 | 619464480.754 | 9841579.975 |
| 1.21953881713021e-05 | 411620325.13 | 511957448.44 | 615483707.641 | 9745797.897 |
| 1.22192658357254e-05 | 409140997.681 | 508756802.234 | 611526616.661 | 9650948.008 |
| 1.22431902508425e-05 | 406674934.887 | 505574378.29 | 607593084.656 | 9557021.235 |
| 1.22671615081879e-05 | 404222081.102 | 502410089.43 | 603682988.94 | 9464008.593 |
| 1.2291179699475e-05 | 401782380.769 | 499263848.737 | 599796207.3 | 9371901.187 |
| 1.23152449165971e-05 | 399355778.419 | 496135569.553 | 595932617.994 | 9280690.206 |
| 1.23393572516272e-05 | 396942218.673 | 493025165.484 | 592092099.753 | 9190366.925 |
| 1.23635167968188e-05 | 394541646.248 | 489932550.396 | 588274531.779 | 9100922.706 |
| 1.23877236446059e-05 | 392154005.95 | 486857638.423 | 584479793.746 | 9012348.992 |
| 1.24119778876033e-05 | 389779242.685 | 483800343.957 | 580707765.799 | 8924637.312 |
| 1.24362796186074e-05 | 387417301.451 | 480760581.66 | 576958328.554 | 8837779.277 |
| 1.24606289305962e-05 | 385068127.346 | 477738266.458 | 573231363.099 | 8751766.577 |
| 1.24850259167297e-05 | 382731665.569 | 474733313.542 | 569526750.991 | 8666590.987 |
| 1.25094706703504e-05 | 380407861.415 | 471745638.371 | 565844374.258 | 8582244.358 |
| 1.25339632849834e-05 | 378096660.286 | 468775156.672 | 562184115.398 | 8498718.624 |
| 1.25585038543371e-05 | 375798007.682 | 465821784.441 | 558545857.378 | 8416005.794 |
| 1.25830924723032e-05 | 373511849.21 | 462885437.94 | 554929483.635 | 8334097.958 |
| 1.26077292329574e-05 | 371238130.583 | 459966033.704 | 551334878.075 | 8252987.281 |
| 1.26324142305594e-05 | 368976797.619 | 457063488.536 | 547761925.07 | 8172666.004 |
| 1.26571475595537e-05 | 366727796.244 | 454177719.509 | 544210509.464 | 8093126.445 |
| 1.26819293145694e-05 | 364491072.495 | 451308643.97 | 540680516.566 | 8014360.996 |
| 1.27067595904212e-05 | 362266572.517 | 448456179.535 | 537171832.152 | 7936362.123 |
| 1.27316384821093e-05 | 360054242.567 | 445620244.094 | 533684342.466 | 7859122.366 |
| 1.27565660848198e-05 | 357854029.016 | 442800755.807 | 530217934.217 | 7782634.335 |
| 1.27815424939253e-05 | 355665878.346 | 439997633.11 | 526772494.581 | 7706890.716 |
| 1.28065678049852e-05 | 353489737.155 | 437210794.712 | 523347911.198 | 7631884.263 |
| 1.28316421137457e-05 | 351325552.156 | 434440159.594 | 519944072.173 | 7557607.802 |
| 1.28567655161408e-05 | 349173270.181 | 431685647.014 | 516560866.075 | 7484054.229 |
| 1.28819381082921e-05 | 347032838.177 | 428947176.503 | 513198181.938 | 7411216.507 |
| 1.29071599865096e-05 | 344904203.21 | 426224667.868 | 509855909.257 | 7339087.67 |
| 1.29324312472917e-05 | 342787312.469 | 423518041.19 | 506533937.989 | 7267660.819 |
| 1.29577519873258e-05 | 340682113.259 | 420827216.829 | 503232158.555 | 7196929.123 |
| 1.29831223034886e-05 | 338588553.009 | 418152115.417 | 499950461.836 | 7126885.814 |
| 1.30085422928464e-05 | 336506579.273 | 415492657.866 | 496688739.173 | 7057524.194 |
| 1.30340120526558e-05 | 334436139.724 | 412848765.363 | 493446882.367 | 6988837.628 |
| 1.30595316803635e-05 | 332377182.163 | 410220359.371 | 490224783.679 | 6920819.547 |
| 1.30851012736072e-05 | 330329654.515 | 407607361.633 | 487022335.827 | 6853463.444 |
| 1.31107209302157e-05 | 328293504.831 | 405009694.168 | 483839431.989 | 6786762.876 |
| 1.31363907482094e-05 | 326268681.29 | 402427279.27 | 480675965.797 | 6720711.465 |
| 1.31621108258005e-05 | 324255132.198 | 399860039.517 | 477531831.342 | 6655302.891 |
| 1.31878812613935e-05 | 322252805.99 | 397307897.758 | 474406923.169 | 6590530.9 |
| 1.32137021535858e-05 | 320261651.231 | 394770777.126 | 471301136.28 | 6526389.294 |
| 1.32395736011675e-05 | 318281616.616 | 392248601.03 | 468214366.127 | 6462871.939 |
| 1.32654957031224e-05 | 316312650.972 | 389741293.156 | 465146508.62 | 6399972.76 |
| 1.3291468558628e-05 | 314354703.257 | 387248777.472 | 462097460.119 | 6337685.74 |
| 1.3317492267056e-05 | 312407722.562 | 384770978.221 | 459067117.435 | 6276004.922 |
| 1.33435669279726e-05 | 310471658.112 | 382307819.929 | 456055377.832 | 6214924.405 |
| 1.3369692641139e-05 | 308546459.264 | 379859227.396 | 453062139.022 | 6154438.348 |
| 1.33958695065117e-05 | 306632075.513 | 377425125.706 | 450087299.168 | 6094540.964 |
| 1.34220976242429e-05 | 304728456.488 | 375005440.219 | 447130756.881 | 6035226.525 |
| 1.3448377094681e-05 | 302835551.953 | 372600096.574 | 444192411.218 | 5976489.357 |
| 1.34747080183707e-05 | 300953311.81 | 370209020.691 | 441272161.685 | 5918323.842 |
| 1.35010904960536e-05 | 299081686.1 | 367832138.766 | 438369908.231 | 5860724.416 |
| 1.35275246286688e-05 | 297220625 | 365469377.278 | 435485551.253 | 5803685.571 |
| 1.35540105173526e-05 | 295370078.827 | 363120662.982 | 432618991.59 | 5747201.849 |
| 1.35805482634397e-05 | 293529998.036 | 360785922.913 | 429770130.523 | 5691267.849 |
| 1.3607137968463e-05 | 291700333.224 | 358465084.386 | 426938869.778 | 5635878.221 |
| 1.36337797341541e-05 | 289881035.127 | 356158074.992 | 424125111.521 | 5581027.666 |
| 1.36604736624441e-05 | 288072054.623 | 353864822.604 | 421328758.357 | 5526710.937 |
| 1.36872198554634e-05 | 286273342.73 | 351585255.373 | 418549713.331 | 5472922.841 |
| 1.37140184155426e-05 | 284484850.612 | 349319301.727 | 415787879.928 | 5419658.231 |
| 1.37408694452123e-05 | 282706529.571 | 347066890.375 | 413043162.067 | 5366912.012 |
| 1.37677730472042e-05 | 280938331.056 | 344827950.302 | 410315464.107 | 5314679.141 |
| 1.37947293244509e-05 | 279180206.658 | 342602410.774 | 407604690.84 | 5262954.62 |
| 1.38217383800868e-05 | 277432108.112 | 340390201.332 | 404910747.493 | 5211733.502 |
| 1.38488003174479e-05 | 275693987.299 | 338191251.798 | 402233539.726 | 5161010.888 |
| 1.38759152400728e-05 | 273965796.245 | 336005492.269 | 399572973.632 | 5110781.926 |
| 1.39030832517027e-05 | 272247487.12 | 333832853.123 | 396928955.735 | 5061041.812 |
| 1.39303044562818e-05 | 270539012.241 | 331673265.012 | 394301392.989 | 5011785.788 |
| 1.39575789579582e-05 | 268840324.073 | 329526658.868 | 391690192.778 | 4963009.143 |
| 1.39849068610834e-05 | 267151375.227 | 327392965.898 | 389095262.913 | 4914707.211 |
| 1.40122882702136e-05 | 265472118.459 | 325272117.587 | 386516511.634 | 4866875.372 |
| 1.40397232901096e-05 | 263802506.676 | 323164045.696 | 383953847.604 | 4819509.051 |
| 1.40672120257372e-05 | 262142492.931 | 321068682.263 | 381407179.914 | 4772603.718 |
| 1.40947545822679e-05 | 260492030.427 | 318985959.602 | 378876418.078 | 4726154.885 |
| 1.41223510650791e-05 | 258851072.515 | 316915810.303 | 376361472.032 | 4680158.111 |
| 1.41500015797542e-05 | 257219572.695 | 314858167.229 | 373862252.133 | 4634608.995 |
| 1.41777062320838e-05 | 255597484.616 | 312812963.521 | 371378669.162 | 4589503.18 |
| 1.42054651280654e-05 | 253984762.079 | 310780132.596 | 368910634.316 | 4544836.353 |
| 1.4233278373904e-05 | 252381359.031 | 308759608.142 | 366458059.211 | 4500604.241 |
| 1.42611460760125e-05 | 250787229.574 | 306751324.124 | 364020855.883 | 4456802.613 |
| 1.42890683410123e-05 | 249202327.959 | 304755214.779 | 361598936.779 | 4413427.28 |
| 1.43170452757335e-05 | 247626608.586 | 302771214.621 | 359192214.767 | 4370474.092 |
| 1.43450769872154e-05 | 246060026.009 | 300799258.433 | 356800603.123 | 4327938.941 |
| 1.43731635827067e-05 | 244502534.932 | 298839281.275 | 354424015.541 | 4285817.759 |
| 1.44013051696663e-05 | 242954090.212 | 296891218.477 | 352062366.122 | 4244106.516 |
| 1.44295018557635e-05 | 241414646.855 | 294955005.642 | 349715569.381 | 4202801.224 |
| 1.44577537488781e-05 | 239884160.024 | 293030578.645 | 347383540.239 | 4161897.93 |
| 1.44860609571016e-05 | 238362585.03 | 291117873.632 | 345066194.028 | 4121392.724 |
| 1.45144235887366e-05 | 236849877.339 | 289216827.02 | 342763446.485 | 4081281.73 |
| 1.45428417522982e-05 | 235345992.57 | 287327375.498 | 340475213.752 | 4041561.111 |
| 1.45713155565138e-05 | 233850886.493 | 285449456.025 | 338201412.379 | 4002227.069 |
| 1.45998451103236e-05 | 232364515.033 | 283583005.827 | 335941959.315 | 3963275.841 |
| 1.46284305228812e-05 | 230886834.268 | 281727962.403 | 333696771.913 | 3924703.702 |
| 1.46570719035539e-05 | 229417800.428 | 279884263.52 | 331465767.928 | 3886506.962 |
| 1.4685769361923e-05 | 227957369.9 | 278051847.212 | 329248865.513 | 3848681.967 |
| 1.47145230077846e-05 | 226505499.222 | 276230651.782 | 327045983.221 | 3811225.1 |
| 1.47433329511495e-05 | 225062145.087 | 274420615.802 | 324857040 | 3774132.777 |
| 1.47721993022442e-05 | 223627264.341 | 272621678.108 | 322681955.196 | 3737401.451 |
| 1.48011221715107e-05 | 222200813.986 | 270833777.806 | 320520648.549 | 3701027.609 |
| 1.48301016696075e-05 | 220782751.177 | 269056854.267 | 318373040.193 | 3665007.772 |
| 1.48591379074096e-05 | 219373033.223 | 267290847.126 | 316239050.655 | 3629338.493 |
| 1.48882309960091e-05 | 217971617.589 | 265535696.285 | 314118600.851 | 3594016.362 |
| 1.49173810467156e-05 | 216578461.893 | 263791341.911 | 312011612.089 | 3559037.999 |
| 1.49465881710568e-05 | 215193523.908 | 262057724.433 | 309918006.065 | 3524400.059 |
| 1.49758524807785e-05 | 213816761.563 | 260334784.547 | 307837704.862 | 3490099.229 |
| 1.50051740878455e-05 | 212448132.94 | 258622463.21 | 305770630.95 | 3456132.228 |
| 1.50345531044418e-05 | 211087596.276 | 256920701.641 | 303716707.182 | 3422495.808 |
| 1.5063989642971e-05 | 209735109.964 | 255229441.322 | 301675856.797 | 3389186.75 |
| 1.50934838160566e-05 | 208390632.55 | 253548623.997 | 299648003.416 | 3356201.868 |
| 1.5123035736543e-05 | 207054122.737 | 251878191.671 | 297633071.039 | 3323538.008 |
| 1.51526455174951e-05 | 205725539.381 | 250218086.608 | 295630984.049 | 3291192.046 |
| 1.51823132721996e-05 | 204404841.495 | 248568251.333 | 293641667.204 | 3259160.887 |
| 1.52120391141647e-05 | 203091988.243 | 246928628.631 | 291665045.644 | 3227441.468 |
| 1.5241823157121e-05 | 201786938.949 | 245299161.544 | 289701044.881 | 3196030.754 |
| 1.52716655150216e-05 | 200489653.087 | 243679793.374 | 287749590.803 | 3164925.742 |
| 1.53015663020429e-05 | 199200090.289 | 242070467.678 | 285810609.672 | 3134123.456 |
| 1.53315256325848e-05 | 197918210.341 | 240471128.274 | 283884028.122 | 3103620.95 |
| 1.53615436212712e-05 | 196643973.184 | 238881719.232 | 281969773.159 | 3073415.305 |
| 1.53916203829504e-05 | 195377338.912 | 237302184.881 | 280067772.155 | 3043503.634 |
| 1.54217560326954e-05 | 194118267.775 | 235732469.804 | 278177952.856 | 3013883.075 |
| 1.54519506858048e-05 | 192866720.179 | 234172518.838 | 276300243.37 | 2984550.795 |
| 1.54822044578027e-05 | 191622656.681 | 232622277.076 | 274434572.175 | 2955503.988 |
| 1.55125174644396e-05 | 190386037.996 | 231081689.861 | 272580868.109 | 2926739.875 |
| 1.55428898216925e-05 | 189156824.991 | 229550702.793 | 270739060.377 | 2898255.707 |
| 1.55733216457655e-05 | 187934978.689 | 228029261.721 | 268909078.545 | 2870048.757 |
| 1.56038130530902e-05 | 186720460.266 | 226517312.746 | 267090852.539 | 2842116.328 |
| 1.56343641603262e-05 | 185513231.052 | 225014802.221 | 265284312.644 | 2814455.748 |
| 1.56649750843614e-05 | 184313252.532 | 223521676.748 | 263489389.505 | 2787064.372 |
| 1.56956459423128e-05 | 183120486.344 | 222037883.179 | 261706014.121 | 2759939.579 |
| 1.57263768515265e-05 | 181934894.28 | 220563368.616 | 259934117.849 | 2733078.776 |
| 1.57571679295783e-05 | 180756438.286 | 219098080.407 | 258173632.4 | 2706479.392 |
| 1.57880192942745e-05 | 179585080.461 | 217641966.149 | 256424489.835 | 2680138.884 |
| 1.58189310636517e-05 | 178420783.057 | 216194973.686 | 254686622.569 | 2654054.731 |
| 1.58499033559779e-05 | 177263508.482 | 214757051.108 | 252959963.369 | 2628224.44 |
| 1.58809362897526e-05 | 176113219.292 | 213328146.751 | 251244445.346 | 2602645.539 |
| 1.59120299837071e-05 | 174969878.201 | 211908209.195 | 249540001.963 | 2577315.582 |
| 1.59431845568053e-05 | 173833448.073 | 210497187.266 | 247846567.027 | 2552232.146 |
| 1.59744001282442e-05 | 172703891.925 | 209095030.032 | 246164074.692 | 2527392.832 |
| 1.60056768174539e-05 | 171581172.927 | 207701686.805 | 244492459.454 | 2502795.264 |
| 1.60370147440986e-05 | 170465254.4 | 206317107.137 | 242831656.152 | 2478437.089 |
| 1.60684140280765e-05 | 169356099.82 | 204941240.825 | 241181599.966 | 2454315.977 |
| 1.60998747895207e-05 | 168253672.812 | 203574037.904 | 239542226.416 | 2430429.62 |
| 1.61313971487996e-05 | 167157937.153 | 202215448.651 | 237913471.361 | 2406775.736 |
| 1.61629812265171e-05 | 166068856.773 | 200865423.581 | 236295270.997 | 2383352.06 |
| 1.61946271435135e-05 | 164986395.752 | 199523913.449 | 234687561.856 | 2360156.352 |
| 1.62263350208653e-05 | 163910518.323 | 198190869.247 | 233090280.803 | 2337186.394 |
| 1.62581049798863e-05 | 162841188.866 | 196866242.204 | 231503365.038 | 2314439.989 |
| 1.6289937142128e-05 | 161778371.917 | 195549983.788 | 229926752.093 | 2291914.96 |
| 1.63218316293795e-05 | 160722032.158 | 194242045.7 | 228360379.831 | 2269609.154 |
| 1.63537885636685e-05 | 159672134.424 | 192942379.879 | 226804186.443 | 2247520.436 |
| 1.63858080672619e-05 | 158628643.698 | 191650938.496 | 225258110.449 | 2225646.695 |
| 1.64178902626655e-05 | 157591525.114 | 190367673.957 | 223722090.695 | 2203985.837 |
| 1.64500352726253e-05 | 156560743.956 | 189092538.901 | 222196066.354 | 2182535.791 |
| 1.64822432201276e-05 | 155536265.655 | 187825486.198 | 220679976.922 | 2161294.505 |
| 1.65145142283994e-05 | 154518055.795 | 186566468.953 | 219173762.218 | 2140259.948 |
| 1.65468484209089e-05 | 153506080.105 | 185315440.497 | 217677362.383 | 2119430.107 |
| 1.65792459213663e-05 | 152500304.465 | 184072354.396 | 216190717.879 | 2098802.99 |
| 1.66117068537238e-05 | 151500694.901 | 182837164.442 | 214713769.484 | 2078376.625 |
| 1.66442313421763e-05 | 150507217.59 | 181609824.658 | 213246458.298 | 2058149.056 |
| 1.6676819511162e-05 | 149519838.854 | 180390289.291 | 211788725.733 | 2038118.351 |
| 1.67094714853626e-05 | 148538525.165 | 179178512.821 | 210340513.52 | 2018282.591 |
| 1.6742187389704e-05 | 147563243.139 | 177974449.949 | 208901763.701 | 1998639.882 |
| 1.67749673493566e-05 | 146593959.542 | 176778055.606 | 207472418.632 | 1979188.342 |
| 1.68078114897361e-05 | 145630641.285 | 175589284.944 | 206052420.98 | 1959926.113 |
| 1.68407199365034e-05 | 144673255.427 | 174408093.343 | 204641713.722 | 1940851.351 |
| 1.68736928155657e-05 | 143721769.171 | 173234436.404 | 203240240.142 | 1921962.232 |
| 1.69067302530767e-05 | 142776149.867 | 172068269.951 | 201847943.834 | 1903256.949 |
| 1.69398323754371e-05 | 141836365.011 | 170909550.031 | 200464768.697 | 1884733.714 |
| 1.69729993092949e-05 | 140902382.242 | 169758232.911 | 199090658.933 | 1866390.753 |
| 1.70062311815462e-05 | 139974169.346 | 168614275.079 | 197725559.051 | 1848226.314 |
| 1.70395281193357e-05 | 139051694.254 | 167477633.244 | 196369413.86 | 1830238.658 |
| 1.70728902500567e-05 | 138134925.039 | 166348264.331 | 195022168.469 | 1812426.064 |
| 1.71063177013523e-05 | 137223829.92 | 165226125.485 | 193683768.288 | 1794786.83 |
| 1.71398106011152e-05 | 136318377.258 | 164111174.07 | 192354159.027 | 1777319.268 |
| 1.71733690774888e-05 | 135418535.559 | 163003367.663 | 191033286.69 | 1760021.707 |
| 1.7206993258867e-05 | 134524273.471 | 161902664.06 | 189721097.579 | 1742892.492 |
| 1.72406832738955e-05 | 133635559.785 | 160809021.27 | 188417538.289 | 1725929.986 |
| 1.72744392514716e-05 | 132752363.434 | 159722397.519 | 187122555.709 | 1709132.565 |
| 1.73082613207451e-05 | 131874653.494 | 158642751.243 | 185836097.021 | 1692498.623 |
| 1.73421496111187e-05 | 131002399.182 | 157570041.095 | 184558109.696 | 1676026.569 |
| 1.73761042522483e-05 | 130135569.855 | 156504225.936 | 183288541.496 | 1659714.828 |
| 1.74101253740439e-05 | 129274135.013 | 155445264.842 | 182027340.47 | 1643561.839 |
| 1.74442131066695e-05 | 128418064.297 | 154393117.097 | 180774454.955 | 1627566.057 |
| 1.74783675805443e-05 | 127567327.487 | 153347742.196 | 179529833.573 | 1611725.952 |
| 1.75125889263427e-05 | 126721894.503 | 152309099.842 | 178293425.232 | 1596040.009 |
| 1.75468772749949e-05 | 125881735.404 | 151277149.948 | 177065179.12 | 1580506.728 |
| 1.75812327576875e-05 | 125046820.392 | 150251852.633 | 175845044.709 | 1565124.623 |
| 1.76156555058641e-05 | 124217119.802 | 149233168.223 | 174632971.753 | 1549892.223 |
| 1.76501456512254e-05 | 123392604.114 | 148221057.25 | 173428910.283 | 1534808.07 |
| 1.76847033257301e-05 | 122573243.94 | 147215480.452 | 172232810.61 | 1519870.722 |
| 1.77193286615952e-05 | 121759010.035 | 146216398.77 | 171044623.32 | 1505078.75 |
| 1.77540217912968e-05 | 120949873.289 | 145223773.35 | 169864299.278 | 1490430.739 |
| 1.778878284757e-05 | 120145804.728 | 144237565.539 | 168691789.619 | 1475925.288 |
| 1.78236119634102e-05 | 119346775.518 | 143257736.889 | 167527045.755 | 1461561.01 |
| 1.78585092720727e-05 | 118552756.959 | 142284249.151 | 166370019.369 | 1447336.531 |
| 1.78934749070742e-05 | 117763720.487 | 141317064.278 | 165220662.414 | 1433250.49 |
| 1.79285090021925e-05 | 116979637.675 | 140356144.421 | 164078927.113 | 1419301.54 |
| 1.79636116914674e-05 | 116200480.23 | 139401451.931 | 162944765.958 | 1405488.346 |
| 1.79987831092013e-05 | 115426219.994 | 138452949.358 | 161818131.707 | 1391809.588 |
| 1.80340233899593e-05 | 114656828.945 | 137510599.448 | 160698977.385 | 1378263.956 |
| 1.80693326685701e-05 | 113892279.194 | 136574365.146 | 159587256.28 | 1364850.156 |
| 1.81047110801264e-05 | 113132542.984 | 135644209.59 | 158482921.946 | 1351566.905 |
| 1.81401587599854e-05 | 112377592.695 | 134720096.116 | 157385928.197 | 1338412.931 |
| 1.81756758437692e-05 | 111627400.838 | 133801988.251 | 156296229.109 | 1325386.976 |
| 1.82112624673656e-05 | 110881940.055 | 132889849.72 | 155213779.019 | 1312487.796 |
| 1.82469187669284e-05 | 110141183.123 | 131983644.437 | 154138532.52 | 1299714.155 |
| 1.82826448788779e-05 | 109405102.949 | 131083336.511 | 153070444.464 | 1287064.832 |
| 1.83184409399017e-05 | 108673672.572 | 130188890.239 | 152009469.959 | 1274538.617 |
| 1.83543070869548e-05 | 107946865.163 | 129300270.113 | 150955564.369 | 1262134.313 |
| 1.83902434572604e-05 | 107224654.022 | 128417440.81 | 149908683.311 | 1249850.731 |
| 1.84262501883105e-05 | 106507012.58 | 127540367.199 | 148868782.653 | 1237686.699 |
| 1.84623274178661e-05 | 105793914.397 | 126669014.338 | 147835818.518 | 1225641.051 |
| 1.84984752839582e-05 | 105085333.163 | 125803347.469 | 146809747.278 | 1213712.637 |
| 1.85346939248878e-05 | 104381242.698 | 124943332.024 | 145790525.551 | 1201900.314 |
| 1.85709834792267e-05 | 103681616.948 | 124088933.62 | 144778110.208 | 1190202.954 |
| 1.86073440858183e-05 | 102986429.991 | 123240118.058 | 143772458.363 | 1178619.436 |
| 1.86437758837774e-05 | 102295656.029 | 122396851.325 | 142773527.377 | 1167148.654 |
| 1.86802790124916e-05 | 101609269.394 | 121559099.592 | 141781274.856 | 1155789.51 |
| 1.87168536116211e-05 | 100927244.543 | 120726829.21 | 140795658.648 | 1144540.918 |
| 1.87534998210997e-05 | 100249556.061 | 119900006.716 | 139816636.845 | 1133401.801 |
| 1.87902177811351e-05 | 99576178.66 | 119078598.825 | 138844167.777 | 1122371.095 |
| 1.88270076322097e-05 | 98907087.174 | 118262572.435 | 137878210.016 | 1111447.744 |
| 1.88638695150807e-05 | 98242256.567 | 117451894.623 | 136918722.373 | 1100630.703 |
| 1.8900803570781e-05 | 97581661.925 | 116646532.645 | 135965663.894 | 1089918.937 |
| 1.89378099406197e-05 | 96925278.458 | 115846453.935 | 135018993.865 | 1079311.423 |
| 1.89748887661826e-05 | 96273081.504 | 115051626.106 | 134078671.804 | 1068807.145 |
| 1.90120401893324e-05 | 95625046.519 | 114262016.947 | 133144657.465 | 1058405.099 |
| 1.90492643522099e-05 | 94981149.088 | 113477594.422 | 132216910.833 | 1048104.29 |
| 1.90865613972341e-05 | 94341364.914 | 112698326.672 | 131295392.127 | 1037903.732 |
| 1.91239314671029e-05 | 93705669.826 | 111924182.012 | 130380061.795 | 1027802.45 |
| 1.91613747047934e-05 | 93074039.773 | 111155128.93 | 129470880.517 | 1017799.477 |
| 1.91988912535628e-05 | 92446450.827 | 110391136.089 | 128567809.197 | 1007893.858 |
| 1.92364812569487e-05 | 91822879.178 | 109632172.323 | 127670808.972 | 998084.643 |
| 1.92741448587699e-05 | 91203301.142 | 108878206.637 | 126779841.199 | 988370.896 |
| 1.93118822031266e-05 | 90587693.15 | 108129208.208 | 125894867.466 | 978751.687 |
| 1.93496934344012e-05 | 89976031.757 | 107385146.383 | 125015849.581 | 969226.095 |
| 1.93875786972588e-05 | 89368293.635 | 106645990.677 | 124142749.576 | 959793.21 |
| 1.94255381366478e-05 | 88764455.577 | 105911710.777 | 123275529.705 | 950452.13 |
| 1.94635718978002e-05 | 88164494.491 | 105182276.533 | 122414152.443 | 941201.961 |
| 1.95016801262327e-05 | 87568387.408 | 104457657.966 | 121558580.484 | 932041.818 |
| 1.95398629677466e-05 | 86976111.474 | 103737825.262 | 120708776.74 | 922970.825 |
| 1.95781205684287e-05 | 86387643.952 | 103022748.773 | 119864704.342 | 913988.115 |
| 1.9616453074652e-05 | 85802962.223 | 102312399.015 | 119026326.635 | 905092.828 |
| 1.9654860633076e-05 | 85222043.786 | 101606746.669 | 118193607.182 | 896284.113 |
| 1.96933433906472e-05 | 84644866.252 | 100905762.579 | 117366509.758 | 887561.128 |
| 1.97319014946001e-05 | 84071407.352 | 100209417.752 | 116544998.352 | 878923.038 |
| 1.97705350924572e-05 | 83501644.929 | 99517683.358 | 115729037.165 | 870369.018 |
| 1.98092443320301e-05 | 82935556.943 | 98830530.727 | 114918590.608 | 861898.249 |
| 1.98480293614195e-05 | 82373121.467 | 98147931.348 | 114113623.304 | 853509.92 |
| 1.98868903290164e-05 | 81814316.688 | 97469856.874 | 113314100.082 | 845203.23 |
| 1.9925827383502e-05 | 81259120.909 | 96796279.113 | 112519985.98 | 836977.384 |
| 1.99648406738489e-05 | 80707512.541 | 96127170.034 | 111731246.245 | 828831.595 |
| 2.00039303493212e-05 | 80159470.113 | 95462501.761 | 110947846.325 | 820765.085 |
| 2.00430965594753e-05 | 79614972.264 | 94802246.579 | 110169751.877 | 812777.08 |
| 2.00823394541605e-05 | 79073997.744 | 94146376.925 | 109396928.759 | 804866.818 |
| 2.01216591835193e-05 | 78536525.415 | 93494865.394 | 108629343.033 | 797033.542 |
| 2.01610558979883e-05 | 78002534.251 | 92847684.734 | 107866960.961 | 789276.502 |
| 2.02005297482988e-05 | 77472003.335 | 92204807.849 | 107109749.007 | 781594.956 |
| 2.02400808854768e-05 | 76944911.861 | 91566207.796 | 106357673.833 | 773988.171 |
| 2.02797094608445e-05 | 76421239.133 | 90931857.782 | 105610702.301 | 766455.417 |
| 2.03194156260199e-05 | 75900964.563 | 90301731.17 | 104868801.469 | 758995.976 |
| 2.03591995329182e-05 | 75384067.674 | 89675801.471 | 104131938.591 | 751609.132 |
| 2.03990613337519e-05 | 74870528.094 | 89054042.348 | 103400081.119 | 744294.18 |
| 2.04390011810316e-05 | 74360325.562 | 88436427.614 | 102673196.697 | 737050.42 |
| 2.04790192275663e-05 | 73853439.924 | 87822931.229 | 101951253.163 | 729877.159 |
| 2.05191156264644e-05 | 73349851.132 | 87213527.305 | 101234218.547 | 722773.711 |
| 2.05592905311341e-05 | 72849539.245 | 86608190.098 | 100522061.071 | 715739.397 |
| 2.05995440952838e-05 | 72352484.429 | 86006894.014 | 99814749.147 | 708773.543 |
| 2.06398764729229e-05 | 71858666.955 | 85409613.603 | 99112251.377 | 701875.484 |
| 2.06802878183624e-05 | 71368067.201 | 84816323.562 | 98414536.55 | 695044.559 |
| 2.07207782862153e-05 | 70880665.648 | 84226998.733 | 97721573.644 | 688280.116 |
| 2.07613480313975e-05 | 70396442.881 | 83641614.102 | 97033331.822 | 681581.506 |
| 2.08019972091281e-05 | 69915379.593 | 83060144.797 | 96349780.433 | 674948.091 |
| 2.08427259749302e-05 | 69437456.577 | 82482566.092 | 95670889.01 | 668379.234 |
| 2.08835344846312e-05 | 68962654.731 | 81908853.4 | 94996627.272 | 661874.307 |
| 2.09244228943638e-05 | 68490955.054 | 81338982.278 | 94326965.117 | 655432.69 |
| 2.09653913605664e-05 | 68022338.651 | 80772928.422 | 93661872.627 | 649053.764 |
| 2.10064400399835e-05 | 67556786.725 | 80210667.669 | 93001320.063 | 642736.921 |
| 2.10475690896667e-05 | 67094280.582 | 79652175.996 | 92345277.867 | 636481.556 |
| 2.10887786669749e-05 | 66634801.632 | 79097429.518 | 91693716.659 | 630287.07 |
| 2.11300689295754e-05 | 66178331.381 | 78546404.488 | 91046607.237 | 624152.872 |
| 2.11714400354438e-05 | 65724851.44 | 77999077.297 | 90403920.575 | 618078.373 |
| 2.12128921428654e-05 | 65274343.515 | 77455424.473 | 89765627.824 | 612062.995 |
| 2.12544254104351e-05 | 64826789.415 | 76915422.679 | 89131700.31 | 606106.16 |
| 2.12960399970585e-05 | 64382171.048 | 76379048.714 | 88502109.532 | 600207.3 |
| 2.13377360619522e-05 | 63940470.419 | 75846279.513 | 87876827.163 | 594365.849 |
| 2.13795137646447e-05 | 63501669.633 | 75317092.143 | 87255825.047 | 588581.25 |
| 2.14213732649768e-05 | 63065750.89 | 74791463.806 | 86639075.201 | 582852.949 |
| 2.1463314723102e-05 | 62632696.49 | 74269371.836 | 86026549.811 | 577180.397 |
| 2.15053382994877e-05 | 62202488.829 | 73750793.7 | 85418221.232 | 571563.054 |
| 2.15474441549153e-05 | 61775110.401 | 73235706.997 | 84814061.99 | 566000.38 |
| 2.15896324504812e-05 | 61350543.793 | 72724089.454 | 84214044.775 | 560491.845 |
| 2.16319033475969e-05 | 60928771.69 | 72215918.932 | 83618142.446 | 555036.92 |
| 2.16742570079901e-05 | 60509776.873 | 71711173.418 | 83026328.028 | 549635.086 |
| 2.17166935937053e-05 | 60093542.216 | 71209831.031 | 82438574.709 | 544285.823 |
| 2.1759213267104e-05 | 59680050.689 | 70711870.016 | 81854855.844 | 538988.623 |
| 2.18018161908658e-05 | 59269285.354 | 70217268.747 | 81275144.947 | 533742.976 |
| 2.18445025279886e-05 | 58861229.368 | 69726005.724 | 80699415.699 | 528548.382 |
| 2.18872724417897e-05 | 58455865.983 | 69238059.575 | 80127641.937 | 523404.344 |
| 2.1930126095906e-05 | 58053178.54 | 68753409.053 | 79559797.664 | 518310.37 |
| 2.19730636542947e-05 | 57653150.476 | 68272033.034 | 78995857.039 | 513265.972 |
| 2.20160852812343e-05 | 57255765.318 | 67793910.521 | 78435794.38 | 508270.668 |
| 2.20591911413247e-05 | 56861006.685 | 67319020.641 | 77879584.163 | 503323.981 |
| 2.21023813994882e-05 | 56468858.287 | 66847342.643 | 77327201.024 | 498425.436 |
| 2.21456562209699e-05 | 56079303.926 | 66378855.898 | 76778619.75 | 493574.566 |
| 2.21890157713385e-05 | 55692327.493 | 65913539.9 | 76233815.288 | 488770.907 |
| 2.22324602164868e-05 | 55307912.969 | 65451374.265 | 75692762.736 | 484013.999 |
| 2.22759897226327e-05 | 54926044.425 | 64992338.73 | 75155437.347 | 479303.387 |
| 2.23196044563191e-05 | 54546706.022 | 64536413.149 | 74621814.527 | 474638.62 |
| 2.23633045844154e-05 | 54169882.009 | 64083577.498 | 74091869.834 | 470019.253 |
| 2.24070902741173e-05 | 53795556.722 | 63633811.873 | 73565578.976 | 465444.843 |
| 2.24509616929481e-05 | 53423714.588 | 63187096.485 | 73042917.812 | 460914.953 |
| 2.24949190087592e-05 | 53054340.118 | 62743411.666 | 72523862.35 | 456429.15 |
| 2.25389623897304e-05 | 52687417.914 | 62302737.864 | 72008388.748 | 451987.004 |
| 2.2583092004371e-05 | 52322932.662 | 61865055.641 | 71496473.309 | 447588.091 |
| 2.262730802152e-05 | 51960869.134 | 61430345.678 | 70988092.485 | 443231.99 |
| 2.26716106103471e-05 | 51601212.191 | 60998588.771 | 70483222.874 | 438918.284 |
| 2.27159999403533e-05 | 51243946.777 | 60569765.829 | 69981841.218 | 434646.561 |
| 2.27604761813714e-05 | 50889057.921 | 60143857.877 | 69483924.406 | 430416.412 |
| 2.28050395035666e-05 | 50536530.738 | 59720846.051 | 68989449.468 | 426227.432 |
| 2.28496900774375e-05 | 50186350.428 | 59300711.603 | 68498393.577 | 422079.221 |
| 2.28944280738162e-05 | 49838502.274 | 58883435.895 | 68010734.051 | 417971.382 |
| 2.29392536638697e-05 | 49492971.642 | 58469000.402 | 67526448.347 | 413903.523 |
| 2.29841670190999e-05 | 49149743.981 | 58057386.709 | 67045514.062 | 409875.253 |
| 2.30291683113443e-05 | 48808804.825 | 57648576.512 | 66567908.933 | 405886.188 |
| 2.30742577127772e-05 | 48470139.789 | 57242551.619 | 66093610.838 | 401935.946 |
| 2.31194353959099e-05 | 48133734.57 | 56839293.944 | 65622597.791 | 398024.149 |
| 2.31647015335912e-05 | 47799574.947 | 56438785.512 | 65154847.944 | 394150.423 |
| 2.32100562990088e-05 | 47467646.78 | 56041008.455 | 64690339.586 | 390314.398 |
| 2.3255499865689e-05 | 47137936.01 | 55645945.016 | 64229051.141 | 386515.707 |
| 2.33010324074982e-05 | 46810428.658 | 55253577.54 | 63770961.169 | 382753.986 |
| 2.33466540986431e-05 | 46485110.826 | 54863888.482 | 63316048.363 | 379028.876 |
| 2.33923651136714e-05 | 46161968.696 | 54476860.403 | 62864291.55 | 375340.02 |
| 2.34381656274726e-05 | 45840988.529 | 54092475.968 | 62415669.692 | 371687.065 |
| 2.34840558152789e-05 | 45522156.663 | 53710717.948 | 61970161.88 | 368069.662 |
| 2.3530035852665e-05 | 45205459.518 | 53331569.217 | 61527747.338 | 364487.465 |
| 2.357610591555e-05 | 44890883.59 | 52955012.755 | 61088405.419 | 360940.132 |
| 2.3622266180197e-05 | 44578415.454 | 52581031.643 | 60652115.608 | 357427.322 |
| 2.36685168232143e-05 | 44268041.761 | 52209609.066 | 60218857.517 | 353948.701 |
| 2.37148580215561e-05 | 43959749.24 | 51840728.311 | 59788610.888 | 350503.934 |
| 2.37612899525231e-05 | 43653524.698 | 51474372.765 | 59361355.589 | 347092.694 |
| 2.38078127937629e-05 | 43349355.016 | 51110525.919 | 58937071.616 | 343714.653 |
| 2.38544267232711e-05 | 43047227.153 | 50749171.362 | 58515739.091 | 340369.489 |
| 2.39011319193918e-05 | 42747128.142 | 50390292.783 | 58097338.261 | 337056.881 |
| 2.39479285608182e-05 | 42449045.092 | 50033873.973 | 57681849.498 | 333776.512 |
| 2.39948168265935e-05 | 42152965.187 | 49679898.819 | 57269253.299 | 330528.07 |
| 2.40417968961113e-05 | 41858875.685 | 49328351.308 | 56859530.281 | 327311.242 |
| 2.40888689491165e-05 | 41566763.92 | 48979215.523 | 56452661.187 | 324125.722 |
| 2.4136033165706e-05 | 41276617.297 | 48632475.647 | 56048626.881 | 320971.205 |
| 2.41832897263291e-05 | 40988423.295 | 48288115.959 | 55647408.348 | 317847.388 |
| 2.42306388117888e-05 | 40702169.469 | 47946120.831 | 55248986.692 | 314753.974 |
| 2.42780806032417e-05 | 40417843.443 | 47606474.736 | 54853343.139 | 311690.666 |
| 2.43256152821993e-05 | 40135432.915 | 47269162.238 | 54460459.033 | 308657.172 |
| 2.43732430305285e-05 | 39854925.655 | 46934167.997 | 54070315.836 | 305653.2 |
| 2.4420964030452e-05 | 39576309.504 | 46601476.769 | 53682895.129 | 302678.465 |
| 2.44687784645498e-05 | 39299572.375 | 46271073.4 | 53298178.609 | 299732.68 |
| 2.45166865157588e-05 | 39024702.252 | 45942942.833 | 52916148.09 | 296815.565 |
| 2.45646883673745e-05 | 38751687.189 | 45617070.101 | 52536785.5 | 293926.841 |
| 2.46127842030511e-05 | 38480515.31 | 45293440.33 | 52160072.884 | 291066.231 |
| 2.46609742068024e-05 | 38211174.809 | 44972038.737 | 51785992.401 | 288233.461 |
| 2.47092585630025e-05 | 37943653.95 | 44652850.631 | 51414526.324 | 285428.261 |
| 2.47576374563865e-05 | 37677941.067 | 44335861.412 | 51045657.036 | 282650.363 |
| 2.48061110720512e-05 | 37414024.56 | 44021056.569 | 50679367.037 | 279899.5 |
| 2.48546795954558e-05 | 37151892.899 | 43708421.681 | 50315638.934 | 277175.409 |
| 2.49033432124225e-05 | 36891534.624 | 43397942.416 | 49954455.45 | 274477.83 |
| 2.49521021091376e-05 | 36632938.34 | 43089604.531 | 49595799.414 | 271806.505 |
| 2.50009564721517e-05 | 36376092.72 | 42783393.871 | 49239653.768 | 269161.179 |
| 2.50499064883806e-05 | 36120986.505 | 42479296.369 | 48886001.56 | 266541.598 |
| 2.50989523451064e-05 | 35867608.502 | 42177298.044 | 48534825.949 | 263947.512 |
| 2.51480942299775e-05 | 35615947.584 | 41877385.004 | 48186110.2 | 261378.672 |
| 2.519733233101e-05 | 35365992.692 | 41579543.44 | 47839837.688 | 258834.833 |
| 2.5246666836588e-05 | 35117732.831 | 41283759.631 | 47495991.892 | 256315.752 |
| 2.52960979354643e-05 | 34871157.071 | 40990019.941 | 47154556.396 | 253821.188 |
| 2.53456258167616e-05 | 34626254.549 | 40698310.819 | 46815514.893 | 251350.901 |
| 2.53952506699725e-05 | 34383014.464 | 40408618.797 | 46478851.179 | 248904.657 |
| 2.5444972684961e-05 | 34141426.082 | 40120930.491 | 46144549.152 | 246482.22 |
| 2.54947920519625e-05 | 33901478.732 | 39835232.603 | 45812592.815 | 244083.359 |
| 2.5544708961585e-05 | 33663161.806 | 39551511.915 | 45482966.277 | 241707.845 |
| 2.55947236048098e-05 | 33426464.761 | 39269755.291 | 45155653.743 | 239355.451 |
| 2.5644836172992e-05 | 33191377.115 | 38989949.68 | 44830639.525 | 237025.951 |
| 2.56950468578614e-05 | 32957888.45 | 38712082.111 | 44507908.033 | 234719.122 |
| 2.57453558515232e-05 | 32725988.411 | 38436139.693 | 44187443.779 | 232434.744 |
| 2.57957633464587e-05 | 32495666.704 | 38162109.616 | 43869231.375 | 230172.599 |
| 2.58462695355261e-05 | 32266913.097 | 37889979.152 | 43553255.53 | 227932.47 |
| 2.58968746119611e-05 | 32039717.419 | 37619735.651 | 43239501.054 | 225714.143 |
| 2.59475787693779e-05 | 31814069.561 | 37351366.542 | 42927952.855 | 223517.405 |
| 2.59983822017697e-05 | 31589959.475 | 37084859.334 | 42618595.937 | 221342.047 |
| 2.60492851035096e-05 | 31367377.172 | 36820201.613 | 42311415.401 | 219187.86 |
| 2.6100287669351e-05 | 31146312.725 | 36557381.044 | 42006396.447 | 217054.639 |
| 2.61513900944289e-05 | 30926756.264 | 36296385.37 | 41703524.367 | 214942.179 |
| 2.62025925742604e-05 | 30708697.982 | 36037202.409 | 41402784.551 | 212850.278 |
| 2.62538953047451e-05 | 30492128.13 | 35779820.057 | 41104162.482 | 210778.736 |
| 2.63052984821664e-05 | 30277037.016 | 35524226.286 | 40807643.738 | 208727.356 |
| 2.6356802303192e-05 | 30063415.009 | 35270409.143 | 40513213.99 | 206695.94 |
| 2.64084069648745e-05 | 29851252.535 | 35018356.752 | 40220859.003 | 204684.295 |
| 2.64601126646525e-05 | 29640540.078 | 34768057.31 | 39930564.632 | 202692.228 |
| 2.65119196003511e-05 | 29431268.181 | 34519499.089 | 39642316.827 | 200719.549 |
| 2.65638279701826e-05 | 29223427.443 | 34272670.436 | 39356101.626 | 198766.068 |
| 2.66158379727476e-05 | 29017008.52 | 34027559.769 | 39071905.16 | 196831.599 |
| 2.66679498070354e-05 | 28812002.125 | 33784155.583 | 38789713.649 | 194915.958 |
| 2.6720163672425e-05 | 28608399.028 | 33542446.443 | 38509513.403 | 193018.96 |
| 2.67724797686856e-05 | 28406190.054 | 33302420.986 | 38231290.823 | 191140.425 |
| 2.68248982959778e-05 | 28205366.085 | 33064067.922 | 37955032.394 | 189280.172 |
| 2.68774194548539e-05 | 28005918.058 | 32827376.034 | 37680724.694 | 187438.024 |
| 2.69300434462589e-05 | 27807836.966 | 32592334.173 | 37408354.384 | 185613.804 |
| 2.69827704715313e-05 | 27611113.855 | 32358931.262 | 37137908.217 | 183807.338 |
| 2.70356007324037e-05 | 27415739.827 | 32127156.295 | 36869373.027 | 182018.454 |
| 2.70885344310038e-05 | 27221706.039 | 31896998.335 | 36602735.738 | 180246.98 |
| 2.7141571769855e-05 | 27029003.701 | 31668446.514 | 36337983.358 | 178492.746 |
| 2.71947129518771e-05 | 26837624.077 | 31441490.035 | 36075102.979 | 176755.586 |
| 2.72479581803874e-05 | 26647558.484 | 31216118.168 | 35814081.778 | 175035.332 |
| 2.73013076591013e-05 | 26458798.293 | 30992320.251 | 35554907.017 | 173331.82 |
| 2.73547615921327e-05 | 26271334.928 | 30770085.69 | 35297566.04 | 171644.887 |
| 2.74083201839956e-05 | 26085159.865 | 30549403.961 | 35042046.274 | 169974.372 |
| 2.74619836396042e-05 | 25900264.632 | 30330264.603 | 34788335.228 | 168320.116 |
| 2.75157521642739e-05 | 25716640.811 | 30112657.225 | 34536420.494 | 166681.959 |
| 2.75696259637221e-05 | 25534280.032 | 29896571.5 | 34286289.745 | 165059.746 |
| 2.76236052440689e-05 | 25353173.98 | 29681997.168 | 34037930.733 | 163453.32 |
| 2.76776902118383e-05 | 25173314.39 | 29468924.035 | 33791331.293 | 161862.529 |
| 2.77318810739583e-05 | 24994693.048 | 29257341.971 | 33546479.339 | 160287.22 |
| 2.77861780377621e-05 | 24817301.79 | 29047240.912 | 33303362.862 | 158727.242 |
| 2.78405813109891e-05 | 24641132.504 | 28838610.856 | 33061969.936 | 157182.447 |
| 2.78950911017851e-05 | 24466177.125 | 28631441.869 | 32822288.71 | 155652.687 |
| 2.79497076187036e-05 | 24292427.64 | 28425724.076 | 32584307.412 | 154137.814 |
| 2.80044310707065e-05 | 24119876.087 | 28221447.669 | 32348014.349 | 152637.685 |
| 2.80592616671647e-05 | 23948514.55 | 28018602.901 | 32113397.903 | 151152.156 |
| 2.81141996178591e-05 | 23778335.163 | 27817180.088 | 31880446.532 | 149681.085 |
| 2.81692451329814e-05 | 23609330.111 | 27617169.608 | 31649148.771 | 148224.33 |
| 2.82243984231346e-05 | 23441491.623 | 27418561.901 | 31419493.232 | 146781.753 |
| 2.82796596993343e-05 | 23274811.981 | 27221347.468 | 31191468.6 | 145353.216 |
| 2.83350291730092e-05 | 23109283.512 | 27025516.871 | 30965063.635 | 143938.582 |
| 2.83905070560019e-05 | 22944898.591 | 26831060.734 | 30740267.172 | 142537.716 |
| 2.84460935605698e-05 | 22781649.641 | 26637969.739 | 30517068.119 | 141150.484 |
| 2.85017888993858e-05 | 22619529.13 | 26446234.63 | 30295455.456 | 139776.753 |
| 2.85575932855393e-05 | 22458529.578 | 26255846.21 | 30075418.239 | 138416.391 |
| 2.86135069325369e-05 | 22298643.545 | 26066795.341 | 29856945.594 | 137069.269 |
| 2.86695300543033e-05 | 22139863.642 | 25879072.943 | 29640026.719 | 135735.258 |
| 2.87256628651819e-05 | 21982182.524 | 25692669.998 | 29424650.885 | 134414.229 |
| 2.87819055799358e-05 | 21825592.893 | 25507577.542 | 29210807.431 | 133106.058 |
| 2.88382584137487e-05 | 21670087.495 | 25323786.671 | 28998485.77 | 131810.618 |
| 2.88947215822255e-05 | 21515659.123 | 25141288.538 | 28787675.382 | 130527.786 |
| 2.89512953013932e-05 | 21362300.613 | 24960074.355 | 28578365.82 | 129257.439 |
| 2.9007979787702e-05 | 21210004.849 | 24780135.387 | 28370546.704 | 127999.455 |
| 2.90647752580257e-05 | 21058764.756 | 24601462.959 | 28164207.723 | 126753.715 |
| 2.91216819296627e-05 | 20908573.306 | 24424048.451 | 27959338.635 | 125520.098 |
| 2.91787000203369e-05 | 20759423.512 | 24247883.299 | 27755929.266 | 124298.488 |
| 2.92358297481986e-05 | 20611308.434 | 24072958.993 | 27553969.509 | 123088.767 |
| 2.9293071331825e-05 | 20464221.174 | 23899267.08 | 27353449.324 | 121890.819 |
| 2.93504249902215e-05 | 20318154.878 | 23726799.162 | 27154358.739 | 120704.53 |
| 2.94078909428221e-05 | 20173102.733 | 23555546.894 | 26956687.847 | 119529.787 |
| 2.94654694094906e-05 | 20029057.971 | 23385501.986 | 26760426.808 | 118366.477 |
| 2.9523160610521e-05 | 19886013.866 | 23216656.202 | 26565565.846 | 117214.488 |
| 2.9580964766639e-05 | 19743963.734 | 23049001.358 | 26372095.251 | 116073.711 |
| 2.96388820990022e-05 | 19602900.933 | 22882529.326 | 26180005.378 | 114944.037 |
| 2.96969128292013e-05 | 19462818.863 | 22717232.029 | 25989286.646 | 113825.357 |
| 2.97550571792608e-05 | 19323710.967 | 22553101.443 | 25799929.538 | 112717.564 |
| 2.981331537164e-05 | 19185570.726 | 22390129.596 | 25611924.599 | 111620.553 |
| 2.98716876292337e-05 | 19048391.665 | 22228308.567 | 25425262.438 | 110534.219 |
| 2.99301741753731e-05 | 18912167.349 | 22067630.49 | 25239933.728 | 109458.457 |
| 2.99887752338267e-05 | 18776891.384 | 21908087.546 | 25055929.203 | 108393.165 |
| 3.00474910288011e-05 | 18642557.415 | 21749671.971 | 24873239.659 | 107338.24 |
| 3.01063217849418e-05 | 18509159.129 | 21592376.047 | 24691855.952 | 106293.583 |
| 3.01652677273344e-05 | 18376690.253 | 21436192.112 | 24511769.003 | 105259.092 |
| 3.0224329081505e-05 | 18245144.551 | 21281112.549 | 24332969.789 | 104234.67 |
| 3.02835060734211e-05 | 18114515.829 | 21127129.794 | 24155449.352 | 103220.218 |
| 3.03427989294931e-05 | 17984797.932 | 20974236.331 | 23979198.789 | 102215.639 |
| 3.04022078765742e-05 | 17855984.744 | 20822424.694 | 23804209.261 | 101220.836 |
| 3.0461733141962e-05 | 17728070.188 | 20671687.465 | 23630471.986 | 100235.716 |
| 3.05213749533992e-05 | 17601048.223 | 20522017.276 | 23457978.241 | 99260.183 |
| 3.05811335390742e-05 | 17474912.85 | 20373406.805 | 23286719.362 | 98294.144 |
| 3.06410091276224e-05 | 17349658.107 | 20225848.779 | 23116686.743 | 97337.507 |
| 3.07010019481267e-05 | 17225278.068 | 20079335.974 | 22947871.834 | 96390.181 |
| 3.07611122301185e-05 | 17101766.848 | 19933861.213 | 22780266.145 | 95452.074 |
| 3.08213402035788e-05 | 16979118.596 | 19789417.364 | 22613861.242 | 94523.098 |
| 3.08816860989386e-05 | 16857327.502 | 19645997.343 | 22448648.746 | 93603.162 |
| 3.09421501470803e-05 | 16736387.789 | 19503594.115 | 22284620.338 | 92692.18 |
| 3.10027325793382e-05 | 16616293.719 | 19362200.687 | 22121767.751 | 91790.064 |
| 3.10634336274998e-05 | 16497039.592 | 19221810.115 | 21960082.775 | 90896.727 |
| 3.1124253523806e-05 | 16378619.742 | 19082415.499 | 21799557.257 | 90012.085 |
| 3.11851925009528e-05 | 16261028.54 | 18944009.986 | 21640183.095 | 89136.052 |
| 3.12462507920916e-05 | 16144260.394 | 18806586.767 | 21481952.246 | 88268.546 |
| 3.13074286308304e-05 | 16028309.745 | 18670139.077 | 21324856.717 | 87409.482 |
| 3.13687262512343e-05 | 15913171.073 | 18534660.199 | 21168888.572 | 86558.779 |
| 3.14301438878272e-05 | 15798838.891 | 18400143.455 | 21014039.927 | 85716.355 |
| 3.14916817755916e-05 | 15685307.748 | 18266582.217 | 20860302.951 | 84882.13 |
| 3.15533401499706e-05 | 15572572.227 | 18133969.895 | 20707669.866 | 84056.024 |
| 3.16151192468679e-05 | 15460626.949 | 18002299.947 | 20556132.947 | 83237.959 |
| 3.16770193026494e-05 | 15349466.564 | 17871565.872 | 20405684.521 | 82427.854 |
| 3.17390405541434e-05 | 15239085.762 | 17741761.212 | 20256316.966 | 81625.635 |
| 3.18011832386421e-05 | 15129479.263 | 17612879.552 | 20108022.712 | 80831.222 |
| 3.18634475939025e-05 | 15020641.822 | 17484914.521 | 19960794.24 | 80044.541 |
| 3.19258338581469e-05 | 14912568.23 | 17357859.787 | 19814624.082 | 79265.517 |
| 3.19883422700638e-05 | 14805253.309 | 17231709.061 | 19669504.821 | 78494.074 |
| 3.20509730688095e-05 | 14698691.914 | 17106456.098 | 19525429.088 | 77730.139 |
| 3.21137264940083e-05 | 14592878.935 | 16982094.692 | 19382389.567 | 76973.639 |
| 3.21766027857536e-05 | 14487809.293 | 16858618.678 | 19240378.989 | 76224.502 |
| 3.2239602184609e-05 | 14383477.945 | 16736021.933 | 19099390.136 | 75482.656 |
| 3.2302724931609e-05 | 14279879.876 | 16614298.374 | 18959415.837 | 74748.029 |
| 3.23659712682603e-05 | 14177010.108 | 16493441.959 | 18820448.97 | 74020.552 |
| 3.24293414365422e-05 | 14074863.69 | 16373446.685 | 18682482.463 | 73300.155 |
| 3.24928356789077e-05 | 13973435.708 | 16254306.589 | 18545509.29 | 72586.77 |
| 3.25564542382848e-05 | 13872721.277 | 16136015.75 | 18409522.474 | 71880.327 |
| 3.26201973580769e-05 | 13772715.544 | 16018568.282 | 18274515.085 | 71180.76 |
| 3.26840652821641e-05 | 13673413.688 | 15901958.343 | 18140480.238 | 70488.001 |
| 3.27480582549039e-05 | 13574810.918 | 15786180.125 | 18007411.098 | 69801.985 |
| 3.28121765211322e-05 | 13476902.475 | 15671227.863 | 17875300.874 | 69122.645 |
| 3.28764203261645e-05 | 13379683.631 | 15557095.827 | 17744142.822 | 68449.916 |
| 3.29407899157963e-05 | 13283149.687 | 15443778.328 | 17613930.245 | 67783.735 |
| 3.30052855363046e-05 | 13187295.978 | 15331269.713 | 17484656.489 | 67124.037 |
| 3.30699074344485e-05 | 13092117.865 | 15219564.366 | 17356314.947 | 66470.76 |
| 3.31346558574703e-05 | 12997610.742 | 15108656.712 | 17228899.057 | 65823.841 |
| 3.31995310530961e-05 | 12903770.032 | 14998541.209 | 17102402.3 | 65183.218 |
| 3.32645332695374e-05 | 12810591.187 | 14889212.354 | 16976818.204 | 64548.829 |
| 3.33296627554916e-05 | 12718069.691 | 14780664.681 | 16852140.338 | 63920.615 |
| 3.33949197601427e-05 | 12626201.054 | 14672892.76 | 16728362.318 | 63298.515 |
| 3.34603045331631e-05 | 12534980.817 | 14565891.198 | 16605477.801 | 62682.469 |
| 3.35258173247137e-05 | 12444404.551 | 14459654.635 | 16483480.488 | 62072.419 |
| 3.35914583854452e-05 | 12354467.855 | 14354177.752 | 16362364.123 | 61468.306 |
| 3.36572279664991e-05 | 12265166.355 | 14249455.261 | 16242122.494 | 60870.073 |
| 3.37231263195088e-05 | 12176495.709 | 14145481.912 | 16122749.428 | 60277.662 |
| 3.37891536966002e-05 | 12088451.599 | 14042252.49 | 16004238.799 | 59691.016 |
| 3.38553103503928e-05 | 12001029.739 | 13939761.812 | 15886584.517 | 59110.08 |
| 3.39215965340008e-05 | 11914225.87 | 13838004.734 | 15769780.539 | 58534.798 |
| 3.3988012501034e-05 | 11828035.759 | 13736976.143 | 15653820.86 | 57965.114 |
| 3.40545585055985e-05 | 11742455.202 | 13636670.963 | 15538699.517 | 57400.975 |
| 3.41212348022985e-05 | 11657480.024 | 13537084.15 | 15424410.588 | 56842.327 |
| 3.4188041646236e-05 | 11573106.074 | 13438210.695 | 15310948.191 | 56289.115 |
| 3.4254979293013e-05 | 11489329.231 | 13340045.621 | 15198306.485 | 55741.287 |
| 3.43220479987317e-05 | 11406145.399 | 13242583.988 | 15086479.667 | 55198.792 |
| 3.43892480199957e-05 | 11323550.511 | 13145820.885 | 14975461.977 | 54661.576 |
| 3.44565796139111e-05 | 11241540.525 | 13049751.436 | 14865247.692 | 54129.588 |
| 3.45240430380875e-05 | 11160111.425 | 12954370.798 | 14755831.128 | 53602.778 |
| 3.45916385506386e-05 | 11079259.224 | 12859674.16 | 14647206.641 | 53081.095 |
| 3.46593664101838e-05 | 10998979.958 | 12765656.744 | 14539368.626 | 52564.489 |
| 3.47272268758485e-05 | 10919269.69 | 12672313.803 | 14432311.515 | 52052.911 |
| 3.47952202072658e-05 | 10840124.511 | 12579640.623 | 14326029.78 | 51546.312 |
| 3.48633466645768e-05 | 10761540.535 | 12487632.521 | 14220517.93 | 51044.643 |
| 3.49316065084323e-05 | 10683513.903 | 12396284.847 | 14115770.51 | 50547.857 |
| 3.49999999999932e-05 | 10606040.78 | 12305592.98 | 14011782.106 | 50055.905 |